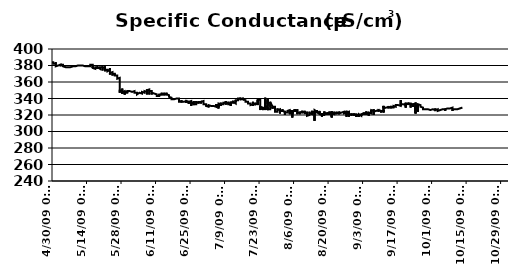
| Category | uS/cm |
|---|---|
| 10/13/09 | 329 |
| 10/13/09 | 328 |
| 10/13/09 | 328 |
| 10/13/09 | 328 |
| 10/13/09 | 328 |
| 10/13/09 | 328 |
| 10/13/09 | 328 |
| 10/13/09 | 328 |
| 10/13/09 | 328 |
| 10/13/09 | 328 |
| 10/13/09 | 328 |
| 10/13/09 | 328 |
| 10/13/09 | 328 |
| 10/13/09 | 328 |
| 10/13/09 | 328 |
| 10/13/09 | 328 |
| 10/13/09 | 328 |
| 10/13/09 | 329 |
| 10/13/09 | 329 |
| 10/13/09 | 329 |
| 10/13/09 | 329 |
| 10/13/09 | 329 |
| 10/13/09 | 329 |
| 10/13/09 | 329 |
| 10/13/09 | 329 |
| 10/13/09 | 329 |
| 10/13/09 | 329 |
| 10/13/09 | 329 |
| 10/13/09 | 329 |
| 10/13/09 | 328 |
| 10/13/09 | 328 |
| 10/13/09 | 328 |
| 10/12/09 | 328 |
| 10/12/09 | 328 |
| 10/12/09 | 328 |
| 10/12/09 | 328 |
| 10/12/09 | 328 |
| 10/12/09 | 328 |
| 10/12/09 | 328 |
| 10/12/09 | 328 |
| 10/12/09 | 328 |
| 10/12/09 | 328 |
| 10/12/09 | 328 |
| 10/12/09 | 328 |
| 10/12/09 | 328 |
| 10/12/09 | 328 |
| 10/12/09 | 328 |
| 10/12/09 | 328 |
| 10/12/09 | 328 |
| 10/12/09 | 328 |
| 10/12/09 | 328 |
| 10/12/09 | 328 |
| 10/12/09 | 328 |
| 10/12/09 | 328 |
| 10/12/09 | 328 |
| 10/12/09 | 328 |
| 10/12/09 | 328 |
| 10/12/09 | 328 |
| 10/12/09 | 328 |
| 10/12/09 | 328 |
| 10/12/09 | 328 |
| 10/12/09 | 328 |
| 10/12/09 | 328 |
| 10/12/09 | 328 |
| 10/12/09 | 328 |
| 10/12/09 | 328 |
| 10/12/09 | 328 |
| 10/12/09 | 328 |
| 10/12/09 | 328 |
| 10/12/09 | 328 |
| 10/12/09 | 328 |
| 10/12/09 | 328 |
| 10/12/09 | 328 |
| 10/12/09 | 328 |
| 10/12/09 | 328 |
| 10/12/09 | 328 |
| 10/12/09 | 328 |
| 10/12/09 | 328 |
| 10/12/09 | 328 |
| 10/12/09 | 328 |
| 10/11/09 | 327 |
| 10/11/09 | 327 |
| 10/11/09 | 328 |
| 10/11/09 | 328 |
| 10/11/09 | 328 |
| 10/11/09 | 328 |
| 10/11/09 | 328 |
| 10/11/09 | 328 |
| 10/11/09 | 328 |
| 10/11/09 | 328 |
| 10/11/09 | 328 |
| 10/11/09 | 327 |
| 10/11/09 | 327 |
| 10/11/09 | 327 |
| 10/11/09 | 328 |
| 10/11/09 | 328 |
| 10/11/09 | 328 |
| 10/11/09 | 327 |
| 10/11/09 | 328 |
| 10/11/09 | 327 |
| 10/11/09 | 327 |
| 10/11/09 | 327 |
| 10/11/09 | 327 |
| 10/11/09 | 327 |
| 10/11/09 | 327 |
| 10/11/09 | 327 |
| 10/11/09 | 327 |
| 10/11/09 | 328 |
| 10/11/09 | 328 |
| 10/11/09 | 328 |
| 10/11/09 | 328 |
| 10/11/09 | 328 |
| 10/11/09 | 328 |
| 10/11/09 | 328 |
| 10/11/09 | 328 |
| 10/11/09 | 328 |
| 10/11/09 | 328 |
| 10/11/09 | 328 |
| 10/11/09 | 328 |
| 10/11/09 | 328 |
| 10/11/09 | 328 |
| 10/11/09 | 328 |
| 10/11/09 | 328 |
| 10/11/09 | 328 |
| 10/11/09 | 328 |
| 10/11/09 | 327 |
| 10/11/09 | 327 |
| 10/11/09 | 327 |
| 10/10/09 | 327 |
| 10/10/09 | 327 |
| 10/10/09 | 327 |
| 10/10/09 | 327 |
| 10/10/09 | 327 |
| 10/10/09 | 327 |
| 10/10/09 | 327 |
| 10/10/09 | 327 |
| 10/10/09 | 327 |
| 10/10/09 | 326 |
| 10/10/09 | 326 |
| 10/10/09 | 326 |
| 10/10/09 | 326 |
| 10/10/09 | 326 |
| 10/10/09 | 326 |
| 10/10/09 | 326 |
| 10/10/09 | 327 |
| 10/10/09 | 327 |
| 10/10/09 | 326 |
| 10/10/09 | 327 |
| 10/10/09 | 327 |
| 10/10/09 | 327 |
| 10/10/09 | 327 |
| 10/10/09 | 327 |
| 10/10/09 | 327 |
| 10/10/09 | 326 |
| 10/10/09 | 326 |
| 10/10/09 | 327 |
| 10/10/09 | 327 |
| 10/10/09 | 327 |
| 10/10/09 | 327 |
| 10/10/09 | 327 |
| 10/10/09 | 326 |
| 10/10/09 | 326 |
| 10/10/09 | 326 |
| 10/10/09 | 327 |
| 10/10/09 | 327 |
| 10/10/09 | 328 |
| 10/10/09 | 328 |
| 10/10/09 | 328 |
| 10/10/09 | 328 |
| 10/10/09 | 327 |
| 10/10/09 | 327 |
| 10/10/09 | 327 |
| 10/10/09 | 327 |
| 10/10/09 | 327 |
| 10/10/09 | 327 |
| 10/10/09 | 327 |
| 10/9/09 | 327 |
| 10/9/09 | 327 |
| 10/9/09 | 327 |
| 10/9/09 | 328 |
| 10/9/09 | 327 |
| 10/9/09 | 327 |
| 10/9/09 | 327 |
| 10/9/09 | 327 |
| 10/9/09 | 327 |
| 10/9/09 | 327 |
| 10/9/09 | 327 |
| 10/9/09 | 328 |
| 10/9/09 | 328 |
| 10/9/09 | 327 |
| 10/9/09 | 328 |
| 10/9/09 | 328 |
| 10/9/09 | 327 |
| 10/9/09 | 327 |
| 10/9/09 | 327 |
| 10/9/09 | 327 |
| 10/9/09 | 327 |
| 10/9/09 | 326 |
| 10/9/09 | 327 |
| 10/9/09 | 327 |
| 10/9/09 | 327 |
| 10/9/09 | 326 |
| 10/9/09 | 326 |
| 10/9/09 | 326 |
| 10/9/09 | 326 |
| 10/9/09 | 325 |
| 10/9/09 | 324 |
| 10/9/09 | 326 |
| 10/9/09 | 326 |
| 10/9/09 | 327 |
| 10/9/09 | 328 |
| 10/9/09 | 328 |
| 10/9/09 | 328 |
| 10/9/09 | 328 |
| 10/9/09 | 328 |
| 10/9/09 | 329 |
| 10/9/09 | 328 |
| 10/9/09 | 328 |
| 10/9/09 | 328 |
| 10/9/09 | 329 |
| 10/9/09 | 328 |
| 10/9/09 | 328 |
| 10/9/09 | 328 |
| 10/9/09 | 328 |
| 10/8/09 | 328 |
| 10/8/09 | 327 |
| 10/8/09 | 328 |
| 10/8/09 | 328 |
| 10/8/09 | 328 |
| 10/8/09 | 328 |
| 10/8/09 | 328 |
| 10/8/09 | 328 |
| 10/8/09 | 328 |
| 10/8/09 | 328 |
| 10/8/09 | 327 |
| 10/8/09 | 328 |
| 10/8/09 | 328 |
| 10/8/09 | 328 |
| 10/8/09 | 328 |
| 10/8/09 | 329 |
| 10/8/09 | 328 |
| 10/8/09 | 328 |
| 10/8/09 | 328 |
| 10/8/09 | 328 |
| 10/8/09 | 328 |
| 10/8/09 | 328 |
| 10/8/09 | 328 |
| 10/8/09 | 328 |
| 10/8/09 | 328 |
| 10/8/09 | 329 |
| 10/8/09 | 329 |
| 10/8/09 | 329 |
| 10/8/09 | 328 |
| 10/8/09 | 329 |
| 10/8/09 | 328 |
| 10/8/09 | 328 |
| 10/8/09 | 328 |
| 10/8/09 | 328 |
| 10/8/09 | 328 |
| 10/8/09 | 328 |
| 10/8/09 | 328 |
| 10/8/09 | 328 |
| 10/8/09 | 328 |
| 10/8/09 | 328 |
| 10/8/09 | 328 |
| 10/8/09 | 328 |
| 10/8/09 | 328 |
| 10/8/09 | 328 |
| 10/8/09 | 328 |
| 10/8/09 | 328 |
| 10/8/09 | 328 |
| 10/8/09 | 328 |
| 10/7/09 | 328 |
| 10/7/09 | 328 |
| 10/7/09 | 328 |
| 10/7/09 | 328 |
| 10/7/09 | 328 |
| 10/7/09 | 328 |
| 10/7/09 | 327 |
| 10/7/09 | 327 |
| 10/7/09 | 328 |
| 10/7/09 | 328 |
| 10/7/09 | 328 |
| 10/7/09 | 327 |
| 10/7/09 | 327 |
| 10/7/09 | 327 |
| 10/7/09 | 327 |
| 10/7/09 | 328 |
| 10/7/09 | 328 |
| 10/7/09 | 328 |
| 10/7/09 | 327 |
| 10/7/09 | 328 |
| 10/7/09 | 328 |
| 10/7/09 | 327 |
| 10/7/09 | 327 |
| 10/7/09 | 327 |
| 10/7/09 | 328 |
| 10/7/09 | 327 |
| 10/7/09 | 328 |
| 10/7/09 | 327 |
| 10/7/09 | 327 |
| 10/7/09 | 327 |
| 10/7/09 | 327 |
| 10/7/09 | 327 |
| 10/7/09 | 328 |
| 10/7/09 | 327 |
| 10/7/09 | 327 |
| 10/7/09 | 327 |
| 10/7/09 | 328 |
| 10/7/09 | 327 |
| 10/7/09 | 328 |
| 10/7/09 | 327 |
| 10/7/09 | 328 |
| 10/7/09 | 327 |
| 10/7/09 | 327 |
| 10/7/09 | 327 |
| 10/7/09 | 327 |
| 10/7/09 | 327 |
| 10/7/09 | 327 |
| 10/7/09 | 327 |
| 10/6/09 | 327 |
| 10/6/09 | 327 |
| 10/6/09 | 327 |
| 10/6/09 | 326 |
| 10/6/09 | 326 |
| 10/6/09 | 326 |
| 10/6/09 | 327 |
| 10/6/09 | 327 |
| 10/6/09 | 327 |
| 10/6/09 | 327 |
| 10/6/09 | 327 |
| 10/6/09 | 326 |
| 10/6/09 | 326 |
| 10/6/09 | 327 |
| 10/6/09 | 327 |
| 10/6/09 | 327 |
| 10/6/09 | 327 |
| 10/6/09 | 326 |
| 10/6/09 | 326 |
| 10/6/09 | 327 |
| 10/6/09 | 326 |
| 10/6/09 | 327 |
| 10/6/09 | 327 |
| 10/6/09 | 326 |
| 10/6/09 | 326 |
| 10/6/09 | 327 |
| 10/6/09 | 327 |
| 10/6/09 | 327 |
| 10/6/09 | 327 |
| 10/6/09 | 326 |
| 10/6/09 | 326 |
| 10/6/09 | 326 |
| 10/6/09 | 327 |
| 10/6/09 | 326 |
| 10/6/09 | 327 |
| 10/6/09 | 327 |
| 10/6/09 | 327 |
| 10/6/09 | 325 |
| 10/6/09 | 327 |
| 10/6/09 | 327 |
| 10/6/09 | 327 |
| 10/6/09 | 327 |
| 10/6/09 | 327 |
| 10/6/09 | 327 |
| 10/6/09 | 327 |
| 10/6/09 | 327 |
| 10/6/09 | 327 |
| 10/6/09 | 327 |
| 10/5/09 | 327 |
| 10/5/09 | 327 |
| 10/5/09 | 326 |
| 10/5/09 | 327 |
| 10/5/09 | 326 |
| 10/5/09 | 326 |
| 10/5/09 | 327 |
| 10/5/09 | 327 |
| 10/5/09 | 327 |
| 10/5/09 | 327 |
| 10/5/09 | 326 |
| 10/5/09 | 327 |
| 10/5/09 | 327 |
| 10/5/09 | 327 |
| 10/5/09 | 327 |
| 10/5/09 | 326 |
| 10/5/09 | 327 |
| 10/5/09 | 326 |
| 10/5/09 | 326 |
| 10/5/09 | 327 |
| 10/5/09 | 326 |
| 10/5/09 | 326 |
| 10/5/09 | 326 |
| 10/5/09 | 326 |
| 10/5/09 | 326 |
| 10/5/09 | 326 |
| 10/5/09 | 326 |
| 10/5/09 | 326 |
| 10/5/09 | 326 |
| 10/5/09 | 326 |
| 10/5/09 | 326 |
| 10/5/09 | 326 |
| 10/5/09 | 326 |
| 10/5/09 | 326 |
| 10/5/09 | 326 |
| 10/5/09 | 326 |
| 10/5/09 | 326 |
| 10/5/09 | 326 |
| 10/5/09 | 326 |
| 10/5/09 | 326 |
| 10/5/09 | 326 |
| 10/5/09 | 326 |
| 10/5/09 | 326 |
| 10/5/09 | 326 |
| 10/5/09 | 326 |
| 10/5/09 | 326 |
| 10/5/09 | 326 |
| 10/5/09 | 326 |
| 10/4/09 | 326 |
| 10/4/09 | 326 |
| 10/4/09 | 326 |
| 10/4/09 | 326 |
| 10/4/09 | 326 |
| 10/4/09 | 326 |
| 10/4/09 | 326 |
| 10/4/09 | 326 |
| 10/4/09 | 326 |
| 10/4/09 | 326 |
| 10/4/09 | 326 |
| 10/4/09 | 326 |
| 10/4/09 | 326 |
| 10/4/09 | 326 |
| 10/4/09 | 326 |
| 10/4/09 | 326 |
| 10/4/09 | 326 |
| 10/4/09 | 326 |
| 10/4/09 | 326 |
| 10/4/09 | 326 |
| 10/4/09 | 326 |
| 10/4/09 | 326 |
| 10/4/09 | 326 |
| 10/4/09 | 326 |
| 10/4/09 | 326 |
| 10/4/09 | 326 |
| 10/4/09 | 326 |
| 10/4/09 | 326 |
| 10/4/09 | 326 |
| 10/4/09 | 326 |
| 10/4/09 | 326 |
| 10/4/09 | 326 |
| 10/4/09 | 326 |
| 10/4/09 | 326 |
| 10/4/09 | 326 |
| 10/4/09 | 326 |
| 10/4/09 | 326 |
| 10/4/09 | 326 |
| 10/4/09 | 325 |
| 10/4/09 | 326 |
| 10/4/09 | 325 |
| 10/4/09 | 325 |
| 10/4/09 | 325 |
| 10/4/09 | 325 |
| 10/4/09 | 325 |
| 10/4/09 | 325 |
| 10/4/09 | 325 |
| 10/4/09 | 325 |
| 10/3/09 | 325 |
| 10/3/09 | 325 |
| 10/3/09 | 326 |
| 10/3/09 | 326 |
| 10/3/09 | 326 |
| 10/3/09 | 326 |
| 10/3/09 | 326 |
| 10/3/09 | 326 |
| 10/3/09 | 325 |
| 10/3/09 | 326 |
| 10/3/09 | 326 |
| 10/3/09 | 326 |
| 10/3/09 | 326 |
| 10/3/09 | 326 |
| 10/3/09 | 325 |
| 10/3/09 | 325 |
| 10/3/09 | 325 |
| 10/3/09 | 324 |
| 10/3/09 | 325 |
| 10/3/09 | 325 |
| 10/3/09 | 325 |
| 10/3/09 | 325 |
| 10/3/09 | 325 |
| 10/3/09 | 325 |
| 10/3/09 | 326 |
| 10/3/09 | 326 |
| 10/3/09 | 327 |
| 10/3/09 | 326 |
| 10/3/09 | 327 |
| 10/3/09 | 326 |
| 10/3/09 | 326 |
| 10/3/09 | 326 |
| 10/3/09 | 326 |
| 10/3/09 | 326 |
| 10/3/09 | 326 |
| 10/3/09 | 326 |
| 10/3/09 | 326 |
| 10/3/09 | 326 |
| 10/3/09 | 327 |
| 10/3/09 | 326 |
| 10/3/09 | 326 |
| 10/3/09 | 326 |
| 10/3/09 | 326 |
| 10/3/09 | 326 |
| 10/3/09 | 326 |
| 10/3/09 | 326 |
| 10/3/09 | 326 |
| 10/3/09 | 326 |
| 10/2/09 | 326 |
| 10/2/09 | 326 |
| 10/2/09 | 326 |
| 10/2/09 | 326 |
| 10/2/09 | 326 |
| 10/2/09 | 326 |
| 10/2/09 | 326 |
| 10/2/09 | 326 |
| 10/2/09 | 327 |
| 10/2/09 | 326 |
| 10/2/09 | 326 |
| 10/2/09 | 326 |
| 10/2/09 | 326 |
| 10/2/09 | 326 |
| 10/2/09 | 326 |
| 10/2/09 | 326 |
| 10/2/09 | 326 |
| 10/2/09 | 327 |
| 10/2/09 | 328 |
| 10/2/09 | 328 |
| 10/2/09 | 328 |
| 10/2/09 | 328 |
| 10/2/09 | 328 |
| 10/2/09 | 328 |
| 10/2/09 | 328 |
| 10/2/09 | 328 |
| 10/2/09 | 327 |
| 10/2/09 | 327 |
| 10/2/09 | 327 |
| 10/2/09 | 327 |
| 10/2/09 | 327 |
| 10/2/09 | 327 |
| 10/2/09 | 326 |
| 10/2/09 | 327 |
| 10/2/09 | 327 |
| 10/2/09 | 327 |
| 10/2/09 | 327 |
| 10/2/09 | 327 |
| 10/2/09 | 327 |
| 10/2/09 | 327 |
| 10/2/09 | 327 |
| 10/2/09 | 327 |
| 10/2/09 | 327 |
| 10/2/09 | 327 |
| 10/2/09 | 326 |
| 10/2/09 | 327 |
| 10/2/09 | 326 |
| 10/2/09 | 327 |
| 10/1/09 | 327 |
| 10/1/09 | 326 |
| 10/1/09 | 327 |
| 10/1/09 | 327 |
| 10/1/09 | 327 |
| 10/1/09 | 326 |
| 10/1/09 | 326 |
| 10/1/09 | 326 |
| 10/1/09 | 326 |
| 10/1/09 | 326 |
| 10/1/09 | 327 |
| 10/1/09 | 326 |
| 10/1/09 | 327 |
| 10/1/09 | 326 |
| 10/1/09 | 326 |
| 10/1/09 | 326 |
| 10/1/09 | 327 |
| 10/1/09 | 327 |
| 10/1/09 | 326 |
| 10/1/09 | 327 |
| 10/1/09 | 326 |
| 10/1/09 | 327 |
| 10/1/09 | 327 |
| 10/1/09 | 326 |
| 10/1/09 | 326 |
| 10/1/09 | 327 |
| 10/1/09 | 327 |
| 10/1/09 | 327 |
| 10/1/09 | 326 |
| 10/1/09 | 326 |
| 10/1/09 | 326 |
| 10/1/09 | 326 |
| 10/1/09 | 326 |
| 10/1/09 | 326 |
| 10/1/09 | 326 |
| 10/1/09 | 326 |
| 10/1/09 | 327 |
| 10/1/09 | 326 |
| 10/1/09 | 326 |
| 10/1/09 | 326 |
| 10/1/09 | 326 |
| 10/1/09 | 326 |
| 10/1/09 | 326 |
| 10/1/09 | 326 |
| 10/1/09 | 327 |
| 10/1/09 | 326 |
| 10/1/09 | 326 |
| 10/1/09 | 327 |
| 9/30/09 | 326 |
| 9/30/09 | 326 |
| 9/30/09 | 326 |
| 9/30/09 | 326 |
| 9/30/09 | 326 |
| 9/30/09 | 326 |
| 9/30/09 | 327 |
| 9/30/09 | 326 |
| 9/30/09 | 327 |
| 9/30/09 | 327 |
| 9/30/09 | 327 |
| 9/30/09 | 327 |
| 9/30/09 | 327 |
| 9/30/09 | 326 |
| 9/30/09 | 327 |
| 9/30/09 | 327 |
| 9/30/09 | 327 |
| 9/30/09 | 327 |
| 9/30/09 | 327 |
| 9/30/09 | 327 |
| 9/30/09 | 327 |
| 9/30/09 | 327 |
| 9/30/09 | 326 |
| 9/30/09 | 327 |
| 9/30/09 | 327 |
| 9/30/09 | 327 |
| 9/30/09 | 327 |
| 9/30/09 | 327 |
| 9/30/09 | 327 |
| 9/30/09 | 327 |
| 9/30/09 | 327 |
| 9/30/09 | 327 |
| 9/30/09 | 327 |
| 9/30/09 | 327 |
| 9/30/09 | 326 |
| 9/30/09 | 327 |
| 9/30/09 | 327 |
| 9/30/09 | 326 |
| 9/30/09 | 326 |
| 9/30/09 | 327 |
| 9/30/09 | 327 |
| 9/30/09 | 327 |
| 9/30/09 | 327 |
| 9/30/09 | 327 |
| 9/30/09 | 327 |
| 9/30/09 | 326 |
| 9/30/09 | 327 |
| 9/30/09 | 327 |
| 9/29/09 | 327 |
| 9/29/09 | 327 |
| 9/29/09 | 327 |
| 9/29/09 | 327 |
| 9/29/09 | 327 |
| 9/29/09 | 327 |
| 9/29/09 | 327 |
| 9/29/09 | 327 |
| 9/29/09 | 327 |
| 9/29/09 | 327 |
| 9/29/09 | 327 |
| 9/29/09 | 327 |
| 9/29/09 | 327 |
| 9/29/09 | 327 |
| 9/29/09 | 327 |
| 9/29/09 | 327 |
| 9/29/09 | 327 |
| 9/29/09 | 327 |
| 9/29/09 | 327 |
| 9/29/09 | 327 |
| 9/29/09 | 327 |
| 9/29/09 | 326 |
| 9/29/09 | 326 |
| 9/29/09 | 327 |
| 9/29/09 | 327 |
| 9/29/09 | 326 |
| 9/29/09 | 327 |
| 9/29/09 | 327 |
| 9/29/09 | 327 |
| 9/29/09 | 327 |
| 9/29/09 | 327 |
| 9/29/09 | 326 |
| 9/29/09 | 327 |
| 9/29/09 | 327 |
| 9/29/09 | 327 |
| 9/29/09 | 327 |
| 9/29/09 | 327 |
| 9/29/09 | 327 |
| 9/29/09 | 326 |
| 9/29/09 | 326 |
| 9/29/09 | 326 |
| 9/29/09 | 327 |
| 9/29/09 | 326 |
| 9/29/09 | 326 |
| 9/29/09 | 326 |
| 9/29/09 | 326 |
| 9/29/09 | 326 |
| 9/29/09 | 326 |
| 9/28/09 | 327 |
| 9/28/09 | 327 |
| 9/28/09 | 326 |
| 9/28/09 | 327 |
| 9/28/09 | 327 |
| 9/28/09 | 327 |
| 9/28/09 | 327 |
| 9/28/09 | 327 |
| 9/28/09 | 327 |
| 9/28/09 | 326 |
| 9/28/09 | 327 |
| 9/28/09 | 327 |
| 9/28/09 | 327 |
| 9/28/09 | 327 |
| 9/28/09 | 327 |
| 9/28/09 | 327 |
| 9/28/09 | 327 |
| 9/28/09 | 327 |
| 9/28/09 | 327 |
| 9/28/09 | 327 |
| 9/28/09 | 326 |
| 9/28/09 | 327 |
| 9/28/09 | 326 |
| 9/28/09 | 326 |
| 9/28/09 | 327 |
| 9/28/09 | 326 |
| 9/28/09 | 327 |
| 9/28/09 | 326 |
| 9/28/09 | 327 |
| 9/28/09 | 327 |
| 9/28/09 | 327 |
| 9/28/09 | 327 |
| 9/28/09 | 327 |
| 9/28/09 | 327 |
| 9/28/09 | 327 |
| 9/28/09 | 327 |
| 9/28/09 | 326 |
| 9/28/09 | 327 |
| 9/28/09 | 327 |
| 9/28/09 | 327 |
| 9/28/09 | 328 |
| 9/28/09 | 328 |
| 9/28/09 | 327 |
| 9/28/09 | 327 |
| 9/28/09 | 327 |
| 9/28/09 | 328 |
| 9/28/09 | 327 |
| 9/28/09 | 327 |
| 9/27/09 | 327 |
| 9/27/09 | 328 |
| 9/27/09 | 328 |
| 9/27/09 | 328 |
| 9/27/09 | 328 |
| 9/27/09 | 328 |
| 9/27/09 | 327 |
| 9/27/09 | 328 |
| 9/27/09 | 328 |
| 9/27/09 | 328 |
| 9/27/09 | 327 |
| 9/27/09 | 328 |
| 9/27/09 | 327 |
| 9/27/09 | 328 |
| 9/27/09 | 328 |
| 9/27/09 | 328 |
| 9/27/09 | 328 |
| 9/27/09 | 327 |
| 9/27/09 | 327 |
| 9/27/09 | 328 |
| 9/27/09 | 328 |
| 9/27/09 | 328 |
| 9/27/09 | 328 |
| 9/27/09 | 328 |
| 9/27/09 | 328 |
| 9/27/09 | 328 |
| 9/27/09 | 328 |
| 9/27/09 | 328 |
| 9/27/09 | 328 |
| 9/27/09 | 328 |
| 9/27/09 | 328 |
| 9/27/09 | 328 |
| 9/27/09 | 328 |
| 9/27/09 | 329 |
| 9/27/09 | 329 |
| 9/27/09 | 330 |
| 9/27/09 | 329 |
| 9/27/09 | 330 |
| 9/27/09 | 330 |
| 9/27/09 | 330 |
| 9/27/09 | 330 |
| 9/27/09 | 330 |
| 9/27/09 | 330 |
| 9/27/09 | 330 |
| 9/27/09 | 330 |
| 9/27/09 | 330 |
| 9/27/09 | 330 |
| 9/27/09 | 330 |
| 9/26/09 | 330 |
| 9/26/09 | 330 |
| 9/26/09 | 330 |
| 9/26/09 | 330 |
| 9/26/09 | 330 |
| 9/26/09 | 329 |
| 9/26/09 | 330 |
| 9/26/09 | 329 |
| 9/26/09 | 329 |
| 9/26/09 | 329 |
| 9/26/09 | 330 |
| 9/26/09 | 330 |
| 9/26/09 | 330 |
| 9/26/09 | 330 |
| 9/26/09 | 330 |
| 9/26/09 | 331 |
| 9/26/09 | 331 |
| 9/26/09 | 331 |
| 9/26/09 | 331 |
| 9/26/09 | 332 |
| 9/26/09 | 332 |
| 9/26/09 | 332 |
| 9/26/09 | 332 |
| 9/26/09 | 333 |
| 9/26/09 | 332 |
| 9/26/09 | 332 |
| 9/26/09 | 332 |
| 9/26/09 | 332 |
| 9/26/09 | 332 |
| 9/26/09 | 332 |
| 9/26/09 | 332 |
| 9/26/09 | 333 |
| 9/26/09 | 333 |
| 9/26/09 | 333 |
| 9/26/09 | 333 |
| 9/26/09 | 333 |
| 9/26/09 | 333 |
| 9/26/09 | 332 |
| 9/26/09 | 332 |
| 9/26/09 | 332 |
| 9/26/09 | 332 |
| 9/26/09 | 332 |
| 9/26/09 | 332 |
| 9/26/09 | 333 |
| 9/26/09 | 333 |
| 9/26/09 | 333 |
| 9/26/09 | 333 |
| 9/26/09 | 333 |
| 9/25/09 | 333 |
| 9/25/09 | 332 |
| 9/25/09 | 332 |
| 9/25/09 | 333 |
| 9/25/09 | 333 |
| 9/25/09 | 333 |
| 9/25/09 | 333 |
| 9/25/09 | 333 |
| 9/25/09 | 332 |
| 9/25/09 | 333 |
| 9/25/09 | 333 |
| 9/25/09 | 333 |
| 9/25/09 | 333 |
| 9/25/09 | 333 |
| 9/25/09 | 332 |
| 9/25/09 | 332 |
| 9/25/09 | 332 |
| 9/25/09 | 332 |
| 9/25/09 | 332 |
| 9/25/09 | 332 |
| 9/25/09 | 332 |
| 9/25/09 | 333 |
| 9/25/09 | 333 |
| 9/25/09 | 333 |
| 9/25/09 | 332 |
| 9/25/09 | 332 |
| 9/25/09 | 324 |
| 9/25/09 | 332 |
| 9/25/09 | 331 |
| 9/25/09 | 332 |
| 9/25/09 | 332 |
| 9/25/09 | 332 |
| 9/25/09 | 332 |
| 9/25/09 | 332 |
| 9/25/09 | 333 |
| 9/25/09 | 333 |
| 9/25/09 | 333 |
| 9/25/09 | 332 |
| 9/25/09 | 333 |
| 9/25/09 | 332 |
| 9/25/09 | 332 |
| 9/25/09 | 332 |
| 9/25/09 | 331 |
| 9/25/09 | 331 |
| 9/25/09 | 331 |
| 9/25/09 | 331 |
| 9/25/09 | 331 |
| 9/25/09 | 331 |
| 9/24/09 | 331 |
| 9/24/09 | 330 |
| 9/24/09 | 331 |
| 9/24/09 | 331 |
| 9/24/09 | 332 |
| 9/24/09 | 332 |
| 9/24/09 | 333 |
| 9/24/09 | 333 |
| 9/24/09 | 332 |
| 9/24/09 | 333 |
| 9/24/09 | 333 |
| 9/24/09 | 332 |
| 9/24/09 | 332 |
| 9/24/09 | 335 |
| 9/24/09 | 332 |
| 9/24/09 | 331 |
| 9/24/09 | 322 |
| 9/24/09 | 332 |
| 9/24/09 | 331 |
| 9/24/09 | 331 |
| 9/24/09 | 332 |
| 9/24/09 | 322 |
| 9/24/09 | 328 |
| 9/24/09 | 328 |
| 9/24/09 | 330 |
| 9/24/09 | 331 |
| 9/24/09 | 330 |
| 9/24/09 | 330 |
| 9/24/09 | 330 |
| 9/24/09 | 330 |
| 9/24/09 | 330 |
| 9/24/09 | 330 |
| 9/24/09 | 331 |
| 9/24/09 | 330 |
| 9/24/09 | 330 |
| 9/24/09 | 329 |
| 9/24/09 | 329 |
| 9/24/09 | 329 |
| 9/24/09 | 328 |
| 9/24/09 | 329 |
| 9/24/09 | 330 |
| 9/24/09 | 332 |
| 9/24/09 | 332 |
| 9/24/09 | 333 |
| 9/24/09 | 333 |
| 9/24/09 | 333 |
| 9/24/09 | 334 |
| 9/24/09 | 333 |
| 9/23/09 | 333 |
| 9/23/09 | 333 |
| 9/23/09 | 333 |
| 9/23/09 | 332 |
| 9/23/09 | 332 |
| 9/23/09 | 332 |
| 9/23/09 | 332 |
| 9/23/09 | 333 |
| 9/23/09 | 333 |
| 9/23/09 | 333 |
| 9/23/09 | 333 |
| 9/23/09 | 333 |
| 9/23/09 | 334 |
| 9/23/09 | 333 |
| 9/23/09 | 333 |
| 9/23/09 | 330 |
| 9/23/09 | 333 |
| 9/23/09 | 330 |
| 9/23/09 | 333 |
| 9/23/09 | 333 |
| 9/23/09 | 332 |
| 9/23/09 | 333 |
| 9/23/09 | 333 |
| 9/23/09 | 333 |
| 9/23/09 | 333 |
| 9/23/09 | 332 |
| 9/23/09 | 332 |
| 9/23/09 | 333 |
| 9/23/09 | 333 |
| 9/23/09 | 333 |
| 9/23/09 | 333 |
| 9/23/09 | 333 |
| 9/23/09 | 333 |
| 9/23/09 | 333 |
| 9/23/09 | 333 |
| 9/23/09 | 333 |
| 9/23/09 | 333 |
| 9/23/09 | 333 |
| 9/23/09 | 333 |
| 9/23/09 | 333 |
| 9/23/09 | 333 |
| 9/23/09 | 332 |
| 9/23/09 | 332 |
| 9/23/09 | 332 |
| 9/23/09 | 332 |
| 9/23/09 | 332 |
| 9/23/09 | 332 |
| 9/23/09 | 333 |
| 9/22/09 | 333 |
| 9/22/09 | 333 |
| 9/22/09 | 333 |
| 9/22/09 | 333 |
| 9/22/09 | 333 |
| 9/22/09 | 333 |
| 9/22/09 | 333 |
| 9/22/09 | 333 |
| 9/22/09 | 333 |
| 9/22/09 | 333 |
| 9/22/09 | 333 |
| 9/22/09 | 333 |
| 9/22/09 | 332 |
| 9/22/09 | 332 |
| 9/22/09 | 329 |
| 9/22/09 | 332 |
| 9/22/09 | 332 |
| 9/22/09 | 332 |
| 9/22/09 | 332 |
| 9/22/09 | 332 |
| 9/22/09 | 332 |
| 9/22/09 | 333 |
| 9/22/09 | 332 |
| 9/22/09 | 331 |
| 9/22/09 | 331 |
| 9/22/09 | 331 |
| 9/22/09 | 331 |
| 9/22/09 | 332 |
| 9/22/09 | 333 |
| 9/22/09 | 333 |
| 9/22/09 | 333 |
| 9/22/09 | 332 |
| 9/22/09 | 333 |
| 9/22/09 | 334 |
| 9/22/09 | 334 |
| 9/22/09 | 333 |
| 9/22/09 | 332 |
| 9/22/09 | 332 |
| 9/22/09 | 332 |
| 9/22/09 | 333 |
| 9/22/09 | 333 |
| 9/22/09 | 334 |
| 9/22/09 | 334 |
| 9/22/09 | 334 |
| 9/22/09 | 334 |
| 9/22/09 | 334 |
| 9/22/09 | 334 |
| 9/22/09 | 334 |
| 9/21/09 | 334 |
| 9/21/09 | 333 |
| 9/21/09 | 333 |
| 9/21/09 | 333 |
| 9/21/09 | 334 |
| 9/21/09 | 334 |
| 9/21/09 | 334 |
| 9/21/09 | 335 |
| 9/21/09 | 334 |
| 9/21/09 | 334 |
| 9/21/09 | 333 |
| 9/21/09 | 334 |
| 9/21/09 | 334 |
| 9/21/09 | 334 |
| 9/21/09 | 334 |
| 9/21/09 | 334 |
| 9/21/09 | 333 |
| 9/21/09 | 332 |
| 9/21/09 | 333 |
| 9/21/09 | 332 |
| 9/21/09 | 332 |
| 9/21/09 | 332 |
| 9/21/09 | 333 |
| 9/21/09 | 332 |
| 9/21/09 | 333 |
| 9/21/09 | 333 |
| 9/21/09 | 333 |
| 9/21/09 | 334 |
| 9/21/09 | 333 |
| 9/21/09 | 333 |
| 9/21/09 | 333 |
| 9/21/09 | 333 |
| 9/21/09 | 333 |
| 9/21/09 | 333 |
| 9/21/09 | 333 |
| 9/21/09 | 333 |
| 9/21/09 | 333 |
| 9/21/09 | 333 |
| 9/21/09 | 333 |
| 9/21/09 | 333 |
| 9/21/09 | 333 |
| 9/21/09 | 333 |
| 9/21/09 | 333 |
| 9/21/09 | 333 |
| 9/21/09 | 333 |
| 9/21/09 | 333 |
| 9/21/09 | 333 |
| 9/21/09 | 334 |
| 9/20/09 | 333 |
| 9/20/09 | 333 |
| 9/20/09 | 333 |
| 9/20/09 | 333 |
| 9/20/09 | 333 |
| 9/20/09 | 332 |
| 9/20/09 | 333 |
| 9/20/09 | 335 |
| 9/20/09 | 335 |
| 9/20/09 | 335 |
| 9/20/09 | 329 |
| 9/20/09 | 334 |
| 9/20/09 | 333 |
| 9/20/09 | 333 |
| 9/20/09 | 333 |
| 9/20/09 | 332 |
| 9/20/09 | 332 |
| 9/20/09 | 332 |
| 9/20/09 | 333 |
| 9/20/09 | 333 |
| 9/20/09 | 333 |
| 9/20/09 | 334 |
| 9/20/09 | 334 |
| 9/20/09 | 333 |
| 9/20/09 | 332 |
| 9/20/09 | 332 |
| 9/20/09 | 332 |
| 9/20/09 | 333 |
| 9/20/09 | 333 |
| 9/20/09 | 333 |
| 9/20/09 | 333 |
| 9/20/09 | 333 |
| 9/20/09 | 333 |
| 9/20/09 | 333 |
| 9/20/09 | 333 |
| 9/20/09 | 333 |
| 9/20/09 | 333 |
| 9/20/09 | 333 |
| 9/20/09 | 333 |
| 9/20/09 | 333 |
| 9/20/09 | 333 |
| 9/20/09 | 333 |
| 9/20/09 | 333 |
| 9/20/09 | 333 |
| 9/20/09 | 333 |
| 9/20/09 | 333 |
| 9/20/09 | 333 |
| 9/20/09 | 333 |
| 9/19/09 | 333 |
| 9/19/09 | 333 |
| 9/19/09 | 333 |
| 9/19/09 | 333 |
| 9/19/09 | 334 |
| 9/19/09 | 334 |
| 9/19/09 | 334 |
| 9/19/09 | 333 |
| 9/19/09 | 333 |
| 9/19/09 | 333 |
| 9/19/09 | 334 |
| 9/19/09 | 334 |
| 9/19/09 | 334 |
| 9/19/09 | 332 |
| 9/19/09 | 332 |
| 9/19/09 | 332 |
| 9/19/09 | 332 |
| 9/19/09 | 333 |
| 9/19/09 | 334 |
| 9/19/09 | 334 |
| 9/19/09 | 334 |
| 9/19/09 | 333 |
| 9/19/09 | 333 |
| 9/19/09 | 333 |
| 9/19/09 | 333 |
| 9/19/09 | 332 |
| 9/19/09 | 332 |
| 9/19/09 | 332 |
| 9/19/09 | 332 |
| 9/19/09 | 332 |
| 9/19/09 | 333 |
| 9/19/09 | 333 |
| 9/19/09 | 333 |
| 9/19/09 | 332 |
| 9/19/09 | 333 |
| 9/19/09 | 333 |
| 9/19/09 | 333 |
| 9/19/09 | 333 |
| 9/19/09 | 333 |
| 9/19/09 | 333 |
| 9/19/09 | 333 |
| 9/19/09 | 333 |
| 9/19/09 | 333 |
| 9/19/09 | 333 |
| 9/19/09 | 333 |
| 9/19/09 | 333 |
| 9/19/09 | 333 |
| 9/19/09 | 333 |
| 9/18/09 | 333 |
| 9/18/09 | 333 |
| 9/18/09 | 332 |
| 9/18/09 | 332 |
| 9/18/09 | 332 |
| 9/18/09 | 332 |
| 9/18/09 | 332 |
| 9/18/09 | 331 |
| 9/18/09 | 332 |
| 9/18/09 | 338 |
| 9/18/09 | 333 |
| 9/18/09 | 333 |
| 9/18/09 | 333 |
| 9/18/09 | 333 |
| 9/18/09 | 332 |
| 9/18/09 | 332 |
| 9/18/09 | 332 |
| 9/18/09 | 332 |
| 9/18/09 | 332 |
| 9/18/09 | 333 |
| 9/18/09 | 334 |
| 9/18/09 | 333 |
| 9/18/09 | 333 |
| 9/18/09 | 333 |
| 9/18/09 | 333 |
| 9/18/09 | 333 |
| 9/18/09 | 333 |
| 9/18/09 | 332 |
| 9/18/09 | 333 |
| 9/18/09 | 332 |
| 9/18/09 | 333 |
| 9/18/09 | 333 |
| 9/18/09 | 333 |
| 9/18/09 | 333 |
| 9/18/09 | 333 |
| 9/18/09 | 333 |
| 9/18/09 | 332 |
| 9/18/09 | 332 |
| 9/18/09 | 332 |
| 9/18/09 | 331 |
| 9/18/09 | 331 |
| 9/18/09 | 331 |
| 9/18/09 | 332 |
| 9/18/09 | 332 |
| 9/18/09 | 331 |
| 9/18/09 | 331 |
| 9/18/09 | 331 |
| 9/18/09 | 332 |
| 9/17/09 | 332 |
| 9/17/09 | 332 |
| 9/17/09 | 332 |
| 9/17/09 | 332 |
| 9/17/09 | 332 |
| 9/17/09 | 332 |
| 9/17/09 | 332 |
| 9/17/09 | 332 |
| 9/17/09 | 332 |
| 9/17/09 | 332 |
| 9/17/09 | 332 |
| 9/17/09 | 332 |
| 9/17/09 | 332 |
| 9/17/09 | 332 |
| 9/17/09 | 332 |
| 9/17/09 | 332 |
| 9/17/09 | 332 |
| 9/17/09 | 333 |
| 9/17/09 | 333 |
| 9/17/09 | 332 |
| 9/17/09 | 332 |
| 9/17/09 | 332 |
| 9/17/09 | 332 |
| 9/17/09 | 332 |
| 9/17/09 | 332 |
| 9/17/09 | 332 |
| 9/17/09 | 332 |
| 9/17/09 | 332 |
| 9/17/09 | 332 |
| 9/17/09 | 332 |
| 9/17/09 | 332 |
| 9/17/09 | 332 |
| 9/17/09 | 332 |
| 9/17/09 | 333 |
| 9/17/09 | 332 |
| 9/17/09 | 333 |
| 9/17/09 | 333 |
| 9/17/09 | 333 |
| 9/17/09 | 332 |
| 9/17/09 | 332 |
| 9/17/09 | 332 |
| 9/17/09 | 332 |
| 9/17/09 | 332 |
| 9/17/09 | 332 |
| 9/17/09 | 332 |
| 9/17/09 | 332 |
| 9/17/09 | 332 |
| 9/17/09 | 332 |
| 9/16/09 | 332 |
| 9/16/09 | 332 |
| 9/16/09 | 332 |
| 9/16/09 | 332 |
| 9/16/09 | 332 |
| 9/16/09 | 332 |
| 9/16/09 | 332 |
| 9/16/09 | 332 |
| 9/16/09 | 332 |
| 9/16/09 | 332 |
| 9/16/09 | 332 |
| 9/16/09 | 331 |
| 9/16/09 | 332 |
| 9/16/09 | 331 |
| 9/16/09 | 332 |
| 9/16/09 | 331 |
| 9/16/09 | 331 |
| 9/16/09 | 331 |
| 9/16/09 | 331 |
| 9/16/09 | 331 |
| 9/16/09 | 331 |
| 9/16/09 | 331 |
| 9/16/09 | 331 |
| 9/16/09 | 331 |
| 9/16/09 | 331 |
| 9/16/09 | 331 |
| 9/16/09 | 331 |
| 9/16/09 | 331 |
| 9/16/09 | 331 |
| 9/16/09 | 331 |
| 9/16/09 | 331 |
| 9/16/09 | 331 |
| 9/16/09 | 331 |
| 9/16/09 | 331 |
| 9/16/09 | 331 |
| 9/16/09 | 331 |
| 9/16/09 | 331 |
| 9/16/09 | 331 |
| 9/16/09 | 331 |
| 9/16/09 | 331 |
| 9/16/09 | 331 |
| 9/16/09 | 331 |
| 9/16/09 | 331 |
| 9/16/09 | 330 |
| 9/16/09 | 330 |
| 9/16/09 | 330 |
| 9/16/09 | 330 |
| 9/16/09 | 331 |
| 9/15/09 | 331 |
| 9/15/09 | 331 |
| 9/15/09 | 331 |
| 9/15/09 | 331 |
| 9/15/09 | 329 |
| 9/15/09 | 329 |
| 9/15/09 | 329 |
| 9/15/09 | 329 |
| 9/15/09 | 329 |
| 9/15/09 | 331 |
| 9/15/09 | 330 |
| 9/15/09 | 330 |
| 9/15/09 | 332 |
| 9/15/09 | 331 |
| 9/15/09 | 332 |
| 9/15/09 | 331 |
| 9/15/09 | 331 |
| 9/15/09 | 331 |
| 9/15/09 | 331 |
| 9/15/09 | 331 |
| 9/15/09 | 331 |
| 9/15/09 | 331 |
| 9/15/09 | 331 |
| 9/15/09 | 332 |
| 9/15/09 | 332 |
| 9/15/09 | 332 |
| 9/15/09 | 332 |
| 9/15/09 | 331 |
| 9/15/09 | 331 |
| 9/15/09 | 331 |
| 9/15/09 | 331 |
| 9/15/09 | 331 |
| 9/15/09 | 330 |
| 9/15/09 | 330 |
| 9/15/09 | 331 |
| 9/15/09 | 330 |
| 9/15/09 | 331 |
| 9/15/09 | 330 |
| 9/15/09 | 330 |
| 9/15/09 | 331 |
| 9/15/09 | 331 |
| 9/15/09 | 330 |
| 9/15/09 | 330 |
| 9/15/09 | 330 |
| 9/15/09 | 330 |
| 9/15/09 | 330 |
| 9/15/09 | 330 |
| 9/15/09 | 329 |
| 9/14/09 | 329 |
| 9/14/09 | 329 |
| 9/14/09 | 329 |
| 9/14/09 | 329 |
| 9/14/09 | 329 |
| 9/14/09 | 329 |
| 9/14/09 | 329 |
| 9/14/09 | 329 |
| 9/14/09 | 328 |
| 9/14/09 | 330 |
| 9/14/09 | 330 |
| 9/14/09 | 330 |
| 9/14/09 | 331 |
| 9/14/09 | 330 |
| 9/14/09 | 329 |
| 9/14/09 | 329 |
| 9/14/09 | 329 |
| 9/14/09 | 329 |
| 9/14/09 | 330 |
| 9/14/09 | 329 |
| 9/14/09 | 329 |
| 9/14/09 | 331 |
| 9/14/09 | 331 |
| 9/14/09 | 331 |
| 9/14/09 | 331 |
| 9/14/09 | 331 |
| 9/14/09 | 331 |
| 9/14/09 | 330 |
| 9/14/09 | 330 |
| 9/14/09 | 330 |
| 9/14/09 | 330 |
| 9/14/09 | 329 |
| 9/14/09 | 330 |
| 9/14/09 | 330 |
| 9/14/09 | 330 |
| 9/14/09 | 330 |
| 9/14/09 | 330 |
| 9/14/09 | 330 |
| 9/14/09 | 329 |
| 9/14/09 | 329 |
| 9/14/09 | 329 |
| 9/14/09 | 329 |
| 9/14/09 | 329 |
| 9/14/09 | 329 |
| 9/14/09 | 329 |
| 9/14/09 | 330 |
| 9/14/09 | 330 |
| 9/14/09 | 329 |
| 9/13/09 | 329 |
| 9/13/09 | 329 |
| 9/13/09 | 329 |
| 9/13/09 | 329 |
| 9/13/09 | 329 |
| 9/13/09 | 329 |
| 9/13/09 | 329 |
| 9/13/09 | 329 |
| 9/13/09 | 329 |
| 9/13/09 | 328 |
| 9/13/09 | 328 |
| 9/13/09 | 328 |
| 9/13/09 | 329 |
| 9/13/09 | 329 |
| 9/13/09 | 329 |
| 9/13/09 | 329 |
| 9/13/09 | 331 |
| 9/13/09 | 330 |
| 9/13/09 | 330 |
| 9/13/09 | 330 |
| 9/13/09 | 329 |
| 9/13/09 | 329 |
| 9/13/09 | 329 |
| 9/13/09 | 329 |
| 9/13/09 | 330 |
| 9/13/09 | 330 |
| 9/13/09 | 330 |
| 9/13/09 | 329 |
| 9/13/09 | 329 |
| 9/13/09 | 329 |
| 9/13/09 | 329 |
| 9/13/09 | 329 |
| 9/13/09 | 329 |
| 9/13/09 | 329 |
| 9/13/09 | 329 |
| 9/13/09 | 329 |
| 9/13/09 | 329 |
| 9/13/09 | 329 |
| 9/13/09 | 329 |
| 9/13/09 | 329 |
| 9/13/09 | 329 |
| 9/13/09 | 329 |
| 9/13/09 | 329 |
| 9/13/09 | 329 |
| 9/13/09 | 329 |
| 9/13/09 | 329 |
| 9/13/09 | 329 |
| 9/13/09 | 329 |
| 9/12/09 | 329 |
| 9/12/09 | 329 |
| 9/12/09 | 329 |
| 9/12/09 | 329 |
| 9/12/09 | 328 |
| 9/12/09 | 328 |
| 9/12/09 | 329 |
| 9/12/09 | 328 |
| 9/12/09 | 329 |
| 9/12/09 | 329 |
| 9/12/09 | 330 |
| 9/12/09 | 329 |
| 9/12/09 | 329 |
| 9/12/09 | 329 |
| 9/12/09 | 329 |
| 9/12/09 | 329 |
| 9/12/09 | 329 |
| 9/12/09 | 328 |
| 9/12/09 | 328 |
| 9/12/09 | 329 |
| 9/12/09 | 329 |
| 9/12/09 | 329 |
| 9/12/09 | 329 |
| 9/12/09 | 329 |
| 9/12/09 | 329 |
| 9/12/09 | 329 |
| 9/12/09 | 329 |
| 9/12/09 | 329 |
| 9/12/09 | 329 |
| 9/12/09 | 329 |
| 9/12/09 | 329 |
| 9/12/09 | 328 |
| 9/12/09 | 329 |
| 9/12/09 | 328 |
| 9/12/09 | 329 |
| 9/12/09 | 329 |
| 9/12/09 | 329 |
| 9/12/09 | 329 |
| 9/12/09 | 329 |
| 9/12/09 | 328 |
| 9/12/09 | 329 |
| 9/12/09 | 329 |
| 9/12/09 | 328 |
| 9/12/09 | 328 |
| 9/12/09 | 328 |
| 9/12/09 | 328 |
| 9/12/09 | 328 |
| 9/12/09 | 328 |
| 9/11/09 | 328 |
| 9/11/09 | 328 |
| 9/11/09 | 328 |
| 9/11/09 | 328 |
| 9/11/09 | 328 |
| 9/11/09 | 328 |
| 9/11/09 | 328 |
| 9/11/09 | 328 |
| 9/11/09 | 328 |
| 9/11/09 | 328 |
| 9/11/09 | 328 |
| 9/11/09 | 328 |
| 9/11/09 | 328 |
| 9/11/09 | 328 |
| 9/11/09 | 328 |
| 9/11/09 | 328 |
| 9/11/09 | 328 |
| 9/11/09 | 328 |
| 9/11/09 | 331 |
| 9/11/09 | 330 |
| 9/11/09 | 329 |
| 9/11/09 | 329 |
| 9/11/09 | 329 |
| 9/11/09 | 329 |
| 9/11/09 | 329 |
| 9/11/09 | 329 |
| 9/11/09 | 331 |
| 9/11/09 | 324 |
| 9/11/09 | 324 |
| 9/11/09 | 325 |
| 9/11/09 | 325 |
| 9/11/09 | 325 |
| 9/11/09 | 325 |
| 9/11/09 | 325 |
| 9/11/09 | 325 |
| 9/11/09 | 325 |
| 9/11/09 | 326 |
| 9/11/09 | 326 |
| 9/11/09 | 326 |
| 9/11/09 | 326 |
| 9/11/09 | 325 |
| 9/11/09 | 325 |
| 9/11/09 | 325 |
| 9/11/09 | 325 |
| 9/11/09 | 325 |
| 9/11/09 | 323 |
| 9/11/09 | 325 |
| 9/10/09 | 325 |
| 9/10/09 | 325 |
| 9/10/09 | 325 |
| 9/10/09 | 325 |
| 9/10/09 | 325 |
| 9/10/09 | 325 |
| 9/10/09 | 325 |
| 9/10/09 | 325 |
| 9/10/09 | 325 |
| 9/10/09 | 325 |
| 9/10/09 | 325 |
| 9/10/09 | 325 |
| 9/10/09 | 325 |
| 9/10/09 | 325 |
| 9/10/09 | 325 |
| 9/10/09 | 325 |
| 9/10/09 | 325 |
| 9/10/09 | 324 |
| 9/10/09 | 324 |
| 9/10/09 | 324 |
| 9/10/09 | 325 |
| 9/10/09 | 325 |
| 9/10/09 | 325 |
| 9/10/09 | 325 |
| 9/10/09 | 325 |
| 9/10/09 | 325 |
| 9/10/09 | 324 |
| 9/10/09 | 325 |
| 9/10/09 | 325 |
| 9/10/09 | 326 |
| 9/10/09 | 325 |
| 9/10/09 | 325 |
| 9/10/09 | 326 |
| 9/10/09 | 326 |
| 9/10/09 | 326 |
| 9/10/09 | 326 |
| 9/10/09 | 326 |
| 9/10/09 | 326 |
| 9/10/09 | 326 |
| 9/10/09 | 326 |
| 9/10/09 | 323 |
| 9/10/09 | 325 |
| 9/10/09 | 326 |
| 9/10/09 | 326 |
| 9/10/09 | 326 |
| 9/10/09 | 325 |
| 9/10/09 | 325 |
| 9/10/09 | 326 |
| 9/9/09 | 326 |
| 9/9/09 | 326 |
| 9/9/09 | 326 |
| 9/9/09 | 326 |
| 9/9/09 | 326 |
| 9/9/09 | 326 |
| 9/9/09 | 326 |
| 9/9/09 | 325 |
| 9/9/09 | 325 |
| 9/9/09 | 325 |
| 9/9/09 | 325 |
| 9/9/09 | 326 |
| 9/9/09 | 325 |
| 9/9/09 | 324 |
| 9/9/09 | 325 |
| 9/9/09 | 325 |
| 9/9/09 | 325 |
| 9/9/09 | 325 |
| 9/9/09 | 325 |
| 9/9/09 | 324 |
| 9/9/09 | 324 |
| 9/9/09 | 324 |
| 9/9/09 | 324 |
| 9/9/09 | 325 |
| 9/9/09 | 326 |
| 9/9/09 | 326 |
| 9/9/09 | 326 |
| 9/9/09 | 326 |
| 9/9/09 | 325 |
| 9/9/09 | 326 |
| 9/9/09 | 326 |
| 9/9/09 | 326 |
| 9/9/09 | 325 |
| 9/9/09 | 325 |
| 9/9/09 | 326 |
| 9/9/09 | 326 |
| 9/9/09 | 326 |
| 9/9/09 | 326 |
| 9/9/09 | 326 |
| 9/9/09 | 326 |
| 9/9/09 | 326 |
| 9/9/09 | 326 |
| 9/9/09 | 325 |
| 9/9/09 | 325 |
| 9/9/09 | 325 |
| 9/9/09 | 326 |
| 9/9/09 | 326 |
| 9/9/09 | 325 |
| 9/8/09 | 325 |
| 9/8/09 | 325 |
| 9/8/09 | 325 |
| 9/8/09 | 325 |
| 9/8/09 | 325 |
| 9/8/09 | 325 |
| 9/8/09 | 324 |
| 9/8/09 | 324 |
| 9/8/09 | 324 |
| 9/8/09 | 324 |
| 9/8/09 | 324 |
| 9/8/09 | 324 |
| 9/8/09 | 324 |
| 9/8/09 | 325 |
| 9/8/09 | 325 |
| 9/8/09 | 324 |
| 9/8/09 | 324 |
| 9/8/09 | 324 |
| 9/8/09 | 324 |
| 9/8/09 | 324 |
| 9/8/09 | 325 |
| 9/8/09 | 325 |
| 9/8/09 | 325 |
| 9/8/09 | 325 |
| 9/8/09 | 325 |
| 9/8/09 | 325 |
| 9/8/09 | 325 |
| 9/8/09 | 325 |
| 9/8/09 | 325 |
| 9/8/09 | 325 |
| 9/8/09 | 325 |
| 9/8/09 | 325 |
| 9/8/09 | 325 |
| 9/8/09 | 325 |
| 9/8/09 | 325 |
| 9/8/09 | 325 |
| 9/8/09 | 325 |
| 9/8/09 | 325 |
| 9/8/09 | 325 |
| 9/8/09 | 325 |
| 9/8/09 | 325 |
| 9/8/09 | 325 |
| 9/8/09 | 325 |
| 9/8/09 | 325 |
| 9/8/09 | 325 |
| 9/8/09 | 325 |
| 9/8/09 | 325 |
| 9/8/09 | 324 |
| 9/7/09 | 324 |
| 9/7/09 | 324 |
| 9/7/09 | 324 |
| 9/7/09 | 320 |
| 9/7/09 | 323 |
| 9/7/09 | 324 |
| 9/7/09 | 324 |
| 9/7/09 | 324 |
| 9/7/09 | 323 |
| 9/7/09 | 323 |
| 9/7/09 | 324 |
| 9/7/09 | 324 |
| 9/7/09 | 325 |
| 9/7/09 | 325 |
| 9/7/09 | 325 |
| 9/7/09 | 324 |
| 9/7/09 | 324 |
| 9/7/09 | 324 |
| 9/7/09 | 324 |
| 9/7/09 | 325 |
| 9/7/09 | 325 |
| 9/7/09 | 325 |
| 9/7/09 | 325 |
| 9/7/09 | 325 |
| 9/7/09 | 325 |
| 9/7/09 | 325 |
| 9/7/09 | 325 |
| 9/7/09 | 325 |
| 9/7/09 | 325 |
| 9/7/09 | 325 |
| 9/7/09 | 324 |
| 9/7/09 | 325 |
| 9/7/09 | 325 |
| 9/7/09 | 325 |
| 9/7/09 | 324 |
| 9/7/09 | 324 |
| 9/7/09 | 325 |
| 9/7/09 | 326 |
| 9/7/09 | 327 |
| 9/7/09 | 326 |
| 9/7/09 | 325 |
| 9/7/09 | 326 |
| 9/7/09 | 326 |
| 9/7/09 | 325 |
| 9/7/09 | 325 |
| 9/7/09 | 326 |
| 9/7/09 | 325 |
| 9/7/09 | 325 |
| 9/6/09 | 326 |
| 9/6/09 | 326 |
| 9/6/09 | 326 |
| 9/6/09 | 324 |
| 9/6/09 | 326 |
| 9/6/09 | 324 |
| 9/6/09 | 326 |
| 9/6/09 | 325 |
| 9/6/09 | 325 |
| 9/6/09 | 324 |
| 9/6/09 | 324 |
| 9/6/09 | 324 |
| 9/6/09 | 323 |
| 9/6/09 | 323 |
| 9/6/09 | 322 |
| 9/6/09 | 322 |
| 9/6/09 | 322 |
| 9/6/09 | 323 |
| 9/6/09 | 323 |
| 9/6/09 | 322 |
| 9/6/09 | 322 |
| 9/6/09 | 322 |
| 9/6/09 | 322 |
| 9/6/09 | 322 |
| 9/6/09 | 322 |
| 9/6/09 | 323 |
| 9/6/09 | 323 |
| 9/6/09 | 323 |
| 9/6/09 | 323 |
| 9/6/09 | 324 |
| 9/6/09 | 324 |
| 9/6/09 | 324 |
| 9/6/09 | 323 |
| 9/6/09 | 323 |
| 9/6/09 | 323 |
| 9/6/09 | 323 |
| 9/6/09 | 323 |
| 9/6/09 | 323 |
| 9/6/09 | 323 |
| 9/6/09 | 323 |
| 9/6/09 | 323 |
| 9/6/09 | 323 |
| 9/6/09 | 323 |
| 9/6/09 | 323 |
| 9/6/09 | 323 |
| 9/6/09 | 323 |
| 9/6/09 | 322 |
| 9/6/09 | 322 |
| 9/5/09 | 323 |
| 9/5/09 | 323 |
| 9/5/09 | 323 |
| 9/5/09 | 322 |
| 9/5/09 | 322 |
| 9/5/09 | 322 |
| 9/5/09 | 322 |
| 9/5/09 | 322 |
| 9/5/09 | 322 |
| 9/5/09 | 322 |
| 9/5/09 | 323 |
| 9/5/09 | 321 |
| 9/5/09 | 321 |
| 9/5/09 | 319 |
| 9/5/09 | 323 |
| 9/5/09 | 322 |
| 9/5/09 | 323 |
| 9/5/09 | 321 |
| 9/5/09 | 322 |
| 9/5/09 | 322 |
| 9/5/09 | 323 |
| 9/5/09 | 322 |
| 9/5/09 | 323 |
| 9/5/09 | 324 |
| 9/5/09 | 323 |
| 9/5/09 | 322 |
| 9/5/09 | 322 |
| 9/5/09 | 323 |
| 9/5/09 | 323 |
| 9/5/09 | 323 |
| 9/5/09 | 322 |
| 9/5/09 | 323 |
| 9/5/09 | 323 |
| 9/5/09 | 323 |
| 9/5/09 | 323 |
| 9/5/09 | 323 |
| 9/5/09 | 323 |
| 9/5/09 | 323 |
| 9/5/09 | 323 |
| 9/5/09 | 323 |
| 9/5/09 | 322 |
| 9/5/09 | 323 |
| 9/5/09 | 322 |
| 9/5/09 | 322 |
| 9/5/09 | 321 |
| 9/5/09 | 321 |
| 9/5/09 | 321 |
| 9/5/09 | 321 |
| 9/4/09 | 322 |
| 9/4/09 | 322 |
| 9/4/09 | 322 |
| 9/4/09 | 322 |
| 9/4/09 | 322 |
| 9/4/09 | 322 |
| 9/4/09 | 322 |
| 9/4/09 | 322 |
| 9/4/09 | 324 |
| 9/4/09 | 323 |
| 9/4/09 | 323 |
| 9/4/09 | 324 |
| 9/4/09 | 324 |
| 9/4/09 | 323 |
| 9/4/09 | 322 |
| 9/4/09 | 322 |
| 9/4/09 | 322 |
| 9/4/09 | 322 |
| 9/4/09 | 323 |
| 9/4/09 | 323 |
| 9/4/09 | 323 |
| 9/4/09 | 324 |
| 9/4/09 | 323 |
| 9/4/09 | 323 |
| 9/4/09 | 323 |
| 9/4/09 | 322 |
| 9/4/09 | 322 |
| 9/4/09 | 322 |
| 9/4/09 | 322 |
| 9/4/09 | 322 |
| 9/4/09 | 322 |
| 9/4/09 | 321 |
| 9/4/09 | 321 |
| 9/4/09 | 320 |
| 9/4/09 | 319 |
| 9/4/09 | 320 |
| 9/4/09 | 320 |
| 9/4/09 | 319 |
| 9/4/09 | 321 |
| 9/4/09 | 321 |
| 9/4/09 | 322 |
| 9/4/09 | 322 |
| 9/4/09 | 322 |
| 9/4/09 | 321 |
| 9/4/09 | 322 |
| 9/4/09 | 322 |
| 9/4/09 | 322 |
| 9/4/09 | 322 |
| 9/3/09 | 322 |
| 9/3/09 | 322 |
| 9/3/09 | 321 |
| 9/3/09 | 321 |
| 9/3/09 | 321 |
| 9/3/09 | 321 |
| 9/3/09 | 321 |
| 9/3/09 | 321 |
| 9/3/09 | 322 |
| 9/3/09 | 321 |
| 9/3/09 | 322 |
| 9/3/09 | 321 |
| 9/3/09 | 322 |
| 9/3/09 | 321 |
| 9/3/09 | 322 |
| 9/3/09 | 322 |
| 9/3/09 | 321 |
| 9/3/09 | 323 |
| 9/3/09 | 323 |
| 9/3/09 | 321 |
| 9/3/09 | 321 |
| 9/3/09 | 320 |
| 9/3/09 | 321 |
| 9/3/09 | 321 |
| 9/3/09 | 322 |
| 9/3/09 | 322 |
| 9/3/09 | 322 |
| 9/3/09 | 322 |
| 9/3/09 | 321 |
| 9/3/09 | 321 |
| 9/3/09 | 321 |
| 9/3/09 | 321 |
| 9/3/09 | 321 |
| 9/3/09 | 321 |
| 9/3/09 | 321 |
| 9/3/09 | 321 |
| 9/3/09 | 321 |
| 9/3/09 | 321 |
| 9/3/09 | 321 |
| 9/3/09 | 320 |
| 9/3/09 | 321 |
| 9/3/09 | 321 |
| 9/3/09 | 321 |
| 9/3/09 | 321 |
| 9/3/09 | 322 |
| 9/3/09 | 322 |
| 9/3/09 | 321 |
| 9/3/09 | 321 |
| 9/2/09 | 321 |
| 9/2/09 | 321 |
| 9/2/09 | 321 |
| 9/2/09 | 320 |
| 9/2/09 | 320 |
| 9/2/09 | 320 |
| 9/2/09 | 320 |
| 9/2/09 | 319 |
| 9/2/09 | 320 |
| 9/2/09 | 321 |
| 9/2/09 | 321 |
| 9/2/09 | 321 |
| 9/2/09 | 322 |
| 9/2/09 | 321 |
| 9/2/09 | 320 |
| 9/2/09 | 320 |
| 9/2/09 | 321 |
| 9/2/09 | 321 |
| 9/2/09 | 320 |
| 9/2/09 | 320 |
| 9/2/09 | 320 |
| 9/2/09 | 320 |
| 9/2/09 | 320 |
| 9/2/09 | 321 |
| 9/2/09 | 321 |
| 9/2/09 | 322 |
| 9/2/09 | 322 |
| 9/2/09 | 322 |
| 9/2/09 | 321 |
| 9/2/09 | 321 |
| 9/2/09 | 321 |
| 9/2/09 | 320 |
| 9/2/09 | 321 |
| 9/2/09 | 321 |
| 9/2/09 | 321 |
| 9/2/09 | 321 |
| 9/2/09 | 321 |
| 9/2/09 | 321 |
| 9/2/09 | 321 |
| 9/2/09 | 320 |
| 9/2/09 | 320 |
| 9/2/09 | 320 |
| 9/2/09 | 320 |
| 9/2/09 | 319 |
| 9/2/09 | 320 |
| 9/2/09 | 320 |
| 9/2/09 | 320 |
| 9/2/09 | 320 |
| 9/1/09 | 321 |
| 9/1/09 | 320 |
| 9/1/09 | 321 |
| 9/1/09 | 321 |
| 9/1/09 | 320 |
| 9/1/09 | 320 |
| 9/1/09 | 320 |
| 9/1/09 | 321 |
| 9/1/09 | 321 |
| 9/1/09 | 320 |
| 9/1/09 | 321 |
| 9/1/09 | 320 |
| 9/1/09 | 319 |
| 9/1/09 | 319 |
| 9/1/09 | 321 |
| 9/1/09 | 320 |
| 9/1/09 | 318 |
| 9/1/09 | 320 |
| 9/1/09 | 320 |
| 9/1/09 | 319 |
| 9/1/09 | 319 |
| 9/1/09 | 320 |
| 9/1/09 | 320 |
| 9/1/09 | 320 |
| 9/1/09 | 320 |
| 9/1/09 | 320 |
| 9/1/09 | 321 |
| 9/1/09 | 321 |
| 9/1/09 | 321 |
| 9/1/09 | 320 |
| 9/1/09 | 320 |
| 9/1/09 | 321 |
| 9/1/09 | 321 |
| 9/1/09 | 321 |
| 9/1/09 | 320 |
| 9/1/09 | 320 |
| 9/1/09 | 321 |
| 9/1/09 | 321 |
| 9/1/09 | 321 |
| 9/1/09 | 321 |
| 9/1/09 | 321 |
| 9/1/09 | 320 |
| 9/1/09 | 320 |
| 9/1/09 | 320 |
| 9/1/09 | 320 |
| 9/1/09 | 320 |
| 9/1/09 | 321 |
| 9/1/09 | 321 |
| 8/31/09 | 320 |
| 8/31/09 | 320 |
| 8/31/09 | 320 |
| 8/31/09 | 320 |
| 8/31/09 | 320 |
| 8/31/09 | 320 |
| 8/31/09 | 320 |
| 8/31/09 | 320 |
| 8/31/09 | 320 |
| 8/31/09 | 318 |
| 8/31/09 | 318 |
| 8/31/09 | 319 |
| 8/31/09 | 318 |
| 8/31/09 | 319 |
| 8/31/09 | 319 |
| 8/31/09 | 320 |
| 8/31/09 | 319 |
| 8/31/09 | 320 |
| 8/31/09 | 320 |
| 8/31/09 | 320 |
| 8/31/09 | 320 |
| 8/31/09 | 319 |
| 8/31/09 | 319 |
| 8/31/09 | 319 |
| 8/31/09 | 318 |
| 8/31/09 | 321 |
| 8/31/09 | 319 |
| 8/31/09 | 319 |
| 8/31/09 | 320 |
| 8/31/09 | 320 |
| 8/31/09 | 320 |
| 8/31/09 | 320 |
| 8/31/09 | 320 |
| 8/31/09 | 320 |
| 8/31/09 | 320 |
| 8/31/09 | 320 |
| 8/31/09 | 320 |
| 8/31/09 | 320 |
| 8/31/09 | 320 |
| 8/31/09 | 321 |
| 8/31/09 | 321 |
| 8/31/09 | 321 |
| 8/31/09 | 321 |
| 8/31/09 | 321 |
| 8/31/09 | 321 |
| 8/31/09 | 321 |
| 8/31/09 | 321 |
| 8/31/09 | 321 |
| 8/30/09 | 321 |
| 8/30/09 | 321 |
| 8/30/09 | 321 |
| 8/30/09 | 321 |
| 8/30/09 | 321 |
| 8/30/09 | 321 |
| 8/30/09 | 321 |
| 8/30/09 | 320 |
| 8/30/09 | 321 |
| 8/30/09 | 320 |
| 8/30/09 | 320 |
| 8/30/09 | 320 |
| 8/30/09 | 320 |
| 8/30/09 | 320 |
| 8/30/09 | 320 |
| 8/30/09 | 320 |
| 8/30/09 | 320 |
| 8/30/09 | 320 |
| 8/30/09 | 320 |
| 8/30/09 | 320 |
| 8/30/09 | 320 |
| 8/30/09 | 320 |
| 8/30/09 | 320 |
| 8/30/09 | 320 |
| 8/30/09 | 319 |
| 8/30/09 | 320 |
| 8/30/09 | 320 |
| 8/30/09 | 320 |
| 8/30/09 | 320 |
| 8/30/09 | 320 |
| 8/30/09 | 321 |
| 8/30/09 | 320 |
| 8/30/09 | 320 |
| 8/30/09 | 321 |
| 8/30/09 | 321 |
| 8/30/09 | 322 |
| 8/30/09 | 322 |
| 8/30/09 | 321 |
| 8/30/09 | 322 |
| 8/30/09 | 322 |
| 8/30/09 | 321 |
| 8/30/09 | 321 |
| 8/30/09 | 321 |
| 8/30/09 | 321 |
| 8/30/09 | 321 |
| 8/30/09 | 321 |
| 8/30/09 | 321 |
| 8/30/09 | 321 |
| 8/29/09 | 321 |
| 8/29/09 | 321 |
| 8/29/09 | 321 |
| 8/29/09 | 321 |
| 8/29/09 | 321 |
| 8/29/09 | 321 |
| 8/29/09 | 321 |
| 8/29/09 | 321 |
| 8/29/09 | 321 |
| 8/29/09 | 320 |
| 8/29/09 | 320 |
| 8/29/09 | 320 |
| 8/29/09 | 320 |
| 8/29/09 | 320 |
| 8/29/09 | 320 |
| 8/29/09 | 319 |
| 8/29/09 | 319 |
| 8/29/09 | 319 |
| 8/29/09 | 319 |
| 8/29/09 | 319 |
| 8/29/09 | 320 |
| 8/29/09 | 319 |
| 8/29/09 | 320 |
| 8/29/09 | 320 |
| 8/29/09 | 320 |
| 8/29/09 | 321 |
| 8/29/09 | 321 |
| 8/29/09 | 321 |
| 8/29/09 | 321 |
| 8/29/09 | 321 |
| 8/29/09 | 321 |
| 8/29/09 | 321 |
| 8/29/09 | 321 |
| 8/29/09 | 321 |
| 8/29/09 | 322 |
| 8/29/09 | 322 |
| 8/29/09 | 322 |
| 8/29/09 | 322 |
| 8/29/09 | 322 |
| 8/29/09 | 321 |
| 8/29/09 | 321 |
| 8/29/09 | 321 |
| 8/29/09 | 321 |
| 8/29/09 | 321 |
| 8/29/09 | 321 |
| 8/29/09 | 321 |
| 8/29/09 | 321 |
| 8/29/09 | 321 |
| 8/28/09 | 321 |
| 8/28/09 | 321 |
| 8/28/09 | 320 |
| 8/28/09 | 321 |
| 8/28/09 | 321 |
| 8/28/09 | 321 |
| 8/28/09 | 321 |
| 8/28/09 | 320 |
| 8/28/09 | 320 |
| 8/28/09 | 320 |
| 8/28/09 | 320 |
| 8/28/09 | 321 |
| 8/28/09 | 320 |
| 8/28/09 | 321 |
| 8/28/09 | 321 |
| 8/28/09 | 321 |
| 8/28/09 | 320 |
| 8/28/09 | 320 |
| 8/28/09 | 318 |
| 8/28/09 | 320 |
| 8/28/09 | 320 |
| 8/28/09 | 320 |
| 8/28/09 | 324 |
| 8/28/09 | 323 |
| 8/28/09 | 323 |
| 8/28/09 | 323 |
| 8/28/09 | 322 |
| 8/28/09 | 323 |
| 8/28/09 | 323 |
| 8/28/09 | 324 |
| 8/28/09 | 324 |
| 8/28/09 | 324 |
| 8/28/09 | 324 |
| 8/28/09 | 324 |
| 8/28/09 | 323 |
| 8/28/09 | 323 |
| 8/28/09 | 324 |
| 8/28/09 | 324 |
| 8/28/09 | 323 |
| 8/28/09 | 323 |
| 8/28/09 | 324 |
| 8/28/09 | 324 |
| 8/28/09 | 322 |
| 8/28/09 | 324 |
| 8/28/09 | 324 |
| 8/28/09 | 324 |
| 8/28/09 | 324 |
| 8/28/09 | 323 |
| 8/27/09 | 323 |
| 8/27/09 | 323 |
| 8/27/09 | 322 |
| 8/27/09 | 322 |
| 8/27/09 | 322 |
| 8/27/09 | 322 |
| 8/27/09 | 321 |
| 8/27/09 | 321 |
| 8/27/09 | 321 |
| 8/27/09 | 321 |
| 8/27/09 | 322 |
| 8/27/09 | 323 |
| 8/27/09 | 324 |
| 8/27/09 | 323 |
| 8/27/09 | 323 |
| 8/27/09 | 323 |
| 8/27/09 | 324 |
| 8/27/09 | 324 |
| 8/27/09 | 324 |
| 8/27/09 | 324 |
| 8/27/09 | 324 |
| 8/27/09 | 325 |
| 8/27/09 | 325 |
| 8/27/09 | 325 |
| 8/27/09 | 325 |
| 8/27/09 | 324 |
| 8/27/09 | 324 |
| 8/27/09 | 318 |
| 8/27/09 | 325 |
| 8/27/09 | 325 |
| 8/27/09 | 324 |
| 8/27/09 | 324 |
| 8/27/09 | 324 |
| 8/27/09 | 323 |
| 8/27/09 | 322 |
| 8/27/09 | 323 |
| 8/27/09 | 324 |
| 8/27/09 | 324 |
| 8/27/09 | 323 |
| 8/27/09 | 323 |
| 8/27/09 | 323 |
| 8/27/09 | 323 |
| 8/27/09 | 323 |
| 8/27/09 | 323 |
| 8/27/09 | 323 |
| 8/27/09 | 323 |
| 8/27/09 | 323 |
| 8/27/09 | 323 |
| 8/26/09 | 322 |
| 8/26/09 | 323 |
| 8/26/09 | 322 |
| 8/26/09 | 322 |
| 8/26/09 | 322 |
| 8/26/09 | 322 |
| 8/26/09 | 322 |
| 8/26/09 | 321 |
| 8/26/09 | 321 |
| 8/26/09 | 321 |
| 8/26/09 | 322 |
| 8/26/09 | 322 |
| 8/26/09 | 322 |
| 8/26/09 | 324 |
| 8/26/09 | 323 |
| 8/26/09 | 324 |
| 8/26/09 | 324 |
| 8/26/09 | 324 |
| 8/26/09 | 323 |
| 8/26/09 | 323 |
| 8/26/09 | 322 |
| 8/26/09 | 323 |
| 8/26/09 | 322 |
| 8/26/09 | 323 |
| 8/26/09 | 323 |
| 8/26/09 | 324 |
| 8/26/09 | 323 |
| 8/26/09 | 323 |
| 8/26/09 | 323 |
| 8/26/09 | 322 |
| 8/26/09 | 323 |
| 8/26/09 | 322 |
| 8/26/09 | 323 |
| 8/26/09 | 323 |
| 8/26/09 | 323 |
| 8/26/09 | 323 |
| 8/26/09 | 323 |
| 8/26/09 | 323 |
| 8/26/09 | 323 |
| 8/26/09 | 322 |
| 8/26/09 | 322 |
| 8/26/09 | 322 |
| 8/26/09 | 322 |
| 8/26/09 | 323 |
| 8/26/09 | 323 |
| 8/26/09 | 324 |
| 8/26/09 | 323 |
| 8/26/09 | 323 |
| 8/25/09 | 323 |
| 8/25/09 | 323 |
| 8/25/09 | 323 |
| 8/25/09 | 323 |
| 8/25/09 | 323 |
| 8/25/09 | 323 |
| 8/25/09 | 322 |
| 8/25/09 | 322 |
| 8/25/09 | 322 |
| 8/25/09 | 324 |
| 8/25/09 | 324 |
| 8/25/09 | 322 |
| 8/25/09 | 323 |
| 8/25/09 | 323 |
| 8/25/09 | 322 |
| 8/25/09 | 322 |
| 8/25/09 | 322 |
| 8/25/09 | 324 |
| 8/25/09 | 324 |
| 8/25/09 | 324 |
| 8/25/09 | 324 |
| 8/25/09 | 324 |
| 8/25/09 | 324 |
| 8/25/09 | 324 |
| 8/25/09 | 324 |
| 8/25/09 | 324 |
| 8/25/09 | 324 |
| 8/25/09 | 323 |
| 8/25/09 | 323 |
| 8/25/09 | 322 |
| 8/25/09 | 323 |
| 8/25/09 | 323 |
| 8/25/09 | 323 |
| 8/25/09 | 323 |
| 8/25/09 | 323 |
| 8/25/09 | 323 |
| 8/25/09 | 322 |
| 8/25/09 | 322 |
| 8/25/09 | 322 |
| 8/25/09 | 322 |
| 8/25/09 | 322 |
| 8/25/09 | 322 |
| 8/25/09 | 322 |
| 8/25/09 | 322 |
| 8/25/09 | 322 |
| 8/25/09 | 322 |
| 8/25/09 | 322 |
| 8/25/09 | 322 |
| 8/24/09 | 322 |
| 8/24/09 | 321 |
| 8/24/09 | 322 |
| 8/24/09 | 322 |
| 8/24/09 | 322 |
| 8/24/09 | 321 |
| 8/24/09 | 321 |
| 8/24/09 | 322 |
| 8/24/09 | 322 |
| 8/24/09 | 322 |
| 8/24/09 | 323 |
| 8/24/09 | 323 |
| 8/24/09 | 323 |
| 8/24/09 | 323 |
| 8/24/09 | 323 |
| 8/24/09 | 323 |
| 8/24/09 | 322 |
| 8/24/09 | 323 |
| 8/24/09 | 322 |
| 8/24/09 | 323 |
| 8/24/09 | 322 |
| 8/24/09 | 322 |
| 8/24/09 | 323 |
| 8/24/09 | 323 |
| 8/24/09 | 324 |
| 8/24/09 | 323 |
| 8/24/09 | 323 |
| 8/24/09 | 321 |
| 8/24/09 | 323 |
| 8/24/09 | 323 |
| 8/24/09 | 323 |
| 8/24/09 | 323 |
| 8/24/09 | 323 |
| 8/24/09 | 323 |
| 8/24/09 | 323 |
| 8/24/09 | 323 |
| 8/24/09 | 323 |
| 8/24/09 | 323 |
| 8/24/09 | 323 |
| 8/24/09 | 323 |
| 8/24/09 | 323 |
| 8/24/09 | 323 |
| 8/24/09 | 322 |
| 8/24/09 | 323 |
| 8/24/09 | 323 |
| 8/24/09 | 322 |
| 8/24/09 | 322 |
| 8/24/09 | 322 |
| 8/23/09 | 322 |
| 8/23/09 | 322 |
| 8/23/09 | 322 |
| 8/23/09 | 322 |
| 8/23/09 | 322 |
| 8/23/09 | 322 |
| 8/23/09 | 321 |
| 8/23/09 | 322 |
| 8/23/09 | 322 |
| 8/23/09 | 322 |
| 8/23/09 | 323 |
| 8/23/09 | 323 |
| 8/23/09 | 323 |
| 8/23/09 | 322 |
| 8/23/09 | 323 |
| 8/23/09 | 323 |
| 8/23/09 | 322 |
| 8/23/09 | 322 |
| 8/23/09 | 323 |
| 8/23/09 | 323 |
| 8/23/09 | 323 |
| 8/23/09 | 323 |
| 8/23/09 | 323 |
| 8/23/09 | 323 |
| 8/23/09 | 324 |
| 8/23/09 | 323 |
| 8/23/09 | 323 |
| 8/23/09 | 323 |
| 8/23/09 | 323 |
| 8/23/09 | 323 |
| 8/23/09 | 323 |
| 8/23/09 | 323 |
| 8/23/09 | 323 |
| 8/23/09 | 323 |
| 8/23/09 | 323 |
| 8/23/09 | 323 |
| 8/23/09 | 323 |
| 8/23/09 | 324 |
| 8/23/09 | 323 |
| 8/23/09 | 323 |
| 8/23/09 | 323 |
| 8/23/09 | 322 |
| 8/23/09 | 323 |
| 8/23/09 | 322 |
| 8/23/09 | 323 |
| 8/23/09 | 323 |
| 8/23/09 | 323 |
| 8/23/09 | 321 |
| 8/22/09 | 322 |
| 8/22/09 | 321 |
| 8/22/09 | 321 |
| 8/22/09 | 321 |
| 8/22/09 | 322 |
| 8/22/09 | 322 |
| 8/22/09 | 321 |
| 8/22/09 | 321 |
| 8/22/09 | 322 |
| 8/22/09 | 322 |
| 8/22/09 | 324 |
| 8/22/09 | 324 |
| 8/22/09 | 324 |
| 8/22/09 | 323 |
| 8/22/09 | 323 |
| 8/22/09 | 323 |
| 8/22/09 | 321 |
| 8/22/09 | 323 |
| 8/22/09 | 323 |
| 8/22/09 | 323 |
| 8/22/09 | 323 |
| 8/22/09 | 323 |
| 8/22/09 | 323 |
| 8/22/09 | 323 |
| 8/22/09 | 323 |
| 8/22/09 | 323 |
| 8/22/09 | 323 |
| 8/22/09 | 323 |
| 8/22/09 | 323 |
| 8/22/09 | 323 |
| 8/22/09 | 322 |
| 8/22/09 | 321 |
| 8/22/09 | 322 |
| 8/22/09 | 323 |
| 8/22/09 | 323 |
| 8/22/09 | 323 |
| 8/22/09 | 323 |
| 8/22/09 | 323 |
| 8/22/09 | 322 |
| 8/22/09 | 322 |
| 8/22/09 | 322 |
| 8/22/09 | 322 |
| 8/22/09 | 322 |
| 8/22/09 | 322 |
| 8/22/09 | 322 |
| 8/22/09 | 322 |
| 8/22/09 | 322 |
| 8/22/09 | 321 |
| 8/21/09 | 322 |
| 8/21/09 | 321 |
| 8/21/09 | 321 |
| 8/21/09 | 322 |
| 8/21/09 | 324 |
| 8/21/09 | 324 |
| 8/21/09 | 325 |
| 8/21/09 | 324 |
| 8/21/09 | 323 |
| 8/21/09 | 323 |
| 8/21/09 | 322 |
| 8/21/09 | 323 |
| 8/21/09 | 321 |
| 8/21/09 | 321 |
| 8/21/09 | 321 |
| 8/21/09 | 322 |
| 8/21/09 | 322 |
| 8/21/09 | 322 |
| 8/21/09 | 322 |
| 8/21/09 | 322 |
| 8/21/09 | 322 |
| 8/21/09 | 322 |
| 8/21/09 | 322 |
| 8/21/09 | 322 |
| 8/21/09 | 324 |
| 8/21/09 | 325 |
| 8/21/09 | 324 |
| 8/21/09 | 317 |
| 8/21/09 | 324 |
| 8/21/09 | 324 |
| 8/21/09 | 318 |
| 8/21/09 | 323 |
| 8/21/09 | 323 |
| 8/21/09 | 324 |
| 8/21/09 | 323 |
| 8/21/09 | 323 |
| 8/21/09 | 323 |
| 8/21/09 | 323 |
| 8/21/09 | 322 |
| 8/21/09 | 322 |
| 8/21/09 | 322 |
| 8/21/09 | 322 |
| 8/21/09 | 322 |
| 8/21/09 | 322 |
| 8/21/09 | 322 |
| 8/21/09 | 322 |
| 8/21/09 | 324 |
| 8/21/09 | 323 |
| 8/20/09 | 323 |
| 8/20/09 | 323 |
| 8/20/09 | 322 |
| 8/20/09 | 321 |
| 8/20/09 | 323 |
| 8/20/09 | 323 |
| 8/20/09 | 323 |
| 8/20/09 | 323 |
| 8/20/09 | 323 |
| 8/20/09 | 324 |
| 8/20/09 | 324 |
| 8/20/09 | 324 |
| 8/20/09 | 322 |
| 8/20/09 | 322 |
| 8/20/09 | 322 |
| 8/20/09 | 320 |
| 8/20/09 | 323 |
| 8/20/09 | 323 |
| 8/20/09 | 324 |
| 8/20/09 | 324 |
| 8/20/09 | 324 |
| 8/20/09 | 323 |
| 8/20/09 | 324 |
| 8/20/09 | 323 |
| 8/20/09 | 323 |
| 8/20/09 | 323 |
| 8/20/09 | 324 |
| 8/20/09 | 324 |
| 8/20/09 | 324 |
| 8/20/09 | 324 |
| 8/20/09 | 324 |
| 8/20/09 | 324 |
| 8/20/09 | 322 |
| 8/20/09 | 324 |
| 8/20/09 | 324 |
| 8/20/09 | 324 |
| 8/20/09 | 324 |
| 8/20/09 | 324 |
| 8/20/09 | 323 |
| 8/20/09 | 323 |
| 8/20/09 | 323 |
| 8/20/09 | 323 |
| 8/20/09 | 322 |
| 8/20/09 | 322 |
| 8/20/09 | 323 |
| 8/20/09 | 322 |
| 8/20/09 | 322 |
| 8/20/09 | 322 |
| 8/19/09 | 322 |
| 8/19/09 | 322 |
| 8/19/09 | 321 |
| 8/19/09 | 321 |
| 8/19/09 | 321 |
| 8/19/09 | 320 |
| 8/19/09 | 320 |
| 8/19/09 | 321 |
| 8/19/09 | 322 |
| 8/19/09 | 322 |
| 8/19/09 | 322 |
| 8/19/09 | 322 |
| 8/19/09 | 323 |
| 8/19/09 | 322 |
| 8/19/09 | 323 |
| 8/19/09 | 323 |
| 8/19/09 | 322 |
| 8/19/09 | 321 |
| 8/19/09 | 323 |
| 8/19/09 | 323 |
| 8/19/09 | 323 |
| 8/19/09 | 323 |
| 8/19/09 | 323 |
| 8/19/09 | 323 |
| 8/19/09 | 323 |
| 8/19/09 | 323 |
| 8/19/09 | 323 |
| 8/19/09 | 323 |
| 8/19/09 | 322 |
| 8/19/09 | 322 |
| 8/19/09 | 323 |
| 8/19/09 | 323 |
| 8/19/09 | 323 |
| 8/19/09 | 322 |
| 8/19/09 | 323 |
| 8/19/09 | 322 |
| 8/19/09 | 322 |
| 8/19/09 | 322 |
| 8/19/09 | 321 |
| 8/19/09 | 322 |
| 8/19/09 | 322 |
| 8/19/09 | 321 |
| 8/19/09 | 321 |
| 8/19/09 | 322 |
| 8/19/09 | 321 |
| 8/19/09 | 322 |
| 8/19/09 | 322 |
| 8/19/09 | 321 |
| 8/18/09 | 321 |
| 8/18/09 | 322 |
| 8/18/09 | 321 |
| 8/18/09 | 321 |
| 8/18/09 | 320 |
| 8/18/09 | 320 |
| 8/18/09 | 322 |
| 8/18/09 | 324 |
| 8/18/09 | 323 |
| 8/18/09 | 323 |
| 8/18/09 | 323 |
| 8/18/09 | 322 |
| 8/18/09 | 323 |
| 8/18/09 | 324 |
| 8/18/09 | 323 |
| 8/18/09 | 322 |
| 8/18/09 | 322 |
| 8/18/09 | 322 |
| 8/18/09 | 320 |
| 8/18/09 | 320 |
| 8/18/09 | 320 |
| 8/18/09 | 320 |
| 8/18/09 | 320 |
| 8/18/09 | 320 |
| 8/18/09 | 320 |
| 8/18/09 | 320 |
| 8/18/09 | 320 |
| 8/18/09 | 320 |
| 8/18/09 | 320 |
| 8/18/09 | 320 |
| 8/18/09 | 319 |
| 8/18/09 | 319 |
| 8/18/09 | 320 |
| 8/18/09 | 320 |
| 8/18/09 | 321 |
| 8/18/09 | 321 |
| 8/18/09 | 321 |
| 8/18/09 | 320 |
| 8/18/09 | 320 |
| 8/18/09 | 320 |
| 8/18/09 | 319 |
| 8/18/09 | 320 |
| 8/18/09 | 320 |
| 8/18/09 | 321 |
| 8/18/09 | 321 |
| 8/18/09 | 320 |
| 8/18/09 | 321 |
| 8/18/09 | 319 |
| 8/17/09 | 320 |
| 8/17/09 | 319 |
| 8/17/09 | 319 |
| 8/17/09 | 318 |
| 8/17/09 | 320 |
| 8/17/09 | 321 |
| 8/17/09 | 321 |
| 8/17/09 | 320 |
| 8/17/09 | 320 |
| 8/17/09 | 320 |
| 8/17/09 | 320 |
| 8/17/09 | 320 |
| 8/17/09 | 320 |
| 8/17/09 | 321 |
| 8/17/09 | 321 |
| 8/17/09 | 322 |
| 8/17/09 | 323 |
| 8/17/09 | 322 |
| 8/17/09 | 322 |
| 8/17/09 | 322 |
| 8/17/09 | 321 |
| 8/17/09 | 322 |
| 8/17/09 | 321 |
| 8/17/09 | 322 |
| 8/17/09 | 322 |
| 8/17/09 | 321 |
| 8/17/09 | 322 |
| 8/17/09 | 321 |
| 8/17/09 | 320 |
| 8/17/09 | 321 |
| 8/17/09 | 321 |
| 8/17/09 | 321 |
| 8/17/09 | 321 |
| 8/17/09 | 321 |
| 8/17/09 | 321 |
| 8/17/09 | 322 |
| 8/17/09 | 321 |
| 8/17/09 | 321 |
| 8/17/09 | 320 |
| 8/17/09 | 320 |
| 8/17/09 | 320 |
| 8/17/09 | 320 |
| 8/17/09 | 320 |
| 8/17/09 | 320 |
| 8/17/09 | 320 |
| 8/17/09 | 321 |
| 8/17/09 | 321 |
| 8/17/09 | 320 |
| 8/16/09 | 321 |
| 8/16/09 | 320 |
| 8/16/09 | 321 |
| 8/16/09 | 322 |
| 8/16/09 | 322 |
| 8/16/09 | 322 |
| 8/16/09 | 322 |
| 8/16/09 | 320 |
| 8/16/09 | 321 |
| 8/16/09 | 321 |
| 8/16/09 | 321 |
| 8/16/09 | 321 |
| 8/16/09 | 321 |
| 8/16/09 | 320 |
| 8/16/09 | 320 |
| 8/16/09 | 323 |
| 8/16/09 | 322 |
| 8/16/09 | 323 |
| 8/16/09 | 322 |
| 8/16/09 | 322 |
| 8/16/09 | 323 |
| 8/16/09 | 323 |
| 8/16/09 | 323 |
| 8/16/09 | 323 |
| 8/16/09 | 323 |
| 8/16/09 | 324 |
| 8/16/09 | 323 |
| 8/16/09 | 323 |
| 8/16/09 | 323 |
| 8/16/09 | 322 |
| 8/16/09 | 322 |
| 8/16/09 | 325 |
| 8/16/09 | 322 |
| 8/16/09 | 323 |
| 8/16/09 | 323 |
| 8/16/09 | 322 |
| 8/16/09 | 322 |
| 8/16/09 | 322 |
| 8/16/09 | 324 |
| 8/16/09 | 323 |
| 8/16/09 | 323 |
| 8/16/09 | 323 |
| 8/16/09 | 322 |
| 8/16/09 | 323 |
| 8/16/09 | 323 |
| 8/16/09 | 323 |
| 8/16/09 | 322 |
| 8/16/09 | 322 |
| 8/15/09 | 323 |
| 8/15/09 | 323 |
| 8/15/09 | 323 |
| 8/15/09 | 322 |
| 8/15/09 | 322 |
| 8/15/09 | 324 |
| 8/15/09 | 323 |
| 8/15/09 | 324 |
| 8/15/09 | 324 |
| 8/15/09 | 323 |
| 8/15/09 | 324 |
| 8/15/09 | 324 |
| 8/15/09 | 325 |
| 8/15/09 | 325 |
| 8/15/09 | 324 |
| 8/15/09 | 324 |
| 8/15/09 | 325 |
| 8/15/09 | 324 |
| 8/15/09 | 324 |
| 8/15/09 | 324 |
| 8/15/09 | 326 |
| 8/15/09 | 324 |
| 8/15/09 | 324 |
| 8/15/09 | 324 |
| 8/15/09 | 324 |
| 8/15/09 | 324 |
| 8/15/09 | 324 |
| 8/15/09 | 324 |
| 8/15/09 | 323 |
| 8/15/09 | 324 |
| 8/15/09 | 323 |
| 8/15/09 | 323 |
| 8/15/09 | 322 |
| 8/15/09 | 322 |
| 8/15/09 | 322 |
| 8/15/09 | 322 |
| 8/15/09 | 323 |
| 8/15/09 | 322 |
| 8/15/09 | 324 |
| 8/15/09 | 326 |
| 8/15/09 | 325 |
| 8/15/09 | 324 |
| 8/15/09 | 325 |
| 8/15/09 | 325 |
| 8/15/09 | 324 |
| 8/15/09 | 325 |
| 8/15/09 | 325 |
| 8/15/09 | 325 |
| 8/14/09 | 326 |
| 8/14/09 | 325 |
| 8/14/09 | 325 |
| 8/14/09 | 325 |
| 8/14/09 | 326 |
| 8/14/09 | 325 |
| 8/14/09 | 325 |
| 8/14/09 | 325 |
| 8/14/09 | 324 |
| 8/14/09 | 322 |
| 8/14/09 | 324 |
| 8/14/09 | 324 |
| 8/14/09 | 313 |
| 8/14/09 | 324 |
| 8/14/09 | 325 |
| 8/14/09 | 322 |
| 8/14/09 | 323 |
| 8/14/09 | 324 |
| 8/14/09 | 324 |
| 8/14/09 | 324 |
| 8/14/09 | 323 |
| 8/14/09 | 324 |
| 8/14/09 | 325 |
| 8/14/09 | 324 |
| 8/14/09 | 324 |
| 8/14/09 | 325 |
| 8/14/09 | 325 |
| 8/14/09 | 325 |
| 8/14/09 | 324 |
| 8/14/09 | 324 |
| 8/14/09 | 323 |
| 8/14/09 | 324 |
| 8/14/09 | 324 |
| 8/14/09 | 323 |
| 8/14/09 | 323 |
| 8/14/09 | 323 |
| 8/14/09 | 324 |
| 8/14/09 | 324 |
| 8/14/09 | 323 |
| 8/14/09 | 324 |
| 8/14/09 | 324 |
| 8/14/09 | 323 |
| 8/14/09 | 324 |
| 8/14/09 | 323 |
| 8/14/09 | 324 |
| 8/14/09 | 323 |
| 8/14/09 | 323 |
| 8/14/09 | 323 |
| 8/13/09 | 323 |
| 8/13/09 | 323 |
| 8/13/09 | 322 |
| 8/13/09 | 322 |
| 8/13/09 | 322 |
| 8/13/09 | 323 |
| 8/13/09 | 323 |
| 8/13/09 | 324 |
| 8/13/09 | 324 |
| 8/13/09 | 325 |
| 8/13/09 | 325 |
| 8/13/09 | 324 |
| 8/13/09 | 324 |
| 8/13/09 | 324 |
| 8/13/09 | 323 |
| 8/13/09 | 324 |
| 8/13/09 | 324 |
| 8/13/09 | 324 |
| 8/13/09 | 324 |
| 8/13/09 | 324 |
| 8/13/09 | 324 |
| 8/13/09 | 324 |
| 8/13/09 | 323 |
| 8/13/09 | 323 |
| 8/13/09 | 323 |
| 8/13/09 | 324 |
| 8/13/09 | 324 |
| 8/13/09 | 325 |
| 8/13/09 | 325 |
| 8/13/09 | 325 |
| 8/13/09 | 324 |
| 8/13/09 | 324 |
| 8/13/09 | 324 |
| 8/13/09 | 324 |
| 8/13/09 | 324 |
| 8/13/09 | 323 |
| 8/13/09 | 323 |
| 8/13/09 | 323 |
| 8/13/09 | 322 |
| 8/13/09 | 322 |
| 8/13/09 | 322 |
| 8/13/09 | 322 |
| 8/13/09 | 322 |
| 8/13/09 | 322 |
| 8/13/09 | 322 |
| 8/13/09 | 322 |
| 8/13/09 | 321 |
| 8/13/09 | 322 |
| 8/12/09 | 322 |
| 8/12/09 | 322 |
| 8/12/09 | 322 |
| 8/12/09 | 323 |
| 8/12/09 | 323 |
| 8/12/09 | 322 |
| 8/12/09 | 322 |
| 8/12/09 | 323 |
| 8/12/09 | 323 |
| 8/12/09 | 323 |
| 8/12/09 | 322 |
| 8/12/09 | 322 |
| 8/12/09 | 322 |
| 8/12/09 | 322 |
| 8/12/09 | 322 |
| 8/12/09 | 321 |
| 8/12/09 | 322 |
| 8/12/09 | 322 |
| 8/12/09 | 324 |
| 8/12/09 | 324 |
| 8/12/09 | 324 |
| 8/12/09 | 324 |
| 8/12/09 | 324 |
| 8/12/09 | 324 |
| 8/12/09 | 323 |
| 8/12/09 | 323 |
| 8/12/09 | 323 |
| 8/12/09 | 322 |
| 8/12/09 | 322 |
| 8/12/09 | 322 |
| 8/12/09 | 322 |
| 8/12/09 | 321 |
| 8/12/09 | 321 |
| 8/12/09 | 321 |
| 8/12/09 | 321 |
| 8/12/09 | 321 |
| 8/12/09 | 321 |
| 8/12/09 | 321 |
| 8/12/09 | 320 |
| 8/12/09 | 320 |
| 8/12/09 | 320 |
| 8/12/09 | 321 |
| 8/12/09 | 321 |
| 8/12/09 | 320 |
| 8/12/09 | 320 |
| 8/12/09 | 320 |
| 8/12/09 | 320 |
| 8/12/09 | 320 |
| 8/11/09 | 319 |
| 8/11/09 | 320 |
| 8/11/09 | 320 |
| 8/11/09 | 320 |
| 8/11/09 | 320 |
| 8/11/09 | 322 |
| 8/11/09 | 321 |
| 8/11/09 | 320 |
| 8/11/09 | 319 |
| 8/11/09 | 319 |
| 8/11/09 | 322 |
| 8/11/09 | 322 |
| 8/11/09 | 322 |
| 8/11/09 | 322 |
| 8/11/09 | 323 |
| 8/11/09 | 323 |
| 8/11/09 | 323 |
| 8/11/09 | 322 |
| 8/11/09 | 323 |
| 8/11/09 | 323 |
| 8/11/09 | 323 |
| 8/11/09 | 323 |
| 8/11/09 | 322 |
| 8/11/09 | 322 |
| 8/11/09 | 322 |
| 8/11/09 | 322 |
| 8/11/09 | 322 |
| 8/11/09 | 324 |
| 8/11/09 | 323 |
| 8/11/09 | 322 |
| 8/11/09 | 322 |
| 8/11/09 | 322 |
| 8/11/09 | 322 |
| 8/11/09 | 322 |
| 8/11/09 | 321 |
| 8/11/09 | 321 |
| 8/11/09 | 321 |
| 8/11/09 | 321 |
| 8/11/09 | 321 |
| 8/11/09 | 321 |
| 8/11/09 | 321 |
| 8/11/09 | 321 |
| 8/11/09 | 321 |
| 8/11/09 | 322 |
| 8/11/09 | 322 |
| 8/11/09 | 322 |
| 8/11/09 | 322 |
| 8/11/09 | 321 |
| 8/10/09 | 322 |
| 8/10/09 | 322 |
| 8/10/09 | 323 |
| 8/10/09 | 323 |
| 8/10/09 | 322 |
| 8/10/09 | 323 |
| 8/10/09 | 323 |
| 8/10/09 | 323 |
| 8/10/09 | 323 |
| 8/10/09 | 323 |
| 8/10/09 | 323 |
| 8/10/09 | 325 |
| 8/10/09 | 323 |
| 8/10/09 | 324 |
| 8/10/09 | 324 |
| 8/10/09 | 324 |
| 8/10/09 | 324 |
| 8/10/09 | 324 |
| 8/10/09 | 325 |
| 8/10/09 | 325 |
| 8/10/09 | 325 |
| 8/10/09 | 325 |
| 8/10/09 | 324 |
| 8/10/09 | 324 |
| 8/10/09 | 324 |
| 8/10/09 | 324 |
| 8/10/09 | 324 |
| 8/10/09 | 324 |
| 8/10/09 | 324 |
| 8/10/09 | 325 |
| 8/10/09 | 324 |
| 8/10/09 | 324 |
| 8/10/09 | 324 |
| 8/10/09 | 324 |
| 8/10/09 | 324 |
| 8/10/09 | 324 |
| 8/10/09 | 323 |
| 8/10/09 | 323 |
| 8/10/09 | 323 |
| 8/10/09 | 323 |
| 8/10/09 | 323 |
| 8/10/09 | 323 |
| 8/10/09 | 323 |
| 8/10/09 | 323 |
| 8/10/09 | 324 |
| 8/10/09 | 324 |
| 8/10/09 | 324 |
| 8/10/09 | 323 |
| 8/9/09 | 324 |
| 8/9/09 | 323 |
| 8/9/09 | 323 |
| 8/9/09 | 323 |
| 8/9/09 | 323 |
| 8/9/09 | 322 |
| 8/9/09 | 323 |
| 8/9/09 | 323 |
| 8/9/09 | 323 |
| 8/9/09 | 323 |
| 8/9/09 | 324 |
| 8/9/09 | 324 |
| 8/9/09 | 324 |
| 8/9/09 | 324 |
| 8/9/09 | 325 |
| 8/9/09 | 324 |
| 8/9/09 | 324 |
| 8/9/09 | 324 |
| 8/9/09 | 324 |
| 8/9/09 | 324 |
| 8/9/09 | 323 |
| 8/9/09 | 323 |
| 8/9/09 | 323 |
| 8/9/09 | 324 |
| 8/9/09 | 324 |
| 8/9/09 | 324 |
| 8/9/09 | 323 |
| 8/9/09 | 324 |
| 8/9/09 | 324 |
| 8/9/09 | 324 |
| 8/9/09 | 324 |
| 8/9/09 | 323 |
| 8/9/09 | 323 |
| 8/9/09 | 323 |
| 8/9/09 | 323 |
| 8/9/09 | 323 |
| 8/9/09 | 323 |
| 8/9/09 | 323 |
| 8/9/09 | 323 |
| 8/9/09 | 323 |
| 8/9/09 | 323 |
| 8/9/09 | 323 |
| 8/9/09 | 323 |
| 8/9/09 | 323 |
| 8/9/09 | 323 |
| 8/9/09 | 323 |
| 8/9/09 | 323 |
| 8/9/09 | 323 |
| 8/8/09 | 323 |
| 8/8/09 | 323 |
| 8/8/09 | 323 |
| 8/8/09 | 323 |
| 8/8/09 | 322 |
| 8/8/09 | 322 |
| 8/8/09 | 322 |
| 8/8/09 | 322 |
| 8/8/09 | 322 |
| 8/8/09 | 322 |
| 8/8/09 | 322 |
| 8/8/09 | 322 |
| 8/8/09 | 322 |
| 8/8/09 | 322 |
| 8/8/09 | 321 |
| 8/8/09 | 321 |
| 8/8/09 | 322 |
| 8/8/09 | 322 |
| 8/8/09 | 322 |
| 8/8/09 | 322 |
| 8/8/09 | 322 |
| 8/8/09 | 323 |
| 8/8/09 | 323 |
| 8/8/09 | 324 |
| 8/8/09 | 324 |
| 8/8/09 | 324 |
| 8/8/09 | 324 |
| 8/8/09 | 324 |
| 8/8/09 | 323 |
| 8/8/09 | 323 |
| 8/8/09 | 323 |
| 8/8/09 | 323 |
| 8/8/09 | 323 |
| 8/8/09 | 323 |
| 8/8/09 | 323 |
| 8/8/09 | 323 |
| 8/8/09 | 323 |
| 8/8/09 | 323 |
| 8/8/09 | 323 |
| 8/8/09 | 323 |
| 8/8/09 | 323 |
| 8/8/09 | 323 |
| 8/8/09 | 323 |
| 8/8/09 | 323 |
| 8/8/09 | 323 |
| 8/8/09 | 323 |
| 8/8/09 | 323 |
| 8/8/09 | 323 |
| 8/7/09 | 323 |
| 8/7/09 | 323 |
| 8/7/09 | 322 |
| 8/7/09 | 323 |
| 8/7/09 | 323 |
| 8/7/09 | 322 |
| 8/7/09 | 322 |
| 8/7/09 | 322 |
| 8/7/09 | 322 |
| 8/7/09 | 321 |
| 8/7/09 | 321 |
| 8/7/09 | 321 |
| 8/7/09 | 321 |
| 8/7/09 | 322 |
| 8/7/09 | 322 |
| 8/7/09 | 322 |
| 8/7/09 | 323 |
| 8/7/09 | 323 |
| 8/7/09 | 323 |
| 8/7/09 | 323 |
| 8/7/09 | 323 |
| 8/7/09 | 324 |
| 8/7/09 | 323 |
| 8/7/09 | 323 |
| 8/7/09 | 327 |
| 8/7/09 | 327 |
| 8/7/09 | 327 |
| 8/7/09 | 327 |
| 8/7/09 | 327 |
| 8/7/09 | 326 |
| 8/7/09 | 327 |
| 8/7/09 | 326 |
| 8/7/09 | 326 |
| 8/7/09 | 326 |
| 8/7/09 | 326 |
| 8/7/09 | 326 |
| 8/7/09 | 326 |
| 8/7/09 | 325 |
| 8/7/09 | 325 |
| 8/7/09 | 325 |
| 8/7/09 | 325 |
| 8/7/09 | 325 |
| 8/7/09 | 325 |
| 8/7/09 | 325 |
| 8/7/09 | 325 |
| 8/7/09 | 325 |
| 8/6/09 | 325 |
| 8/6/09 | 325 |
| 8/6/09 | 325 |
| 8/6/09 | 325 |
| 8/6/09 | 325 |
| 8/6/09 | 325 |
| 8/6/09 | 325 |
| 8/6/09 | 325 |
| 8/6/09 | 325 |
| 8/6/09 | 325 |
| 8/6/09 | 326 |
| 8/6/09 | 325 |
| 8/6/09 | 326 |
| 8/6/09 | 326 |
| 8/6/09 | 326 |
| 8/6/09 | 326 |
| 8/6/09 | 326 |
| 8/6/09 | 326 |
| 8/6/09 | 326 |
| 8/6/09 | 327 |
| 8/6/09 | 327 |
| 8/6/09 | 326 |
| 8/6/09 | 326 |
| 8/6/09 | 325 |
| 8/6/09 | 326 |
| 8/6/09 | 324 |
| 8/6/09 | 327 |
| 8/6/09 | 326 |
| 8/6/09 | 326 |
| 8/6/09 | 326 |
| 8/6/09 | 326 |
| 8/6/09 | 326 |
| 8/6/09 | 326 |
| 8/6/09 | 326 |
| 8/6/09 | 326 |
| 8/6/09 | 326 |
| 8/6/09 | 326 |
| 8/6/09 | 326 |
| 8/6/09 | 326 |
| 8/6/09 | 325 |
| 8/6/09 | 326 |
| 8/6/09 | 326 |
| 8/6/09 | 325 |
| 8/6/09 | 325 |
| 8/6/09 | 325 |
| 8/6/09 | 325 |
| 8/6/09 | 325 |
| 8/6/09 | 325 |
| 8/5/09 | 325 |
| 8/5/09 | 325 |
| 8/5/09 | 325 |
| 8/5/09 | 325 |
| 8/5/09 | 324 |
| 8/5/09 | 325 |
| 8/5/09 | 324 |
| 8/5/09 | 324 |
| 8/5/09 | 322 |
| 8/5/09 | 325 |
| 8/5/09 | 325 |
| 8/5/09 | 324 |
| 8/5/09 | 323 |
| 8/5/09 | 325 |
| 8/5/09 | 324 |
| 8/5/09 | 324 |
| 8/5/09 | 326 |
| 8/5/09 | 326 |
| 8/5/09 | 326 |
| 8/5/09 | 326 |
| 8/5/09 | 326 |
| 8/5/09 | 326 |
| 8/5/09 | 326 |
| 8/5/09 | 326 |
| 8/5/09 | 325 |
| 8/5/09 | 325 |
| 8/5/09 | 325 |
| 8/5/09 | 321 |
| 8/5/09 | 325 |
| 8/5/09 | 325 |
| 8/5/09 | 325 |
| 8/5/09 | 325 |
| 8/5/09 | 317 |
| 8/5/09 | 325 |
| 8/5/09 | 325 |
| 8/5/09 | 325 |
| 8/5/09 | 325 |
| 8/5/09 | 325 |
| 8/5/09 | 325 |
| 8/5/09 | 325 |
| 8/5/09 | 325 |
| 8/5/09 | 325 |
| 8/5/09 | 325 |
| 8/5/09 | 325 |
| 8/5/09 | 325 |
| 8/5/09 | 325 |
| 8/5/09 | 325 |
| 8/5/09 | 325 |
| 8/4/09 | 325 |
| 8/4/09 | 325 |
| 8/4/09 | 324 |
| 8/4/09 | 325 |
| 8/4/09 | 324 |
| 8/4/09 | 325 |
| 8/4/09 | 325 |
| 8/4/09 | 325 |
| 8/4/09 | 324 |
| 8/4/09 | 325 |
| 8/4/09 | 324 |
| 8/4/09 | 324 |
| 8/4/09 | 324 |
| 8/4/09 | 324 |
| 8/4/09 | 324 |
| 8/4/09 | 325 |
| 8/4/09 | 324 |
| 8/4/09 | 323 |
| 8/4/09 | 323 |
| 8/4/09 | 322 |
| 8/4/09 | 322 |
| 8/4/09 | 324 |
| 8/4/09 | 324 |
| 8/4/09 | 324 |
| 8/4/09 | 325 |
| 8/4/09 | 325 |
| 8/4/09 | 324 |
| 8/4/09 | 324 |
| 8/4/09 | 323 |
| 8/4/09 | 325 |
| 8/4/09 | 325 |
| 8/4/09 | 325 |
| 8/4/09 | 324 |
| 8/4/09 | 324 |
| 8/4/09 | 324 |
| 8/4/09 | 325 |
| 8/4/09 | 324 |
| 8/4/09 | 324 |
| 8/4/09 | 324 |
| 8/4/09 | 324 |
| 8/4/09 | 321 |
| 8/4/09 | 324 |
| 8/4/09 | 325 |
| 8/4/09 | 325 |
| 8/4/09 | 325 |
| 8/4/09 | 326 |
| 8/4/09 | 325 |
| 8/4/09 | 325 |
| 8/3/09 | 325 |
| 8/3/09 | 325 |
| 8/3/09 | 324 |
| 8/3/09 | 324 |
| 8/3/09 | 325 |
| 8/3/09 | 325 |
| 8/3/09 | 324 |
| 8/3/09 | 326 |
| 8/3/09 | 326 |
| 8/3/09 | 326 |
| 8/3/09 | 325 |
| 8/3/09 | 325 |
| 8/3/09 | 325 |
| 8/3/09 | 325 |
| 8/3/09 | 325 |
| 8/3/09 | 324 |
| 8/3/09 | 326 |
| 8/3/09 | 325 |
| 8/3/09 | 324 |
| 8/3/09 | 324 |
| 8/3/09 | 325 |
| 8/3/09 | 325 |
| 8/3/09 | 325 |
| 8/3/09 | 325 |
| 8/3/09 | 325 |
| 8/3/09 | 325 |
| 8/3/09 | 326 |
| 8/3/09 | 325 |
| 8/3/09 | 325 |
| 8/3/09 | 325 |
| 8/3/09 | 325 |
| 8/3/09 | 325 |
| 8/3/09 | 325 |
| 8/3/09 | 325 |
| 8/3/09 | 324 |
| 8/3/09 | 325 |
| 8/3/09 | 325 |
| 8/3/09 | 325 |
| 8/3/09 | 324 |
| 8/3/09 | 324 |
| 8/3/09 | 325 |
| 8/3/09 | 324 |
| 8/3/09 | 324 |
| 8/3/09 | 324 |
| 8/3/09 | 324 |
| 8/3/09 | 324 |
| 8/3/09 | 324 |
| 8/3/09 | 323 |
| 8/2/09 | 323 |
| 8/2/09 | 323 |
| 8/2/09 | 322 |
| 8/2/09 | 322 |
| 8/2/09 | 322 |
| 8/2/09 | 322 |
| 8/2/09 | 323 |
| 8/2/09 | 323 |
| 8/2/09 | 323 |
| 8/2/09 | 323 |
| 8/2/09 | 323 |
| 8/2/09 | 323 |
| 8/2/09 | 324 |
| 8/2/09 | 324 |
| 8/2/09 | 324 |
| 8/2/09 | 324 |
| 8/2/09 | 323 |
| 8/2/09 | 323 |
| 8/2/09 | 324 |
| 8/2/09 | 324 |
| 8/2/09 | 324 |
| 8/2/09 | 324 |
| 8/2/09 | 325 |
| 8/2/09 | 325 |
| 8/2/09 | 325 |
| 8/2/09 | 325 |
| 8/2/09 | 324 |
| 8/2/09 | 324 |
| 8/2/09 | 325 |
| 8/2/09 | 325 |
| 8/2/09 | 320 |
| 8/2/09 | 324 |
| 8/2/09 | 322 |
| 8/2/09 | 324 |
| 8/2/09 | 325 |
| 8/2/09 | 324 |
| 8/2/09 | 325 |
| 8/2/09 | 325 |
| 8/2/09 | 325 |
| 8/2/09 | 325 |
| 8/2/09 | 325 |
| 8/2/09 | 325 |
| 8/2/09 | 325 |
| 8/2/09 | 325 |
| 8/2/09 | 325 |
| 8/2/09 | 325 |
| 8/2/09 | 325 |
| 8/2/09 | 325 |
| 8/1/09 | 325 |
| 8/1/09 | 325 |
| 8/1/09 | 324 |
| 8/1/09 | 325 |
| 8/1/09 | 324 |
| 8/1/09 | 325 |
| 8/1/09 | 324 |
| 8/1/09 | 325 |
| 8/1/09 | 324 |
| 8/1/09 | 325 |
| 8/1/09 | 324 |
| 8/1/09 | 324 |
| 8/1/09 | 325 |
| 8/1/09 | 325 |
| 8/1/09 | 325 |
| 8/1/09 | 326 |
| 8/1/09 | 327 |
| 8/1/09 | 326 |
| 8/1/09 | 326 |
| 8/1/09 | 326 |
| 8/1/09 | 326 |
| 8/1/09 | 326 |
| 8/1/09 | 326 |
| 8/1/09 | 326 |
| 8/1/09 | 327 |
| 8/1/09 | 326 |
| 8/1/09 | 326 |
| 8/1/09 | 326 |
| 8/1/09 | 325 |
| 8/1/09 | 325 |
| 8/1/09 | 325 |
| 8/1/09 | 325 |
| 8/1/09 | 325 |
| 8/1/09 | 325 |
| 8/1/09 | 325 |
| 8/1/09 | 325 |
| 8/1/09 | 325 |
| 8/1/09 | 324 |
| 8/1/09 | 324 |
| 8/1/09 | 324 |
| 8/1/09 | 324 |
| 8/1/09 | 324 |
| 8/1/09 | 324 |
| 8/1/09 | 324 |
| 8/1/09 | 324 |
| 8/1/09 | 324 |
| 8/1/09 | 324 |
| 8/1/09 | 324 |
| 7/31/09 | 325 |
| 7/31/09 | 323 |
| 7/31/09 | 325 |
| 7/31/09 | 325 |
| 7/31/09 | 325 |
| 7/31/09 | 323 |
| 7/31/09 | 325 |
| 7/31/09 | 325 |
| 7/31/09 | 325 |
| 7/31/09 | 325 |
| 7/31/09 | 325 |
| 7/31/09 | 325 |
| 7/31/09 | 325 |
| 7/31/09 | 325 |
| 7/31/09 | 324 |
| 7/31/09 | 324 |
| 7/31/09 | 325 |
| 7/31/09 | 326 |
| 7/31/09 | 327 |
| 7/31/09 | 326 |
| 7/31/09 | 326 |
| 7/31/09 | 327 |
| 7/31/09 | 327 |
| 7/31/09 | 327 |
| 7/31/09 | 327 |
| 7/31/09 | 326 |
| 7/31/09 | 326 |
| 7/31/09 | 324 |
| 7/31/09 | 324 |
| 7/31/09 | 322 |
| 7/31/09 | 322 |
| 7/31/09 | 324 |
| 7/31/09 | 322 |
| 7/31/09 | 322 |
| 7/31/09 | 325 |
| 7/31/09 | 325 |
| 7/31/09 | 326 |
| 7/31/09 | 326 |
| 7/31/09 | 326 |
| 7/31/09 | 327 |
| 7/31/09 | 327 |
| 7/31/09 | 327 |
| 7/31/09 | 326 |
| 7/31/09 | 326 |
| 7/31/09 | 327 |
| 7/31/09 | 327 |
| 7/31/09 | 327 |
| 7/31/09 | 327 |
| 7/30/09 | 326 |
| 7/30/09 | 326 |
| 7/30/09 | 326 |
| 7/30/09 | 326 |
| 7/30/09 | 326 |
| 7/30/09 | 325 |
| 7/30/09 | 325 |
| 7/30/09 | 325 |
| 7/30/09 | 325 |
| 7/30/09 | 326 |
| 7/30/09 | 327 |
| 7/30/09 | 327 |
| 7/30/09 | 326 |
| 7/30/09 | 326 |
| 7/30/09 | 327 |
| 7/30/09 | 327 |
| 7/30/09 | 327 |
| 7/30/09 | 326 |
| 7/30/09 | 328 |
| 7/30/09 | 328 |
| 7/30/09 | 327 |
| 7/30/09 | 327 |
| 7/30/09 | 328 |
| 7/30/09 | 327 |
| 7/30/09 | 327 |
| 7/30/09 | 326 |
| 7/30/09 | 326 |
| 7/30/09 | 327 |
| 7/30/09 | 327 |
| 7/30/09 | 327 |
| 7/30/09 | 327 |
| 7/30/09 | 326 |
| 7/30/09 | 326 |
| 7/30/09 | 325 |
| 7/30/09 | 325 |
| 7/30/09 | 325 |
| 7/30/09 | 325 |
| 7/30/09 | 325 |
| 7/30/09 | 325 |
| 7/30/09 | 325 |
| 7/30/09 | 325 |
| 7/30/09 | 325 |
| 7/30/09 | 325 |
| 7/30/09 | 325 |
| 7/30/09 | 325 |
| 7/30/09 | 324 |
| 7/30/09 | 324 |
| 7/30/09 | 324 |
| 7/29/09 | 324 |
| 7/29/09 | 323 |
| 7/29/09 | 323 |
| 7/29/09 | 323 |
| 7/29/09 | 323 |
| 7/29/09 | 323 |
| 7/29/09 | 323 |
| 7/29/09 | 324 |
| 7/29/09 | 323 |
| 7/29/09 | 323 |
| 7/29/09 | 323 |
| 7/29/09 | 323 |
| 7/29/09 | 323 |
| 7/29/09 | 325 |
| 7/29/09 | 326 |
| 7/29/09 | 326 |
| 7/29/09 | 326 |
| 7/29/09 | 326 |
| 7/29/09 | 326 |
| 7/29/09 | 326 |
| 7/29/09 | 326 |
| 7/29/09 | 327 |
| 7/29/09 | 327 |
| 7/29/09 | 327 |
| 7/29/09 | 327 |
| 7/29/09 | 327 |
| 7/29/09 | 325 |
| 7/29/09 | 327 |
| 7/29/09 | 328 |
| 7/29/09 | 328 |
| 7/29/09 | 328 |
| 7/29/09 | 329 |
| 7/29/09 | 328 |
| 7/29/09 | 328 |
| 7/29/09 | 329 |
| 7/29/09 | 329 |
| 7/29/09 | 329 |
| 7/29/09 | 329 |
| 7/29/09 | 330 |
| 7/29/09 | 331 |
| 7/29/09 | 331 |
| 7/29/09 | 331 |
| 7/29/09 | 331 |
| 7/29/09 | 331 |
| 7/29/09 | 331 |
| 7/29/09 | 331 |
| 7/29/09 | 330 |
| 7/29/09 | 330 |
| 7/28/09 | 330 |
| 7/28/09 | 330 |
| 7/28/09 | 330 |
| 7/28/09 | 329 |
| 7/28/09 | 329 |
| 7/28/09 | 330 |
| 7/28/09 | 329 |
| 7/28/09 | 329 |
| 7/28/09 | 329 |
| 7/28/09 | 329 |
| 7/28/09 | 329 |
| 7/28/09 | 329 |
| 7/28/09 | 328 |
| 7/28/09 | 329 |
| 7/28/09 | 329 |
| 7/28/09 | 330 |
| 7/28/09 | 330 |
| 7/28/09 | 330 |
| 7/28/09 | 329 |
| 7/28/09 | 329 |
| 7/28/09 | 329 |
| 7/28/09 | 329 |
| 7/28/09 | 329 |
| 7/28/09 | 329 |
| 7/28/09 | 329 |
| 7/28/09 | 329 |
| 7/28/09 | 328 |
| 7/28/09 | 328 |
| 7/28/09 | 329 |
| 7/28/09 | 329 |
| 7/28/09 | 328 |
| 7/28/09 | 329 |
| 7/28/09 | 329 |
| 7/28/09 | 329 |
| 7/28/09 | 329 |
| 7/28/09 | 329 |
| 7/28/09 | 329 |
| 7/28/09 | 329 |
| 7/28/09 | 329 |
| 7/28/09 | 329 |
| 7/28/09 | 329 |
| 7/28/09 | 329 |
| 7/28/09 | 330 |
| 7/28/09 | 330 |
| 7/28/09 | 330 |
| 7/28/09 | 329 |
| 7/28/09 | 330 |
| 7/28/09 | 330 |
| 7/27/09 | 336 |
| 7/27/09 | 329 |
| 7/27/09 | 328 |
| 7/27/09 | 328 |
| 7/27/09 | 329 |
| 7/27/09 | 329 |
| 7/27/09 | 328 |
| 7/27/09 | 328 |
| 7/27/09 | 328 |
| 7/27/09 | 329 |
| 7/27/09 | 329 |
| 7/27/09 | 330 |
| 7/27/09 | 330 |
| 7/27/09 | 330 |
| 7/27/09 | 330 |
| 7/27/09 | 330 |
| 7/27/09 | 330 |
| 7/27/09 | 330 |
| 7/27/09 | 329 |
| 7/27/09 | 329 |
| 7/27/09 | 329 |
| 7/27/09 | 329 |
| 7/27/09 | 328 |
| 7/27/09 | 328 |
| 7/27/09 | 328 |
| 7/27/09 | 329 |
| 7/27/09 | 328 |
| 7/27/09 | 328 |
| 7/27/09 | 329 |
| 7/27/09 | 329 |
| 7/27/09 | 329 |
| 7/27/09 | 328 |
| 7/27/09 | 328 |
| 7/27/09 | 328 |
| 7/27/09 | 328 |
| 7/27/09 | 328 |
| 7/27/09 | 328 |
| 7/27/09 | 327 |
| 7/27/09 | 327 |
| 7/27/09 | 327 |
| 7/27/09 | 327 |
| 7/27/09 | 327 |
| 7/27/09 | 327 |
| 7/27/09 | 327 |
| 7/27/09 | 327 |
| 7/27/09 | 327 |
| 7/27/09 | 327 |
| 7/27/09 | 327 |
| 7/26/09 | 327 |
| 7/26/09 | 326 |
| 7/26/09 | 326 |
| 7/26/09 | 327 |
| 7/26/09 | 328 |
| 7/26/09 | 328 |
| 7/26/09 | 328 |
| 7/26/09 | 328 |
| 7/26/09 | 329 |
| 7/26/09 | 329 |
| 7/26/09 | 329 |
| 7/26/09 | 329 |
| 7/26/09 | 329 |
| 7/26/09 | 326 |
| 7/26/09 | 328 |
| 7/26/09 | 327 |
| 7/26/09 | 326 |
| 7/26/09 | 325 |
| 7/26/09 | 325 |
| 7/26/09 | 328 |
| 7/26/09 | 328 |
| 7/26/09 | 328 |
| 7/26/09 | 328 |
| 7/26/09 | 327 |
| 7/26/09 | 328 |
| 7/26/09 | 328 |
| 7/26/09 | 328 |
| 7/26/09 | 328 |
| 7/26/09 | 328 |
| 7/26/09 | 328 |
| 7/26/09 | 328 |
| 7/26/09 | 328 |
| 7/26/09 | 328 |
| 7/26/09 | 328 |
| 7/26/09 | 328 |
| 7/26/09 | 328 |
| 7/26/09 | 340 |
| 7/26/09 | 341 |
| 7/26/09 | 341 |
| 7/26/09 | 333 |
| 7/26/09 | 333 |
| 7/26/09 | 332 |
| 7/26/09 | 338 |
| 7/26/09 | 331 |
| 7/26/09 | 330 |
| 7/26/09 | 330 |
| 7/26/09 | 329 |
| 7/26/09 | 329 |
| 7/25/09 | 331 |
| 7/25/09 | 330 |
| 7/25/09 | 330 |
| 7/25/09 | 329 |
| 7/25/09 | 329 |
| 7/25/09 | 338 |
| 7/25/09 | 338 |
| 7/25/09 | 338 |
| 7/25/09 | 341 |
| 7/25/09 | 341 |
| 7/25/09 | 327 |
| 7/25/09 | 328 |
| 7/25/09 | 327 |
| 7/25/09 | 327 |
| 7/25/09 | 326 |
| 7/25/09 | 326 |
| 7/25/09 | 327 |
| 7/25/09 | 327 |
| 7/25/09 | 326 |
| 7/25/09 | 326 |
| 7/25/09 | 326 |
| 7/25/09 | 327 |
| 7/25/09 | 326 |
| 7/25/09 | 327 |
| 7/25/09 | 327 |
| 7/25/09 | 327 |
| 7/25/09 | 327 |
| 7/25/09 | 327 |
| 7/25/09 | 327 |
| 7/25/09 | 327 |
| 7/25/09 | 327 |
| 7/25/09 | 327 |
| 7/25/09 | 327 |
| 7/25/09 | 327 |
| 7/25/09 | 327 |
| 7/25/09 | 326 |
| 7/25/09 | 326 |
| 7/25/09 | 332 |
| 7/25/09 | 326 |
| 7/25/09 | 326 |
| 7/25/09 | 326 |
| 7/25/09 | 326 |
| 7/25/09 | 326 |
| 7/25/09 | 326 |
| 7/25/09 | 326 |
| 7/25/09 | 327 |
| 7/25/09 | 328 |
| 7/25/09 | 328 |
| 7/24/09 | 328 |
| 7/24/09 | 327 |
| 7/24/09 | 327 |
| 7/24/09 | 327 |
| 7/24/09 | 327 |
| 7/24/09 | 328 |
| 7/24/09 | 327 |
| 7/24/09 | 328 |
| 7/24/09 | 328 |
| 7/24/09 | 328 |
| 7/24/09 | 327 |
| 7/24/09 | 327 |
| 7/24/09 | 327 |
| 7/24/09 | 327 |
| 7/24/09 | 327 |
| 7/24/09 | 328 |
| 7/24/09 | 328 |
| 7/24/09 | 328 |
| 7/24/09 | 328 |
| 7/24/09 | 328 |
| 7/24/09 | 329 |
| 7/24/09 | 327 |
| 7/24/09 | 327 |
| 7/24/09 | 327 |
| 7/24/09 | 328 |
| 7/24/09 | 328 |
| 7/24/09 | 328 |
| 7/24/09 | 327 |
| 7/24/09 | 327 |
| 7/24/09 | 329 |
| 7/24/09 | 329 |
| 7/24/09 | 327 |
| 7/24/09 | 327 |
| 7/24/09 | 327 |
| 7/24/09 | 327 |
| 7/24/09 | 326 |
| 7/24/09 | 327 |
| 7/24/09 | 327 |
| 7/24/09 | 328 |
| 7/24/09 | 326 |
| 7/24/09 | 327 |
| 7/24/09 | 327 |
| 7/24/09 | 329 |
| 7/24/09 | 327 |
| 7/24/09 | 329 |
| 7/24/09 | 329 |
| 7/24/09 | 328 |
| 7/24/09 | 329 |
| 7/23/09 | 330 |
| 7/23/09 | 330 |
| 7/23/09 | 329 |
| 7/23/09 | 330 |
| 7/23/09 | 330 |
| 7/23/09 | 329 |
| 7/23/09 | 329 |
| 7/23/09 | 329 |
| 7/23/09 | 329 |
| 7/23/09 | 328 |
| 7/23/09 | 327 |
| 7/23/09 | 328 |
| 7/23/09 | 326 |
| 7/23/09 | 326 |
| 7/23/09 | 327 |
| 7/23/09 | 325 |
| 7/23/09 | 326 |
| 7/23/09 | 326 |
| 7/23/09 | 328 |
| 7/23/09 | 328 |
| 7/23/09 | 327 |
| 7/23/09 | 328 |
| 7/23/09 | 328 |
| 7/23/09 | 329 |
| 7/23/09 | 328 |
| 7/23/09 | 328 |
| 7/23/09 | 329 |
| 7/23/09 | 328 |
| 7/23/09 | 330 |
| 7/23/09 | 330 |
| 7/23/09 | 328 |
| 7/23/09 | 327 |
| 7/23/09 | 330 |
| 7/23/09 | 327 |
| 7/23/09 | 327 |
| 7/23/09 | 329 |
| 7/23/09 | 331 |
| 7/23/09 | 333 |
| 7/23/09 | 335 |
| 7/23/09 | 336 |
| 7/23/09 | 337 |
| 7/23/09 | 338 |
| 7/23/09 | 339 |
| 7/23/09 | 338 |
| 7/23/09 | 338 |
| 7/23/09 | 338 |
| 7/23/09 | 339 |
| 7/23/09 | 338 |
| 7/22/09 | 338 |
| 7/22/09 | 338 |
| 7/22/09 | 338 |
| 7/22/09 | 338 |
| 7/22/09 | 337 |
| 7/22/09 | 337 |
| 7/22/09 | 332 |
| 7/22/09 | 334 |
| 7/22/09 | 334 |
| 7/22/09 | 337 |
| 7/22/09 | 337 |
| 7/22/09 | 337 |
| 7/22/09 | 336 |
| 7/22/09 | 337 |
| 7/22/09 | 337 |
| 7/22/09 | 338 |
| 7/22/09 | 338 |
| 7/22/09 | 338 |
| 7/22/09 | 338 |
| 7/22/09 | 339 |
| 7/22/09 | 340 |
| 7/22/09 | 338 |
| 7/22/09 | 339 |
| 7/22/09 | 338 |
| 7/22/09 | 336 |
| 7/22/09 | 338 |
| 7/22/09 | 337 |
| 7/22/09 | 337 |
| 7/22/09 | 336 |
| 7/22/09 | 334 |
| 7/22/09 | 335 |
| 7/22/09 | 336 |
| 7/22/09 | 334 |
| 7/22/09 | 334 |
| 7/22/09 | 333 |
| 7/22/09 | 333 |
| 7/22/09 | 334 |
| 7/22/09 | 334 |
| 7/22/09 | 334 |
| 7/22/09 | 334 |
| 7/22/09 | 334 |
| 7/22/09 | 334 |
| 7/22/09 | 334 |
| 7/22/09 | 333 |
| 7/22/09 | 333 |
| 7/22/09 | 333 |
| 7/22/09 | 333 |
| 7/22/09 | 333 |
| 7/21/09 | 333 |
| 7/21/09 | 332 |
| 7/21/09 | 332 |
| 7/21/09 | 332 |
| 7/21/09 | 333 |
| 7/21/09 | 334 |
| 7/21/09 | 334 |
| 7/21/09 | 334 |
| 7/21/09 | 335 |
| 7/21/09 | 335 |
| 7/21/09 | 336 |
| 7/21/09 | 334 |
| 7/21/09 | 334 |
| 7/21/09 | 334 |
| 7/21/09 | 336 |
| 7/21/09 | 336 |
| 7/21/09 | 335 |
| 7/21/09 | 334 |
| 7/21/09 | 334 |
| 7/21/09 | 334 |
| 7/21/09 | 334 |
| 7/21/09 | 335 |
| 7/21/09 | 335 |
| 7/21/09 | 335 |
| 7/21/09 | 335 |
| 7/21/09 | 334 |
| 7/21/09 | 334 |
| 7/21/09 | 334 |
| 7/21/09 | 334 |
| 7/21/09 | 334 |
| 7/21/09 | 334 |
| 7/21/09 | 334 |
| 7/21/09 | 335 |
| 7/21/09 | 335 |
| 7/21/09 | 335 |
| 7/21/09 | 334 |
| 7/21/09 | 335 |
| 7/21/09 | 335 |
| 7/21/09 | 335 |
| 7/21/09 | 334 |
| 7/21/09 | 334 |
| 7/21/09 | 334 |
| 7/21/09 | 334 |
| 7/21/09 | 334 |
| 7/21/09 | 334 |
| 7/21/09 | 334 |
| 7/21/09 | 333 |
| 7/21/09 | 333 |
| 7/20/09 | 334 |
| 7/20/09 | 334 |
| 7/20/09 | 334 |
| 7/20/09 | 334 |
| 7/20/09 | 334 |
| 7/20/09 | 334 |
| 7/20/09 | 334 |
| 7/20/09 | 334 |
| 7/20/09 | 334 |
| 7/20/09 | 335 |
| 7/20/09 | 335 |
| 7/20/09 | 335 |
| 7/20/09 | 335 |
| 7/20/09 | 336 |
| 7/20/09 | 336 |
| 7/20/09 | 336 |
| 7/20/09 | 335 |
| 7/20/09 | 334 |
| 7/20/09 | 335 |
| 7/20/09 | 335 |
| 7/20/09 | 335 |
| 7/20/09 | 335 |
| 7/20/09 | 335 |
| 7/20/09 | 335 |
| 7/20/09 | 335 |
| 7/20/09 | 334 |
| 7/20/09 | 334 |
| 7/20/09 | 334 |
| 7/20/09 | 335 |
| 7/20/09 | 334 |
| 7/20/09 | 334 |
| 7/20/09 | 334 |
| 7/20/09 | 334 |
| 7/20/09 | 334 |
| 7/20/09 | 334 |
| 7/20/09 | 334 |
| 7/20/09 | 334 |
| 7/20/09 | 335 |
| 7/20/09 | 334 |
| 7/20/09 | 334 |
| 7/20/09 | 334 |
| 7/20/09 | 331 |
| 7/20/09 | 332 |
| 7/20/09 | 333 |
| 7/20/09 | 333 |
| 7/20/09 | 332 |
| 7/20/09 | 333 |
| 7/20/09 | 333 |
| 7/19/09 | 332 |
| 7/19/09 | 333 |
| 7/19/09 | 334 |
| 7/19/09 | 333 |
| 7/19/09 | 334 |
| 7/19/09 | 334 |
| 7/19/09 | 334 |
| 7/19/09 | 335 |
| 7/19/09 | 335 |
| 7/19/09 | 334 |
| 7/19/09 | 334 |
| 7/19/09 | 335 |
| 7/19/09 | 335 |
| 7/19/09 | 335 |
| 7/19/09 | 335 |
| 7/19/09 | 334 |
| 7/19/09 | 335 |
| 7/19/09 | 334 |
| 7/19/09 | 334 |
| 7/19/09 | 333 |
| 7/19/09 | 334 |
| 7/19/09 | 335 |
| 7/19/09 | 334 |
| 7/19/09 | 334 |
| 7/19/09 | 334 |
| 7/19/09 | 334 |
| 7/19/09 | 334 |
| 7/19/09 | 334 |
| 7/19/09 | 334 |
| 7/19/09 | 334 |
| 7/19/09 | 334 |
| 7/19/09 | 334 |
| 7/19/09 | 334 |
| 7/19/09 | 334 |
| 7/19/09 | 334 |
| 7/19/09 | 334 |
| 7/19/09 | 334 |
| 7/19/09 | 334 |
| 7/19/09 | 334 |
| 7/19/09 | 334 |
| 7/19/09 | 334 |
| 7/19/09 | 334 |
| 7/19/09 | 334 |
| 7/19/09 | 334 |
| 7/19/09 | 334 |
| 7/19/09 | 334 |
| 7/19/09 | 334 |
| 7/19/09 | 334 |
| 7/18/09 | 334 |
| 7/18/09 | 334 |
| 7/18/09 | 335 |
| 7/18/09 | 335 |
| 7/18/09 | 335 |
| 7/18/09 | 335 |
| 7/18/09 | 335 |
| 7/18/09 | 335 |
| 7/18/09 | 335 |
| 7/18/09 | 335 |
| 7/18/09 | 335 |
| 7/18/09 | 334 |
| 7/18/09 | 334 |
| 7/18/09 | 335 |
| 7/18/09 | 335 |
| 7/18/09 | 335 |
| 7/18/09 | 335 |
| 7/18/09 | 335 |
| 7/18/09 | 335 |
| 7/18/09 | 335 |
| 7/18/09 | 335 |
| 7/18/09 | 335 |
| 7/18/09 | 335 |
| 7/18/09 | 335 |
| 7/18/09 | 335 |
| 7/18/09 | 334 |
| 7/18/09 | 334 |
| 7/18/09 | 335 |
| 7/18/09 | 335 |
| 7/18/09 | 334 |
| 7/18/09 | 335 |
| 7/18/09 | 335 |
| 7/18/09 | 335 |
| 7/18/09 | 335 |
| 7/18/09 | 335 |
| 7/18/09 | 335 |
| 7/18/09 | 335 |
| 7/18/09 | 336 |
| 7/18/09 | 336 |
| 7/18/09 | 336 |
| 7/18/09 | 336 |
| 7/18/09 | 336 |
| 7/18/09 | 336 |
| 7/18/09 | 336 |
| 7/18/09 | 336 |
| 7/18/09 | 336 |
| 7/18/09 | 336 |
| 7/18/09 | 336 |
| 7/17/09 | 336 |
| 7/17/09 | 336 |
| 7/17/09 | 336 |
| 7/17/09 | 336 |
| 7/17/09 | 337 |
| 7/17/09 | 337 |
| 7/17/09 | 337 |
| 7/17/09 | 336 |
| 7/17/09 | 336 |
| 7/17/09 | 336 |
| 7/17/09 | 338 |
| 7/17/09 | 338 |
| 7/17/09 | 338 |
| 7/17/09 | 338 |
| 7/17/09 | 338 |
| 7/17/09 | 337 |
| 7/17/09 | 338 |
| 7/17/09 | 337 |
| 7/17/09 | 338 |
| 7/17/09 | 338 |
| 7/17/09 | 338 |
| 7/17/09 | 338 |
| 7/17/09 | 338 |
| 7/17/09 | 339 |
| 7/17/09 | 339 |
| 7/17/09 | 339 |
| 7/17/09 | 338 |
| 7/17/09 | 338 |
| 7/17/09 | 339 |
| 7/17/09 | 339 |
| 7/17/09 | 339 |
| 7/17/09 | 339 |
| 7/17/09 | 339 |
| 7/17/09 | 339 |
| 7/17/09 | 338 |
| 7/17/09 | 339 |
| 7/17/09 | 339 |
| 7/17/09 | 339 |
| 7/17/09 | 339 |
| 7/17/09 | 339 |
| 7/17/09 | 339 |
| 7/17/09 | 339 |
| 7/17/09 | 339 |
| 7/17/09 | 339 |
| 7/17/09 | 339 |
| 7/17/09 | 339 |
| 7/17/09 | 339 |
| 7/17/09 | 339 |
| 7/16/09 | 339 |
| 7/16/09 | 339 |
| 7/16/09 | 339 |
| 7/16/09 | 339 |
| 7/16/09 | 339 |
| 7/16/09 | 339 |
| 7/16/09 | 339 |
| 7/16/09 | 340 |
| 7/16/09 | 340 |
| 7/16/09 | 340 |
| 7/16/09 | 340 |
| 7/16/09 | 340 |
| 7/16/09 | 341 |
| 7/16/09 | 341 |
| 7/16/09 | 342 |
| 7/16/09 | 341 |
| 7/16/09 | 340 |
| 7/16/09 | 340 |
| 7/16/09 | 341 |
| 7/16/09 | 341 |
| 7/16/09 | 340 |
| 7/16/09 | 341 |
| 7/16/09 | 340 |
| 7/16/09 | 341 |
| 7/16/09 | 341 |
| 7/16/09 | 340 |
| 7/16/09 | 340 |
| 7/16/09 | 339 |
| 7/16/09 | 339 |
| 7/16/09 | 339 |
| 7/16/09 | 339 |
| 7/16/09 | 339 |
| 7/16/09 | 339 |
| 7/16/09 | 339 |
| 7/16/09 | 339 |
| 7/16/09 | 340 |
| 7/16/09 | 339 |
| 7/16/09 | 339 |
| 7/16/09 | 339 |
| 7/16/09 | 340 |
| 7/16/09 | 339 |
| 7/16/09 | 340 |
| 7/16/09 | 340 |
| 7/16/09 | 340 |
| 7/16/09 | 340 |
| 7/16/09 | 340 |
| 7/16/09 | 340 |
| 7/16/09 | 340 |
| 7/15/09 | 340 |
| 7/15/09 | 340 |
| 7/15/09 | 339 |
| 7/15/09 | 340 |
| 7/15/09 | 340 |
| 7/15/09 | 340 |
| 7/15/09 | 340 |
| 7/15/09 | 339 |
| 7/15/09 | 339 |
| 7/15/09 | 340 |
| 7/15/09 | 340 |
| 7/15/09 | 339 |
| 7/15/09 | 339 |
| 7/15/09 | 339 |
| 7/15/09 | 340 |
| 7/15/09 | 339 |
| 7/15/09 | 339 |
| 7/15/09 | 339 |
| 7/15/09 | 339 |
| 7/15/09 | 339 |
| 7/15/09 | 340 |
| 7/15/09 | 339 |
| 7/15/09 | 340 |
| 7/15/09 | 340 |
| 7/15/09 | 340 |
| 7/15/09 | 340 |
| 7/15/09 | 340 |
| 7/15/09 | 339 |
| 7/15/09 | 339 |
| 7/15/09 | 340 |
| 7/15/09 | 339 |
| 7/15/09 | 339 |
| 7/15/09 | 339 |
| 7/15/09 | 339 |
| 7/15/09 | 339 |
| 7/15/09 | 338 |
| 7/15/09 | 339 |
| 7/15/09 | 338 |
| 7/15/09 | 338 |
| 7/15/09 | 339 |
| 7/15/09 | 339 |
| 7/15/09 | 339 |
| 7/15/09 | 339 |
| 7/15/09 | 339 |
| 7/15/09 | 338 |
| 7/15/09 | 339 |
| 7/15/09 | 339 |
| 7/15/09 | 340 |
| 7/14/09 | 340 |
| 7/14/09 | 339 |
| 7/14/09 | 339 |
| 7/14/09 | 339 |
| 7/14/09 | 339 |
| 7/14/09 | 340 |
| 7/14/09 | 339 |
| 7/14/09 | 340 |
| 7/14/09 | 338 |
| 7/14/09 | 339 |
| 7/14/09 | 339 |
| 7/14/09 | 339 |
| 7/14/09 | 338 |
| 7/14/09 | 338 |
| 7/14/09 | 338 |
| 7/14/09 | 339 |
| 7/14/09 | 339 |
| 7/14/09 | 339 |
| 7/14/09 | 339 |
| 7/14/09 | 339 |
| 7/14/09 | 339 |
| 7/14/09 | 338 |
| 7/14/09 | 338 |
| 7/14/09 | 338 |
| 7/14/09 | 337 |
| 7/14/09 | 337 |
| 7/14/09 | 337 |
| 7/14/09 | 338 |
| 7/14/09 | 338 |
| 7/14/09 | 338 |
| 7/14/09 | 338 |
| 7/14/09 | 338 |
| 7/14/09 | 338 |
| 7/14/09 | 338 |
| 7/14/09 | 338 |
| 7/14/09 | 338 |
| 7/14/09 | 338 |
| 7/14/09 | 338 |
| 7/14/09 | 338 |
| 7/14/09 | 338 |
| 7/14/09 | 338 |
| 7/14/09 | 338 |
| 7/14/09 | 338 |
| 7/14/09 | 338 |
| 7/14/09 | 338 |
| 7/14/09 | 339 |
| 7/14/09 | 338 |
| 7/14/09 | 339 |
| 7/13/09 | 338 |
| 7/13/09 | 338 |
| 7/13/09 | 338 |
| 7/13/09 | 338 |
| 7/13/09 | 338 |
| 7/13/09 | 338 |
| 7/13/09 | 339 |
| 7/13/09 | 338 |
| 7/13/09 | 337 |
| 7/13/09 | 337 |
| 7/13/09 | 336 |
| 7/13/09 | 337 |
| 7/13/09 | 337 |
| 7/13/09 | 337 |
| 7/13/09 | 337 |
| 7/13/09 | 338 |
| 7/13/09 | 338 |
| 7/13/09 | 338 |
| 7/13/09 | 338 |
| 7/13/09 | 338 |
| 7/13/09 | 336 |
| 7/13/09 | 337 |
| 7/13/09 | 337 |
| 7/13/09 | 337 |
| 7/13/09 | 337 |
| 7/13/09 | 336 |
| 7/13/09 | 336 |
| 7/13/09 | 336 |
| 7/13/09 | 335 |
| 7/13/09 | 335 |
| 7/13/09 | 336 |
| 7/13/09 | 336 |
| 7/13/09 | 336 |
| 7/13/09 | 336 |
| 7/13/09 | 336 |
| 7/13/09 | 336 |
| 7/13/09 | 336 |
| 7/13/09 | 336 |
| 7/13/09 | 336 |
| 7/13/09 | 336 |
| 7/13/09 | 334 |
| 7/13/09 | 334 |
| 7/13/09 | 334 |
| 7/13/09 | 335 |
| 7/13/09 | 335 |
| 7/13/09 | 335 |
| 7/13/09 | 335 |
| 7/13/09 | 335 |
| 7/12/09 | 336 |
| 7/12/09 | 336 |
| 7/12/09 | 336 |
| 7/12/09 | 337 |
| 7/12/09 | 337 |
| 7/12/09 | 336 |
| 7/12/09 | 336 |
| 7/12/09 | 336 |
| 7/12/09 | 336 |
| 7/12/09 | 336 |
| 7/12/09 | 335 |
| 7/12/09 | 335 |
| 7/12/09 | 335 |
| 7/12/09 | 334 |
| 7/12/09 | 335 |
| 7/12/09 | 335 |
| 7/12/09 | 335 |
| 7/12/09 | 335 |
| 7/12/09 | 335 |
| 7/12/09 | 335 |
| 7/12/09 | 334 |
| 7/12/09 | 336 |
| 7/12/09 | 336 |
| 7/12/09 | 335 |
| 7/12/09 | 336 |
| 7/12/09 | 336 |
| 7/12/09 | 335 |
| 7/12/09 | 335 |
| 7/12/09 | 335 |
| 7/12/09 | 336 |
| 7/12/09 | 335 |
| 7/12/09 | 336 |
| 7/12/09 | 336 |
| 7/12/09 | 336 |
| 7/12/09 | 336 |
| 7/12/09 | 336 |
| 7/12/09 | 336 |
| 7/12/09 | 337 |
| 7/12/09 | 337 |
| 7/12/09 | 337 |
| 7/12/09 | 337 |
| 7/12/09 | 337 |
| 7/12/09 | 337 |
| 7/12/09 | 337 |
| 7/12/09 | 335 |
| 7/12/09 | 335 |
| 7/12/09 | 335 |
| 7/12/09 | 335 |
| 7/11/09 | 335 |
| 7/11/09 | 335 |
| 7/11/09 | 334 |
| 7/11/09 | 334 |
| 7/11/09 | 333 |
| 7/11/09 | 334 |
| 7/11/09 | 334 |
| 7/11/09 | 334 |
| 7/11/09 | 336 |
| 7/11/09 | 335 |
| 7/11/09 | 335 |
| 7/11/09 | 336 |
| 7/11/09 | 337 |
| 7/11/09 | 335 |
| 7/11/09 | 333 |
| 7/11/09 | 334 |
| 7/11/09 | 334 |
| 7/11/09 | 334 |
| 7/11/09 | 334 |
| 7/11/09 | 334 |
| 7/11/09 | 334 |
| 7/11/09 | 335 |
| 7/11/09 | 335 |
| 7/11/09 | 334 |
| 7/11/09 | 334 |
| 7/11/09 | 334 |
| 7/11/09 | 333 |
| 7/11/09 | 333 |
| 7/11/09 | 333 |
| 7/11/09 | 333 |
| 7/11/09 | 332 |
| 7/11/09 | 332 |
| 7/11/09 | 332 |
| 7/11/09 | 332 |
| 7/11/09 | 332 |
| 7/11/09 | 332 |
| 7/11/09 | 331 |
| 7/11/09 | 333 |
| 7/11/09 | 333 |
| 7/11/09 | 333 |
| 7/11/09 | 334 |
| 7/11/09 | 334 |
| 7/11/09 | 333 |
| 7/11/09 | 334 |
| 7/11/09 | 333 |
| 7/11/09 | 334 |
| 7/11/09 | 333 |
| 7/11/09 | 334 |
| 7/10/09 | 333 |
| 7/10/09 | 333 |
| 7/10/09 | 334 |
| 7/10/09 | 334 |
| 7/10/09 | 334 |
| 7/10/09 | 336 |
| 7/10/09 | 336 |
| 7/10/09 | 337 |
| 7/10/09 | 336 |
| 7/10/09 | 335 |
| 7/10/09 | 337 |
| 7/10/09 | 336 |
| 7/10/09 | 335 |
| 7/10/09 | 335 |
| 7/10/09 | 335 |
| 7/10/09 | 336 |
| 7/10/09 | 336 |
| 7/10/09 | 336 |
| 7/10/09 | 336 |
| 7/10/09 | 336 |
| 7/10/09 | 335 |
| 7/10/09 | 336 |
| 7/10/09 | 335 |
| 7/10/09 | 335 |
| 7/10/09 | 334 |
| 7/10/09 | 334 |
| 7/10/09 | 335 |
| 7/10/09 | 334 |
| 7/10/09 | 335 |
| 7/10/09 | 335 |
| 7/10/09 | 335 |
| 7/10/09 | 335 |
| 7/10/09 | 335 |
| 7/10/09 | 334 |
| 7/10/09 | 334 |
| 7/10/09 | 333 |
| 7/10/09 | 333 |
| 7/10/09 | 333 |
| 7/10/09 | 334 |
| 7/10/09 | 334 |
| 7/10/09 | 334 |
| 7/10/09 | 334 |
| 7/10/09 | 334 |
| 7/10/09 | 334 |
| 7/10/09 | 334 |
| 7/10/09 | 334 |
| 7/10/09 | 334 |
| 7/10/09 | 335 |
| 7/9/09 | 334 |
| 7/9/09 | 334 |
| 7/9/09 | 337 |
| 7/9/09 | 336 |
| 7/9/09 | 336 |
| 7/9/09 | 335 |
| 7/9/09 | 336 |
| 7/9/09 | 335 |
| 7/9/09 | 334 |
| 7/9/09 | 334 |
| 7/9/09 | 334 |
| 7/9/09 | 335 |
| 7/9/09 | 334 |
| 7/9/09 | 334 |
| 7/9/09 | 335 |
| 7/9/09 | 335 |
| 7/9/09 | 335 |
| 7/9/09 | 335 |
| 7/9/09 | 335 |
| 7/9/09 | 334 |
| 7/9/09 | 335 |
| 7/9/09 | 335 |
| 7/9/09 | 335 |
| 7/9/09 | 335 |
| 7/9/09 | 335 |
| 7/9/09 | 335 |
| 7/9/09 | 335 |
| 7/9/09 | 335 |
| 7/9/09 | 333 |
| 7/9/09 | 335 |
| 7/9/09 | 335 |
| 7/9/09 | 335 |
| 7/9/09 | 334 |
| 7/9/09 | 334 |
| 7/9/09 | 334 |
| 7/9/09 | 334 |
| 7/9/09 | 333 |
| 7/9/09 | 333 |
| 7/9/09 | 334 |
| 7/9/09 | 334 |
| 7/9/09 | 334 |
| 7/9/09 | 334 |
| 7/9/09 | 334 |
| 7/9/09 | 334 |
| 7/9/09 | 335 |
| 7/9/09 | 334 |
| 7/9/09 | 334 |
| 7/9/09 | 334 |
| 7/8/09 | 335 |
| 7/8/09 | 336 |
| 7/8/09 | 335 |
| 7/8/09 | 335 |
| 7/8/09 | 335 |
| 7/8/09 | 336 |
| 7/8/09 | 335 |
| 7/8/09 | 335 |
| 7/8/09 | 335 |
| 7/8/09 | 335 |
| 7/8/09 | 334 |
| 7/8/09 | 334 |
| 7/8/09 | 334 |
| 7/8/09 | 334 |
| 7/8/09 | 334 |
| 7/8/09 | 333 |
| 7/8/09 | 333 |
| 7/8/09 | 334 |
| 7/8/09 | 334 |
| 7/8/09 | 333 |
| 7/8/09 | 333 |
| 7/8/09 | 333 |
| 7/8/09 | 334 |
| 7/8/09 | 334 |
| 7/8/09 | 334 |
| 7/8/09 | 334 |
| 7/8/09 | 334 |
| 7/8/09 | 334 |
| 7/8/09 | 334 |
| 7/8/09 | 334 |
| 7/8/09 | 334 |
| 7/8/09 | 334 |
| 7/8/09 | 334 |
| 7/8/09 | 334 |
| 7/8/09 | 334 |
| 7/8/09 | 333 |
| 7/8/09 | 333 |
| 7/8/09 | 333 |
| 7/8/09 | 333 |
| 7/8/09 | 333 |
| 7/8/09 | 333 |
| 7/8/09 | 333 |
| 7/8/09 | 333 |
| 7/8/09 | 333 |
| 7/8/09 | 333 |
| 7/8/09 | 334 |
| 7/8/09 | 334 |
| 7/8/09 | 334 |
| 7/7/09 | 333 |
| 7/7/09 | 333 |
| 7/7/09 | 332 |
| 7/7/09 | 332 |
| 7/7/09 | 333 |
| 7/7/09 | 333 |
| 7/7/09 | 333 |
| 7/7/09 | 334 |
| 7/7/09 | 332 |
| 7/7/09 | 333 |
| 7/7/09 | 333 |
| 7/7/09 | 335 |
| 7/7/09 | 333 |
| 7/7/09 | 334 |
| 7/7/09 | 333 |
| 7/7/09 | 333 |
| 7/7/09 | 334 |
| 7/7/09 | 334 |
| 7/7/09 | 333 |
| 7/7/09 | 334 |
| 7/7/09 | 332 |
| 7/7/09 | 332 |
| 7/7/09 | 332 |
| 7/7/09 | 332 |
| 7/7/09 | 332 |
| 7/7/09 | 333 |
| 7/7/09 | 333 |
| 7/7/09 | 331 |
| 7/7/09 | 332 |
| 7/7/09 | 332 |
| 7/7/09 | 333 |
| 7/7/09 | 333 |
| 7/7/09 | 332 |
| 7/7/09 | 333 |
| 7/7/09 | 332 |
| 7/7/09 | 332 |
| 7/7/09 | 332 |
| 7/7/09 | 332 |
| 7/7/09 | 333 |
| 7/7/09 | 333 |
| 7/7/09 | 332 |
| 7/7/09 | 332 |
| 7/7/09 | 332 |
| 7/7/09 | 332 |
| 7/7/09 | 332 |
| 7/7/09 | 332 |
| 7/7/09 | 333 |
| 7/7/09 | 333 |
| 7/6/09 | 334 |
| 7/6/09 | 334 |
| 7/6/09 | 334 |
| 7/6/09 | 334 |
| 7/6/09 | 333 |
| 7/6/09 | 332 |
| 7/6/09 | 332 |
| 7/6/09 | 332 |
| 7/6/09 | 332 |
| 7/6/09 | 332 |
| 7/6/09 | 331 |
| 7/6/09 | 331 |
| 7/6/09 | 330 |
| 7/6/09 | 331 |
| 7/6/09 | 332 |
| 7/6/09 | 332 |
| 7/6/09 | 332 |
| 7/6/09 | 331 |
| 7/6/09 | 330 |
| 7/6/09 | 331 |
| 7/6/09 | 331 |
| 7/6/09 | 332 |
| 7/6/09 | 331 |
| 7/6/09 | 332 |
| 7/6/09 | 332 |
| 7/6/09 | 331 |
| 7/6/09 | 332 |
| 7/6/09 | 332 |
| 7/6/09 | 332 |
| 7/6/09 | 331 |
| 7/6/09 | 332 |
| 7/6/09 | 332 |
| 7/6/09 | 332 |
| 7/6/09 | 332 |
| 7/6/09 | 332 |
| 7/6/09 | 331 |
| 7/6/09 | 332 |
| 7/6/09 | 332 |
| 7/6/09 | 328 |
| 7/6/09 | 332 |
| 7/6/09 | 332 |
| 7/6/09 | 332 |
| 7/6/09 | 333 |
| 7/6/09 | 332 |
| 7/6/09 | 331 |
| 7/6/09 | 331 |
| 7/6/09 | 331 |
| 7/6/09 | 332 |
| 7/5/09 | 332 |
| 7/5/09 | 332 |
| 7/5/09 | 332 |
| 7/5/09 | 332 |
| 7/5/09 | 332 |
| 7/5/09 | 332 |
| 7/5/09 | 333 |
| 7/5/09 | 332 |
| 7/5/09 | 332 |
| 7/5/09 | 332 |
| 7/5/09 | 331 |
| 7/5/09 | 330 |
| 7/5/09 | 331 |
| 7/5/09 | 331 |
| 7/5/09 | 331 |
| 7/5/09 | 332 |
| 7/5/09 | 332 |
| 7/5/09 | 332 |
| 7/5/09 | 332 |
| 7/5/09 | 332 |
| 7/5/09 | 332 |
| 7/5/09 | 332 |
| 7/5/09 | 332 |
| 7/5/09 | 332 |
| 7/5/09 | 331 |
| 7/5/09 | 332 |
| 7/5/09 | 332 |
| 7/5/09 | 331 |
| 7/5/09 | 331 |
| 7/5/09 | 331 |
| 7/5/09 | 331 |
| 7/5/09 | 331 |
| 7/5/09 | 331 |
| 7/5/09 | 331 |
| 7/5/09 | 331 |
| 7/5/09 | 331 |
| 7/5/09 | 330 |
| 7/5/09 | 331 |
| 7/5/09 | 331 |
| 7/5/09 | 331 |
| 7/5/09 | 329 |
| 7/5/09 | 331 |
| 7/5/09 | 331 |
| 7/5/09 | 331 |
| 7/5/09 | 331 |
| 7/5/09 | 331 |
| 7/5/09 | 331 |
| 7/5/09 | 331 |
| 7/4/09 | 331 |
| 7/4/09 | 331 |
| 7/4/09 | 331 |
| 7/4/09 | 331 |
| 7/4/09 | 331 |
| 7/4/09 | 331 |
| 7/4/09 | 331 |
| 7/4/09 | 331 |
| 7/4/09 | 331 |
| 7/4/09 | 331 |
| 7/4/09 | 331 |
| 7/4/09 | 331 |
| 7/4/09 | 331 |
| 7/4/09 | 332 |
| 7/4/09 | 331 |
| 7/4/09 | 331 |
| 7/4/09 | 331 |
| 7/4/09 | 331 |
| 7/4/09 | 331 |
| 7/4/09 | 332 |
| 7/4/09 | 331 |
| 7/4/09 | 331 |
| 7/4/09 | 331 |
| 7/4/09 | 331 |
| 7/4/09 | 331 |
| 7/4/09 | 331 |
| 7/4/09 | 331 |
| 7/4/09 | 331 |
| 7/4/09 | 331 |
| 7/4/09 | 332 |
| 7/4/09 | 332 |
| 7/4/09 | 331 |
| 7/4/09 | 331 |
| 7/4/09 | 331 |
| 7/4/09 | 331 |
| 7/4/09 | 330 |
| 7/4/09 | 330 |
| 7/4/09 | 330 |
| 7/4/09 | 330 |
| 7/4/09 | 330 |
| 7/4/09 | 331 |
| 7/4/09 | 330 |
| 7/4/09 | 330 |
| 7/4/09 | 331 |
| 7/4/09 | 330 |
| 7/4/09 | 330 |
| 7/4/09 | 330 |
| 7/4/09 | 331 |
| 7/3/09 | 331 |
| 7/3/09 | 331 |
| 7/3/09 | 330 |
| 7/3/09 | 331 |
| 7/3/09 | 331 |
| 7/3/09 | 331 |
| 7/3/09 | 331 |
| 7/3/09 | 331 |
| 7/3/09 | 331 |
| 7/3/09 | 331 |
| 7/3/09 | 331 |
| 7/3/09 | 331 |
| 7/3/09 | 331 |
| 7/3/09 | 331 |
| 7/3/09 | 331 |
| 7/3/09 | 331 |
| 7/3/09 | 331 |
| 7/3/09 | 331 |
| 7/3/09 | 332 |
| 7/3/09 | 332 |
| 7/3/09 | 331 |
| 7/3/09 | 331 |
| 7/3/09 | 331 |
| 7/3/09 | 331 |
| 7/3/09 | 331 |
| 7/3/09 | 331 |
| 7/3/09 | 331 |
| 7/3/09 | 331 |
| 7/3/09 | 331 |
| 7/3/09 | 331 |
| 7/3/09 | 332 |
| 7/3/09 | 332 |
| 7/3/09 | 332 |
| 7/3/09 | 332 |
| 7/3/09 | 332 |
| 7/3/09 | 332 |
| 7/3/09 | 332 |
| 7/3/09 | 332 |
| 7/3/09 | 332 |
| 7/3/09 | 332 |
| 7/3/09 | 332 |
| 7/3/09 | 332 |
| 7/3/09 | 332 |
| 7/3/09 | 332 |
| 7/3/09 | 332 |
| 7/3/09 | 332 |
| 7/3/09 | 332 |
| 7/3/09 | 332 |
| 7/2/09 | 332 |
| 7/2/09 | 332 |
| 7/2/09 | 332 |
| 7/2/09 | 332 |
| 7/2/09 | 332 |
| 7/2/09 | 332 |
| 7/2/09 | 332 |
| 7/2/09 | 332 |
| 7/2/09 | 331 |
| 7/2/09 | 331 |
| 7/2/09 | 331 |
| 7/2/09 | 330 |
| 7/2/09 | 331 |
| 7/2/09 | 331 |
| 7/2/09 | 331 |
| 7/2/09 | 331 |
| 7/2/09 | 331 |
| 7/2/09 | 331 |
| 7/2/09 | 331 |
| 7/2/09 | 331 |
| 7/2/09 | 331 |
| 7/2/09 | 331 |
| 7/2/09 | 331 |
| 7/2/09 | 331 |
| 7/2/09 | 332 |
| 7/2/09 | 332 |
| 7/2/09 | 332 |
| 7/2/09 | 331 |
| 7/2/09 | 331 |
| 7/2/09 | 331 |
| 7/2/09 | 331 |
| 7/2/09 | 331 |
| 7/2/09 | 331 |
| 7/2/09 | 331 |
| 7/2/09 | 331 |
| 7/2/09 | 330 |
| 7/2/09 | 330 |
| 7/2/09 | 330 |
| 7/2/09 | 330 |
| 7/2/09 | 331 |
| 7/2/09 | 331 |
| 7/2/09 | 331 |
| 7/2/09 | 331 |
| 7/2/09 | 331 |
| 7/2/09 | 331 |
| 7/2/09 | 331 |
| 7/2/09 | 331 |
| 7/2/09 | 331 |
| 7/1/09 | 331 |
| 7/1/09 | 331 |
| 7/1/09 | 331 |
| 7/1/09 | 333 |
| 7/1/09 | 333 |
| 7/1/09 | 333 |
| 7/1/09 | 333 |
| 7/1/09 | 333 |
| 7/1/09 | 334 |
| 7/1/09 | 333 |
| 7/1/09 | 333 |
| 7/1/09 | 333 |
| 7/1/09 | 334 |
| 7/1/09 | 334 |
| 7/1/09 | 333 |
| 7/1/09 | 334 |
| 7/1/09 | 333 |
| 7/1/09 | 333 |
| 7/1/09 | 333 |
| 7/1/09 | 333 |
| 7/1/09 | 333 |
| 7/1/09 | 334 |
| 7/1/09 | 334 |
| 7/1/09 | 333 |
| 7/1/09 | 333 |
| 7/1/09 | 334 |
| 7/1/09 | 334 |
| 7/1/09 | 334 |
| 7/1/09 | 334 |
| 7/1/09 | 334 |
| 7/1/09 | 334 |
| 7/1/09 | 334 |
| 7/1/09 | 334 |
| 7/1/09 | 334 |
| 7/1/09 | 334 |
| 7/1/09 | 334 |
| 7/1/09 | 334 |
| 7/1/09 | 334 |
| 7/1/09 | 334 |
| 7/1/09 | 334 |
| 7/1/09 | 334 |
| 7/1/09 | 334 |
| 7/1/09 | 334 |
| 7/1/09 | 334 |
| 7/1/09 | 333 |
| 7/1/09 | 333 |
| 7/1/09 | 333 |
| 7/1/09 | 333 |
| 6/30/09 | 333 |
| 6/30/09 | 333 |
| 6/30/09 | 333 |
| 6/30/09 | 334 |
| 6/30/09 | 333 |
| 6/30/09 | 334 |
| 6/30/09 | 333 |
| 6/30/09 | 333 |
| 6/30/09 | 333 |
| 6/30/09 | 334 |
| 6/30/09 | 334 |
| 6/30/09 | 333 |
| 6/30/09 | 333 |
| 6/30/09 | 334 |
| 6/30/09 | 334 |
| 6/30/09 | 334 |
| 6/30/09 | 335 |
| 6/30/09 | 334 |
| 6/30/09 | 335 |
| 6/30/09 | 335 |
| 6/30/09 | 335 |
| 6/30/09 | 335 |
| 6/30/09 | 335 |
| 6/30/09 | 336 |
| 6/30/09 | 336 |
| 6/30/09 | 336 |
| 6/30/09 | 336 |
| 6/30/09 | 336 |
| 6/30/09 | 336 |
| 6/30/09 | 336 |
| 6/30/09 | 336 |
| 6/30/09 | 336 |
| 6/30/09 | 336 |
| 6/30/09 | 337 |
| 6/30/09 | 336 |
| 6/30/09 | 336 |
| 6/30/09 | 336 |
| 6/30/09 | 336 |
| 6/30/09 | 336 |
| 6/30/09 | 336 |
| 6/30/09 | 336 |
| 6/30/09 | 336 |
| 6/30/09 | 336 |
| 6/30/09 | 336 |
| 6/30/09 | 336 |
| 6/30/09 | 336 |
| 6/30/09 | 336 |
| 6/30/09 | 336 |
| 6/29/09 | 336 |
| 6/29/09 | 336 |
| 6/29/09 | 336 |
| 6/29/09 | 336 |
| 6/29/09 | 336 |
| 6/29/09 | 337 |
| 6/29/09 | 337 |
| 6/29/09 | 336 |
| 6/29/09 | 336 |
| 6/29/09 | 335 |
| 6/29/09 | 336 |
| 6/29/09 | 336 |
| 6/29/09 | 336 |
| 6/29/09 | 336 |
| 6/29/09 | 336 |
| 6/29/09 | 336 |
| 6/29/09 | 336 |
| 6/29/09 | 334 |
| 6/29/09 | 334 |
| 6/29/09 | 336 |
| 6/29/09 | 336 |
| 6/29/09 | 336 |
| 6/29/09 | 336 |
| 6/29/09 | 336 |
| 6/29/09 | 337 |
| 6/29/09 | 336 |
| 6/29/09 | 337 |
| 6/29/09 | 337 |
| 6/29/09 | 337 |
| 6/29/09 | 336 |
| 6/29/09 | 336 |
| 6/29/09 | 336 |
| 6/29/09 | 336 |
| 6/29/09 | 336 |
| 6/29/09 | 336 |
| 6/29/09 | 336 |
| 6/29/09 | 336 |
| 6/29/09 | 336 |
| 6/29/09 | 336 |
| 6/29/09 | 336 |
| 6/29/09 | 336 |
| 6/29/09 | 336 |
| 6/29/09 | 336 |
| 6/29/09 | 336 |
| 6/29/09 | 336 |
| 6/29/09 | 336 |
| 6/29/09 | 336 |
| 6/29/09 | 335 |
| 6/28/09 | 335 |
| 6/28/09 | 335 |
| 6/28/09 | 335 |
| 6/28/09 | 335 |
| 6/28/09 | 335 |
| 6/28/09 | 335 |
| 6/28/09 | 335 |
| 6/28/09 | 335 |
| 6/28/09 | 335 |
| 6/28/09 | 336 |
| 6/28/09 | 336 |
| 6/28/09 | 335 |
| 6/28/09 | 335 |
| 6/28/09 | 335 |
| 6/28/09 | 335 |
| 6/28/09 | 335 |
| 6/28/09 | 336 |
| 6/28/09 | 335 |
| 6/28/09 | 336 |
| 6/28/09 | 336 |
| 6/28/09 | 336 |
| 6/28/09 | 336 |
| 6/28/09 | 336 |
| 6/28/09 | 337 |
| 6/28/09 | 337 |
| 6/28/09 | 337 |
| 6/28/09 | 337 |
| 6/28/09 | 337 |
| 6/28/09 | 336 |
| 6/28/09 | 336 |
| 6/28/09 | 336 |
| 6/28/09 | 336 |
| 6/28/09 | 336 |
| 6/28/09 | 336 |
| 6/28/09 | 336 |
| 6/28/09 | 336 |
| 6/28/09 | 336 |
| 6/28/09 | 336 |
| 6/28/09 | 335 |
| 6/28/09 | 336 |
| 6/28/09 | 335 |
| 6/28/09 | 335 |
| 6/28/09 | 335 |
| 6/28/09 | 336 |
| 6/28/09 | 335 |
| 6/28/09 | 336 |
| 6/28/09 | 336 |
| 6/28/09 | 336 |
| 6/27/09 | 335 |
| 6/27/09 | 335 |
| 6/27/09 | 335 |
| 6/27/09 | 335 |
| 6/27/09 | 334 |
| 6/27/09 | 334 |
| 6/27/09 | 334 |
| 6/27/09 | 335 |
| 6/27/09 | 335 |
| 6/27/09 | 334 |
| 6/27/09 | 335 |
| 6/27/09 | 334 |
| 6/27/09 | 334 |
| 6/27/09 | 335 |
| 6/27/09 | 335 |
| 6/27/09 | 335 |
| 6/27/09 | 335 |
| 6/27/09 | 335 |
| 6/27/09 | 335 |
| 6/27/09 | 336 |
| 6/27/09 | 335 |
| 6/27/09 | 337 |
| 6/27/09 | 336 |
| 6/27/09 | 336 |
| 6/27/09 | 336 |
| 6/27/09 | 338 |
| 6/27/09 | 337 |
| 6/27/09 | 337 |
| 6/27/09 | 336 |
| 6/27/09 | 337 |
| 6/27/09 | 337 |
| 6/27/09 | 337 |
| 6/27/09 | 337 |
| 6/27/09 | 337 |
| 6/27/09 | 336 |
| 6/27/09 | 336 |
| 6/27/09 | 335 |
| 6/27/09 | 335 |
| 6/27/09 | 335 |
| 6/27/09 | 334 |
| 6/27/09 | 334 |
| 6/27/09 | 334 |
| 6/27/09 | 334 |
| 6/27/09 | 334 |
| 6/27/09 | 334 |
| 6/27/09 | 334 |
| 6/27/09 | 333 |
| 6/27/09 | 333 |
| 6/26/09 | 333 |
| 6/26/09 | 333 |
| 6/26/09 | 333 |
| 6/26/09 | 333 |
| 6/26/09 | 333 |
| 6/26/09 | 333 |
| 6/26/09 | 333 |
| 6/26/09 | 333 |
| 6/26/09 | 333 |
| 6/26/09 | 332 |
| 6/26/09 | 332 |
| 6/26/09 | 332 |
| 6/26/09 | 333 |
| 6/26/09 | 333 |
| 6/26/09 | 333 |
| 6/26/09 | 334 |
| 6/26/09 | 334 |
| 6/26/09 | 334 |
| 6/26/09 | 335 |
| 6/26/09 | 335 |
| 6/26/09 | 336 |
| 6/26/09 | 336 |
| 6/26/09 | 337 |
| 6/26/09 | 336 |
| 6/26/09 | 334 |
| 6/26/09 | 333 |
| 6/26/09 | 332 |
| 6/26/09 | 333 |
| 6/26/09 | 333 |
| 6/26/09 | 333 |
| 6/26/09 | 333 |
| 6/26/09 | 333 |
| 6/26/09 | 333 |
| 6/26/09 | 333 |
| 6/26/09 | 333 |
| 6/26/09 | 333 |
| 6/26/09 | 333 |
| 6/26/09 | 332 |
| 6/26/09 | 332 |
| 6/26/09 | 333 |
| 6/26/09 | 334 |
| 6/26/09 | 333 |
| 6/26/09 | 334 |
| 6/26/09 | 333 |
| 6/26/09 | 333 |
| 6/26/09 | 335 |
| 6/26/09 | 334 |
| 6/25/09 | 335 |
| 6/25/09 | 334 |
| 6/25/09 | 336 |
| 6/25/09 | 336 |
| 6/25/09 | 334 |
| 6/25/09 | 334 |
| 6/25/09 | 331 |
| 6/25/09 | 333 |
| 6/25/09 | 335 |
| 6/25/09 | 334 |
| 6/25/09 | 335 |
| 6/25/09 | 335 |
| 6/25/09 | 335 |
| 6/25/09 | 335 |
| 6/25/09 | 335 |
| 6/25/09 | 335 |
| 6/25/09 | 335 |
| 6/25/09 | 335 |
| 6/25/09 | 335 |
| 6/25/09 | 333 |
| 6/25/09 | 335 |
| 6/25/09 | 334 |
| 6/25/09 | 335 |
| 6/25/09 | 334 |
| 6/25/09 | 335 |
| 6/25/09 | 335 |
| 6/25/09 | 334 |
| 6/25/09 | 334 |
| 6/25/09 | 334 |
| 6/25/09 | 334 |
| 6/25/09 | 335 |
| 6/25/09 | 334 |
| 6/25/09 | 334 |
| 6/25/09 | 334 |
| 6/25/09 | 334 |
| 6/25/09 | 334 |
| 6/25/09 | 334 |
| 6/25/09 | 335 |
| 6/25/09 | 335 |
| 6/25/09 | 335 |
| 6/25/09 | 335 |
| 6/25/09 | 336 |
| 6/25/09 | 336 |
| 6/25/09 | 336 |
| 6/25/09 | 337 |
| 6/25/09 | 337 |
| 6/25/09 | 336 |
| 6/25/09 | 336 |
| 6/24/09 | 336 |
| 6/24/09 | 336 |
| 6/24/09 | 336 |
| 6/24/09 | 336 |
| 6/24/09 | 336 |
| 6/24/09 | 336 |
| 6/24/09 | 335 |
| 6/24/09 | 334 |
| 6/24/09 | 334 |
| 6/24/09 | 334 |
| 6/24/09 | 335 |
| 6/24/09 | 334 |
| 6/24/09 | 334 |
| 6/24/09 | 335 |
| 6/24/09 | 335 |
| 6/24/09 | 336 |
| 6/24/09 | 336 |
| 6/24/09 | 335 |
| 6/24/09 | 336 |
| 6/24/09 | 336 |
| 6/24/09 | 336 |
| 6/24/09 | 336 |
| 6/24/09 | 336 |
| 6/24/09 | 336 |
| 6/24/09 | 336 |
| 6/24/09 | 336 |
| 6/24/09 | 336 |
| 6/24/09 | 336 |
| 6/24/09 | 336 |
| 6/24/09 | 336 |
| 6/24/09 | 334 |
| 6/24/09 | 336 |
| 6/24/09 | 336 |
| 6/24/09 | 336 |
| 6/24/09 | 336 |
| 6/24/09 | 336 |
| 6/24/09 | 336 |
| 6/24/09 | 336 |
| 6/24/09 | 336 |
| 6/24/09 | 336 |
| 6/24/09 | 336 |
| 6/24/09 | 336 |
| 6/24/09 | 336 |
| 6/24/09 | 336 |
| 6/24/09 | 336 |
| 6/24/09 | 336 |
| 6/24/09 | 336 |
| 6/24/09 | 336 |
| 6/23/09 | 337 |
| 6/23/09 | 337 |
| 6/23/09 | 336 |
| 6/23/09 | 336 |
| 6/23/09 | 336 |
| 6/23/09 | 336 |
| 6/23/09 | 335 |
| 6/23/09 | 337 |
| 6/23/09 | 336 |
| 6/23/09 | 336 |
| 6/23/09 | 337 |
| 6/23/09 | 336 |
| 6/23/09 | 335 |
| 6/23/09 | 335 |
| 6/23/09 | 336 |
| 6/23/09 | 337 |
| 6/23/09 | 336 |
| 6/23/09 | 336 |
| 6/23/09 | 337 |
| 6/23/09 | 336 |
| 6/23/09 | 335 |
| 6/23/09 | 336 |
| 6/23/09 | 337 |
| 6/23/09 | 336 |
| 6/23/09 | 336 |
| 6/23/09 | 335 |
| 6/23/09 | 336 |
| 6/23/09 | 336 |
| 6/23/09 | 336 |
| 6/23/09 | 336 |
| 6/23/09 | 337 |
| 6/23/09 | 336 |
| 6/23/09 | 336 |
| 6/23/09 | 336 |
| 6/23/09 | 337 |
| 6/23/09 | 336 |
| 6/23/09 | 336 |
| 6/23/09 | 336 |
| 6/23/09 | 336 |
| 6/23/09 | 336 |
| 6/23/09 | 336 |
| 6/23/09 | 336 |
| 6/23/09 | 336 |
| 6/23/09 | 336 |
| 6/23/09 | 336 |
| 6/23/09 | 336 |
| 6/23/09 | 336 |
| 6/23/09 | 336 |
| 6/22/09 | 336 |
| 6/22/09 | 337 |
| 6/22/09 | 337 |
| 6/22/09 | 336 |
| 6/22/09 | 336 |
| 6/22/09 | 335 |
| 6/22/09 | 335 |
| 6/22/09 | 335 |
| 6/22/09 | 335 |
| 6/22/09 | 336 |
| 6/22/09 | 336 |
| 6/22/09 | 336 |
| 6/22/09 | 336 |
| 6/22/09 | 336 |
| 6/22/09 | 336 |
| 6/22/09 | 337 |
| 6/22/09 | 336 |
| 6/22/09 | 336 |
| 6/22/09 | 336 |
| 6/22/09 | 336 |
| 6/22/09 | 335 |
| 6/22/09 | 335 |
| 6/22/09 | 336 |
| 6/22/09 | 337 |
| 6/22/09 | 337 |
| 6/22/09 | 337 |
| 6/22/09 | 337 |
| 6/22/09 | 337 |
| 6/22/09 | 337 |
| 6/22/09 | 337 |
| 6/22/09 | 337 |
| 6/22/09 | 337 |
| 6/22/09 | 337 |
| 6/22/09 | 336 |
| 6/22/09 | 336 |
| 6/22/09 | 336 |
| 6/22/09 | 336 |
| 6/22/09 | 336 |
| 6/22/09 | 336 |
| 6/22/09 | 336 |
| 6/22/09 | 337 |
| 6/22/09 | 336 |
| 6/22/09 | 336 |
| 6/22/09 | 336 |
| 6/22/09 | 335 |
| 6/22/09 | 335 |
| 6/22/09 | 335 |
| 6/22/09 | 336 |
| 6/21/09 | 336 |
| 6/21/09 | 336 |
| 6/21/09 | 336 |
| 6/21/09 | 337 |
| 6/21/09 | 336 |
| 6/21/09 | 336 |
| 6/21/09 | 337 |
| 6/21/09 | 337 |
| 6/21/09 | 336 |
| 6/21/09 | 336 |
| 6/21/09 | 336 |
| 6/21/09 | 336 |
| 6/21/09 | 336 |
| 6/21/09 | 337 |
| 6/21/09 | 337 |
| 6/21/09 | 338 |
| 6/21/09 | 338 |
| 6/21/09 | 336 |
| 6/21/09 | 337 |
| 6/21/09 | 337 |
| 6/21/09 | 337 |
| 6/21/09 | 337 |
| 6/21/09 | 337 |
| 6/21/09 | 337 |
| 6/21/09 | 337 |
| 6/21/09 | 337 |
| 6/21/09 | 337 |
| 6/21/09 | 337 |
| 6/21/09 | 337 |
| 6/21/09 | 337 |
| 6/21/09 | 337 |
| 6/21/09 | 337 |
| 6/21/09 | 337 |
| 6/21/09 | 337 |
| 6/21/09 | 337 |
| 6/21/09 | 337 |
| 6/21/09 | 337 |
| 6/21/09 | 337 |
| 6/21/09 | 336 |
| 6/21/09 | 336 |
| 6/21/09 | 336 |
| 6/21/09 | 337 |
| 6/21/09 | 336 |
| 6/21/09 | 336 |
| 6/21/09 | 336 |
| 6/21/09 | 336 |
| 6/21/09 | 336 |
| 6/21/09 | 336 |
| 6/20/09 | 336 |
| 6/20/09 | 336 |
| 6/20/09 | 336 |
| 6/20/09 | 336 |
| 6/20/09 | 336 |
| 6/20/09 | 337 |
| 6/20/09 | 337 |
| 6/20/09 | 337 |
| 6/20/09 | 338 |
| 6/20/09 | 338 |
| 6/20/09 | 338 |
| 6/20/09 | 339 |
| 6/20/09 | 339 |
| 6/20/09 | 339 |
| 6/20/09 | 339 |
| 6/20/09 | 339 |
| 6/20/09 | 338 |
| 6/20/09 | 339 |
| 6/20/09 | 339 |
| 6/20/09 | 339 |
| 6/20/09 | 339 |
| 6/20/09 | 339 |
| 6/20/09 | 338 |
| 6/20/09 | 338 |
| 6/20/09 | 338 |
| 6/20/09 | 338 |
| 6/20/09 | 338 |
| 6/20/09 | 338 |
| 6/20/09 | 339 |
| 6/20/09 | 339 |
| 6/20/09 | 339 |
| 6/20/09 | 338 |
| 6/20/09 | 339 |
| 6/20/09 | 340 |
| 6/20/09 | 340 |
| 6/20/09 | 339 |
| 6/20/09 | 339 |
| 6/20/09 | 340 |
| 6/20/09 | 340 |
| 6/20/09 | 339 |
| 6/20/09 | 340 |
| 6/20/09 | 340 |
| 6/20/09 | 340 |
| 6/20/09 | 340 |
| 6/20/09 | 339 |
| 6/20/09 | 340 |
| 6/20/09 | 341 |
| 6/20/09 | 340 |
| 6/19/09 | 340 |
| 6/19/09 | 340 |
| 6/19/09 | 340 |
| 6/19/09 | 340 |
| 6/19/09 | 340 |
| 6/19/09 | 341 |
| 6/19/09 | 340 |
| 6/19/09 | 340 |
| 6/19/09 | 340 |
| 6/19/09 | 340 |
| 6/19/09 | 340 |
| 6/19/09 | 340 |
| 6/19/09 | 339 |
| 6/19/09 | 340 |
| 6/19/09 | 340 |
| 6/19/09 | 340 |
| 6/19/09 | 340 |
| 6/19/09 | 340 |
| 6/19/09 | 340 |
| 6/19/09 | 340 |
| 6/19/09 | 340 |
| 6/19/09 | 339 |
| 6/19/09 | 339 |
| 6/19/09 | 339 |
| 6/19/09 | 340 |
| 6/19/09 | 340 |
| 6/19/09 | 340 |
| 6/19/09 | 340 |
| 6/19/09 | 340 |
| 6/19/09 | 340 |
| 6/19/09 | 340 |
| 6/19/09 | 340 |
| 6/19/09 | 340 |
| 6/19/09 | 340 |
| 6/19/09 | 340 |
| 6/19/09 | 340 |
| 6/19/09 | 340 |
| 6/19/09 | 340 |
| 6/19/09 | 340 |
| 6/19/09 | 339 |
| 6/19/09 | 339 |
| 6/19/09 | 339 |
| 6/19/09 | 339 |
| 6/19/09 | 339 |
| 6/19/09 | 339 |
| 6/19/09 | 339 |
| 6/19/09 | 339 |
| 6/19/09 | 339 |
| 6/18/09 | 339 |
| 6/18/09 | 339 |
| 6/18/09 | 340 |
| 6/18/09 | 339 |
| 6/18/09 | 339 |
| 6/18/09 | 339 |
| 6/18/09 | 339 |
| 6/18/09 | 339 |
| 6/18/09 | 339 |
| 6/18/09 | 339 |
| 6/18/09 | 339 |
| 6/18/09 | 340 |
| 6/18/09 | 340 |
| 6/18/09 | 340 |
| 6/18/09 | 340 |
| 6/18/09 | 340 |
| 6/18/09 | 340 |
| 6/18/09 | 340 |
| 6/18/09 | 340 |
| 6/18/09 | 340 |
| 6/18/09 | 339 |
| 6/18/09 | 339 |
| 6/18/09 | 339 |
| 6/18/09 | 340 |
| 6/18/09 | 340 |
| 6/18/09 | 340 |
| 6/18/09 | 340 |
| 6/18/09 | 340 |
| 6/18/09 | 340 |
| 6/18/09 | 340 |
| 6/18/09 | 340 |
| 6/18/09 | 340 |
| 6/18/09 | 340 |
| 6/18/09 | 340 |
| 6/18/09 | 340 |
| 6/18/09 | 340 |
| 6/18/09 | 340 |
| 6/18/09 | 339 |
| 6/18/09 | 340 |
| 6/18/09 | 340 |
| 6/18/09 | 340 |
| 6/18/09 | 340 |
| 6/18/09 | 340 |
| 6/18/09 | 339 |
| 6/18/09 | 339 |
| 6/18/09 | 339 |
| 6/18/09 | 339 |
| 6/18/09 | 339 |
| 6/17/09 | 339 |
| 6/17/09 | 339 |
| 6/17/09 | 340 |
| 6/17/09 | 340 |
| 6/17/09 | 340 |
| 6/17/09 | 340 |
| 6/17/09 | 340 |
| 6/17/09 | 341 |
| 6/17/09 | 341 |
| 6/17/09 | 341 |
| 6/17/09 | 341 |
| 6/17/09 | 341 |
| 6/17/09 | 341 |
| 6/17/09 | 341 |
| 6/17/09 | 340 |
| 6/17/09 | 340 |
| 6/17/09 | 340 |
| 6/17/09 | 341 |
| 6/17/09 | 340 |
| 6/17/09 | 341 |
| 6/17/09 | 341 |
| 6/17/09 | 342 |
| 6/17/09 | 342 |
| 6/17/09 | 341 |
| 6/17/09 | 341 |
| 6/17/09 | 341 |
| 6/17/09 | 342 |
| 6/17/09 | 342 |
| 6/17/09 | 342 |
| 6/17/09 | 342 |
| 6/17/09 | 342 |
| 6/17/09 | 341 |
| 6/17/09 | 340 |
| 6/17/09 | 341 |
| 6/17/09 | 341 |
| 6/17/09 | 341 |
| 6/17/09 | 342 |
| 6/17/09 | 342 |
| 6/17/09 | 342 |
| 6/17/09 | 342 |
| 6/17/09 | 342 |
| 6/17/09 | 342 |
| 6/17/09 | 342 |
| 6/17/09 | 342 |
| 6/17/09 | 342 |
| 6/17/09 | 342 |
| 6/17/09 | 342 |
| 6/17/09 | 342 |
| 6/16/09 | 342 |
| 6/16/09 | 342 |
| 6/16/09 | 342 |
| 6/16/09 | 341 |
| 6/16/09 | 341 |
| 6/16/09 | 341 |
| 6/16/09 | 342 |
| 6/16/09 | 342 |
| 6/16/09 | 341 |
| 6/16/09 | 341 |
| 6/16/09 | 342 |
| 6/16/09 | 342 |
| 6/16/09 | 342 |
| 6/16/09 | 342 |
| 6/16/09 | 342 |
| 6/16/09 | 342 |
| 6/16/09 | 342 |
| 6/16/09 | 342 |
| 6/16/09 | 342 |
| 6/16/09 | 342 |
| 6/16/09 | 343 |
| 6/16/09 | 343 |
| 6/16/09 | 343 |
| 6/16/09 | 343 |
| 6/16/09 | 343 |
| 6/16/09 | 343 |
| 6/16/09 | 344 |
| 6/16/09 | 344 |
| 6/16/09 | 344 |
| 6/16/09 | 344 |
| 6/16/09 | 344 |
| 6/16/09 | 344 |
| 6/16/09 | 344 |
| 6/16/09 | 344 |
| 6/16/09 | 344 |
| 6/16/09 | 344 |
| 6/16/09 | 344 |
| 6/16/09 | 344 |
| 6/16/09 | 344 |
| 6/16/09 | 344 |
| 6/16/09 | 344 |
| 6/16/09 | 344 |
| 6/16/09 | 344 |
| 6/16/09 | 344 |
| 6/16/09 | 344 |
| 6/16/09 | 345 |
| 6/16/09 | 345 |
| 6/16/09 | 345 |
| 6/15/09 | 345 |
| 6/15/09 | 347 |
| 6/15/09 | 345 |
| 6/15/09 | 345 |
| 6/15/09 | 346 |
| 6/15/09 | 345 |
| 6/15/09 | 345 |
| 6/15/09 | 345 |
| 6/15/09 | 345 |
| 6/15/09 | 345 |
| 6/15/09 | 345 |
| 6/15/09 | 345 |
| 6/15/09 | 345 |
| 6/15/09 | 346 |
| 6/15/09 | 345 |
| 6/15/09 | 345 |
| 6/15/09 | 346 |
| 6/15/09 | 345 |
| 6/15/09 | 345 |
| 6/15/09 | 345 |
| 6/15/09 | 345 |
| 6/15/09 | 345 |
| 6/15/09 | 344 |
| 6/15/09 | 344 |
| 6/15/09 | 344 |
| 6/15/09 | 344 |
| 6/15/09 | 344 |
| 6/15/09 | 345 |
| 6/15/09 | 345 |
| 6/15/09 | 345 |
| 6/15/09 | 345 |
| 6/15/09 | 345 |
| 6/15/09 | 345 |
| 6/15/09 | 345 |
| 6/15/09 | 345 |
| 6/15/09 | 345 |
| 6/15/09 | 345 |
| 6/15/09 | 344 |
| 6/15/09 | 345 |
| 6/15/09 | 345 |
| 6/15/09 | 345 |
| 6/15/09 | 345 |
| 6/15/09 | 345 |
| 6/15/09 | 345 |
| 6/15/09 | 345 |
| 6/15/09 | 345 |
| 6/15/09 | 345 |
| 6/15/09 | 345 |
| 6/14/09 | 345 |
| 6/14/09 | 346 |
| 6/14/09 | 346 |
| 6/14/09 | 347 |
| 6/14/09 | 346 |
| 6/14/09 | 346 |
| 6/14/09 | 346 |
| 6/14/09 | 346 |
| 6/14/09 | 346 |
| 6/14/09 | 346 |
| 6/14/09 | 346 |
| 6/14/09 | 346 |
| 6/14/09 | 345 |
| 6/14/09 | 345 |
| 6/14/09 | 345 |
| 6/14/09 | 345 |
| 6/14/09 | 345 |
| 6/14/09 | 345 |
| 6/14/09 | 346 |
| 6/14/09 | 346 |
| 6/14/09 | 345 |
| 6/14/09 | 345 |
| 6/14/09 | 345 |
| 6/14/09 | 345 |
| 6/14/09 | 345 |
| 6/14/09 | 345 |
| 6/14/09 | 346 |
| 6/14/09 | 346 |
| 6/14/09 | 345 |
| 6/14/09 | 345 |
| 6/14/09 | 345 |
| 6/14/09 | 345 |
| 6/14/09 | 345 |
| 6/14/09 | 345 |
| 6/14/09 | 345 |
| 6/14/09 | 345 |
| 6/14/09 | 345 |
| 6/14/09 | 345 |
| 6/14/09 | 345 |
| 6/14/09 | 345 |
| 6/14/09 | 344 |
| 6/14/09 | 345 |
| 6/14/09 | 345 |
| 6/14/09 | 345 |
| 6/14/09 | 345 |
| 6/14/09 | 345 |
| 6/14/09 | 345 |
| 6/14/09 | 345 |
| 6/13/09 | 345 |
| 6/13/09 | 345 |
| 6/13/09 | 345 |
| 6/13/09 | 345 |
| 6/13/09 | 346 |
| 6/13/09 | 345 |
| 6/13/09 | 345 |
| 6/13/09 | 344 |
| 6/13/09 | 345 |
| 6/13/09 | 345 |
| 6/13/09 | 344 |
| 6/13/09 | 344 |
| 6/13/09 | 345 |
| 6/13/09 | 344 |
| 6/13/09 | 344 |
| 6/13/09 | 344 |
| 6/13/09 | 344 |
| 6/13/09 | 345 |
| 6/13/09 | 345 |
| 6/13/09 | 345 |
| 6/13/09 | 346 |
| 6/13/09 | 346 |
| 6/13/09 | 346 |
| 6/13/09 | 346 |
| 6/13/09 | 346 |
| 6/13/09 | 346 |
| 6/13/09 | 346 |
| 6/13/09 | 347 |
| 6/13/09 | 347 |
| 6/13/09 | 346 |
| 6/13/09 | 346 |
| 6/13/09 | 347 |
| 6/13/09 | 347 |
| 6/13/09 | 347 |
| 6/13/09 | 346 |
| 6/13/09 | 346 |
| 6/13/09 | 346 |
| 6/13/09 | 346 |
| 6/13/09 | 345 |
| 6/13/09 | 345 |
| 6/13/09 | 345 |
| 6/13/09 | 345 |
| 6/13/09 | 345 |
| 6/13/09 | 345 |
| 6/13/09 | 345 |
| 6/13/09 | 345 |
| 6/13/09 | 345 |
| 6/13/09 | 345 |
| 6/12/09 | 345 |
| 6/12/09 | 345 |
| 6/12/09 | 344 |
| 6/12/09 | 344 |
| 6/12/09 | 344 |
| 6/12/09 | 344 |
| 6/12/09 | 344 |
| 6/12/09 | 344 |
| 6/12/09 | 344 |
| 6/12/09 | 344 |
| 6/12/09 | 344 |
| 6/12/09 | 343 |
| 6/12/09 | 344 |
| 6/12/09 | 344 |
| 6/12/09 | 344 |
| 6/12/09 | 345 |
| 6/12/09 | 345 |
| 6/12/09 | 344 |
| 6/12/09 | 345 |
| 6/12/09 | 345 |
| 6/12/09 | 345 |
| 6/12/09 | 344 |
| 6/12/09 | 344 |
| 6/12/09 | 345 |
| 6/12/09 | 345 |
| 6/12/09 | 345 |
| 6/12/09 | 344 |
| 6/12/09 | 344 |
| 6/12/09 | 344 |
| 6/12/09 | 344 |
| 6/12/09 | 344 |
| 6/12/09 | 344 |
| 6/12/09 | 344 |
| 6/12/09 | 344 |
| 6/12/09 | 344 |
| 6/12/09 | 344 |
| 6/12/09 | 344 |
| 6/12/09 | 344 |
| 6/12/09 | 344 |
| 6/12/09 | 344 |
| 6/12/09 | 344 |
| 6/12/09 | 344 |
| 6/12/09 | 343 |
| 6/12/09 | 343 |
| 6/12/09 | 343 |
| 6/12/09 | 343 |
| 6/12/09 | 344 |
| 6/12/09 | 343 |
| 6/11/09 | 343 |
| 6/11/09 | 343 |
| 6/11/09 | 343 |
| 6/11/09 | 343 |
| 6/11/09 | 343 |
| 6/11/09 | 343 |
| 6/11/09 | 343 |
| 6/11/09 | 343 |
| 6/11/09 | 343 |
| 6/11/09 | 343 |
| 6/11/09 | 343 |
| 6/11/09 | 343 |
| 6/11/09 | 343 |
| 6/11/09 | 343 |
| 6/11/09 | 343 |
| 6/11/09 | 343 |
| 6/11/09 | 342 |
| 6/11/09 | 343 |
| 6/11/09 | 344 |
| 6/11/09 | 345 |
| 6/11/09 | 345 |
| 6/11/09 | 345 |
| 6/11/09 | 345 |
| 6/11/09 | 344 |
| 6/11/09 | 344 |
| 6/11/09 | 345 |
| 6/11/09 | 345 |
| 6/11/09 | 345 |
| 6/11/09 | 345 |
| 6/11/09 | 345 |
| 6/11/09 | 345 |
| 6/11/09 | 345 |
| 6/11/09 | 345 |
| 6/11/09 | 345 |
| 6/11/09 | 345 |
| 6/11/09 | 345 |
| 6/11/09 | 345 |
| 6/11/09 | 345 |
| 6/11/09 | 345 |
| 6/11/09 | 344 |
| 6/11/09 | 344 |
| 6/11/09 | 344 |
| 6/11/09 | 344 |
| 6/11/09 | 346 |
| 6/11/09 | 346 |
| 6/11/09 | 346 |
| 6/11/09 | 346 |
| 6/11/09 | 346 |
| 6/10/09 | 346 |
| 6/10/09 | 346 |
| 6/10/09 | 346 |
| 6/10/09 | 346 |
| 6/10/09 | 346 |
| 6/10/09 | 345 |
| 6/10/09 | 345 |
| 6/10/09 | 345 |
| 6/10/09 | 345 |
| 6/10/09 | 346 |
| 6/10/09 | 346 |
| 6/10/09 | 346 |
| 6/10/09 | 346 |
| 6/10/09 | 346 |
| 6/10/09 | 346 |
| 6/10/09 | 346 |
| 6/10/09 | 346 |
| 6/10/09 | 346 |
| 6/10/09 | 346 |
| 6/10/09 | 346 |
| 6/10/09 | 346 |
| 6/10/09 | 346 |
| 6/10/09 | 346 |
| 6/10/09 | 346 |
| 6/10/09 | 346 |
| 6/10/09 | 346 |
| 6/10/09 | 346 |
| 6/10/09 | 346 |
| 6/10/09 | 346 |
| 6/10/09 | 346 |
| 6/10/09 | 346 |
| 6/10/09 | 346 |
| 6/10/09 | 346 |
| 6/10/09 | 346 |
| 6/10/09 | 346 |
| 6/10/09 | 346 |
| 6/10/09 | 346 |
| 6/10/09 | 346 |
| 6/10/09 | 346 |
| 6/10/09 | 346 |
| 6/10/09 | 346 |
| 6/10/09 | 346 |
| 6/10/09 | 346 |
| 6/10/09 | 346 |
| 6/10/09 | 346 |
| 6/10/09 | 346 |
| 6/10/09 | 346 |
| 6/10/09 | 346 |
| 6/9/09 | 347 |
| 6/9/09 | 347 |
| 6/9/09 | 347 |
| 6/9/09 | 347 |
| 6/9/09 | 347 |
| 6/9/09 | 346 |
| 6/9/09 | 346 |
| 6/9/09 | 346 |
| 6/9/09 | 346 |
| 6/9/09 | 346 |
| 6/9/09 | 346 |
| 6/9/09 | 347 |
| 6/9/09 | 347 |
| 6/9/09 | 346 |
| 6/9/09 | 346 |
| 6/9/09 | 346 |
| 6/9/09 | 345 |
| 6/9/09 | 346 |
| 6/9/09 | 346 |
| 6/9/09 | 346 |
| 6/9/09 | 347 |
| 6/9/09 | 347 |
| 6/9/09 | 347 |
| 6/9/09 | 346 |
| 6/9/09 | 347 |
| 6/9/09 | 346 |
| 6/9/09 | 347 |
| 6/9/09 | 347 |
| 6/9/09 | 347 |
| 6/9/09 | 347 |
| 6/9/09 | 346 |
| 6/9/09 | 347 |
| 6/9/09 | 347 |
| 6/9/09 | 347 |
| 6/9/09 | 347 |
| 6/9/09 | 347 |
| 6/9/09 | 347 |
| 6/9/09 | 347 |
| 6/9/09 | 347 |
| 6/9/09 | 347 |
| 6/9/09 | 347 |
| 6/9/09 | 348 |
| 6/9/09 | 349 |
| 6/9/09 | 349 |
| 6/9/09 | 349 |
| 6/9/09 | 349 |
| 6/9/09 | 349 |
| 6/9/09 | 349 |
| 6/8/09 | 349 |
| 6/8/09 | 349 |
| 6/8/09 | 348 |
| 6/8/09 | 348 |
| 6/8/09 | 348 |
| 6/8/09 | 348 |
| 6/8/09 | 347 |
| 6/8/09 | 345 |
| 6/8/09 | 346 |
| 6/8/09 | 347 |
| 6/8/09 | 347 |
| 6/8/09 | 347 |
| 6/8/09 | 347 |
| 6/8/09 | 346 |
| 6/8/09 | 347 |
| 6/8/09 | 347 |
| 6/8/09 | 348 |
| 6/8/09 | 347 |
| 6/8/09 | 347 |
| 6/8/09 | 346 |
| 6/8/09 | 348 |
| 6/8/09 | 347 |
| 6/8/09 | 347 |
| 6/8/09 | 347 |
| 6/8/09 | 347 |
| 6/8/09 | 347 |
| 6/8/09 | 348 |
| 6/8/09 | 349 |
| 6/8/09 | 349 |
| 6/8/09 | 348 |
| 6/8/09 | 348 |
| 6/8/09 | 348 |
| 6/8/09 | 348 |
| 6/8/09 | 348 |
| 6/8/09 | 348 |
| 6/8/09 | 348 |
| 6/8/09 | 348 |
| 6/8/09 | 348 |
| 6/8/09 | 349 |
| 6/8/09 | 349 |
| 6/8/09 | 349 |
| 6/8/09 | 350 |
| 6/8/09 | 349 |
| 6/8/09 | 349 |
| 6/8/09 | 349 |
| 6/8/09 | 348 |
| 6/8/09 | 351 |
| 6/8/09 | 351 |
| 6/7/09 | 350 |
| 6/7/09 | 349 |
| 6/7/09 | 348 |
| 6/7/09 | 348 |
| 6/7/09 | 347 |
| 6/7/09 | 345 |
| 6/7/09 | 346 |
| 6/7/09 | 347 |
| 6/7/09 | 347 |
| 6/7/09 | 347 |
| 6/7/09 | 347 |
| 6/7/09 | 347 |
| 6/7/09 | 347 |
| 6/7/09 | 347 |
| 6/7/09 | 347 |
| 6/7/09 | 348 |
| 6/7/09 | 347 |
| 6/7/09 | 347 |
| 6/7/09 | 348 |
| 6/7/09 | 348 |
| 6/7/09 | 348 |
| 6/7/09 | 348 |
| 6/7/09 | 348 |
| 6/7/09 | 348 |
| 6/7/09 | 348 |
| 6/7/09 | 348 |
| 6/7/09 | 349 |
| 6/7/09 | 349 |
| 6/7/09 | 348 |
| 6/7/09 | 348 |
| 6/7/09 | 348 |
| 6/7/09 | 348 |
| 6/7/09 | 348 |
| 6/7/09 | 348 |
| 6/7/09 | 348 |
| 6/7/09 | 348 |
| 6/7/09 | 348 |
| 6/7/09 | 351 |
| 6/7/09 | 348 |
| 6/7/09 | 348 |
| 6/7/09 | 349 |
| 6/7/09 | 349 |
| 6/7/09 | 349 |
| 6/7/09 | 349 |
| 6/7/09 | 349 |
| 6/7/09 | 349 |
| 6/7/09 | 349 |
| 6/7/09 | 348 |
| 6/6/09 | 349 |
| 6/6/09 | 348 |
| 6/6/09 | 349 |
| 6/6/09 | 348 |
| 6/6/09 | 348 |
| 6/6/09 | 348 |
| 6/6/09 | 348 |
| 6/6/09 | 348 |
| 6/6/09 | 348 |
| 6/6/09 | 348 |
| 6/6/09 | 348 |
| 6/6/09 | 348 |
| 6/6/09 | 347 |
| 6/6/09 | 348 |
| 6/6/09 | 347 |
| 6/6/09 | 347 |
| 6/6/09 | 348 |
| 6/6/09 | 348 |
| 6/6/09 | 348 |
| 6/6/09 | 348 |
| 6/6/09 | 348 |
| 6/6/09 | 348 |
| 6/6/09 | 348 |
| 6/6/09 | 348 |
| 6/6/09 | 348 |
| 6/6/09 | 348 |
| 6/6/09 | 348 |
| 6/6/09 | 348 |
| 6/6/09 | 348 |
| 6/6/09 | 348 |
| 6/6/09 | 348 |
| 6/6/09 | 348 |
| 6/6/09 | 348 |
| 6/6/09 | 348 |
| 6/6/09 | 348 |
| 6/6/09 | 347 |
| 6/6/09 | 348 |
| 6/6/09 | 348 |
| 6/6/09 | 348 |
| 6/6/09 | 348 |
| 6/6/09 | 348 |
| 6/6/09 | 348 |
| 6/6/09 | 347 |
| 6/6/09 | 347 |
| 6/6/09 | 347 |
| 6/6/09 | 348 |
| 6/6/09 | 348 |
| 6/6/09 | 348 |
| 6/5/09 | 348 |
| 6/5/09 | 347 |
| 6/5/09 | 348 |
| 6/5/09 | 347 |
| 6/5/09 | 347 |
| 6/5/09 | 347 |
| 6/5/09 | 347 |
| 6/5/09 | 347 |
| 6/5/09 | 347 |
| 6/5/09 | 346 |
| 6/5/09 | 346 |
| 6/5/09 | 347 |
| 6/5/09 | 347 |
| 6/5/09 | 347 |
| 6/5/09 | 347 |
| 6/5/09 | 347 |
| 6/5/09 | 347 |
| 6/5/09 | 347 |
| 6/5/09 | 347 |
| 6/5/09 | 347 |
| 6/5/09 | 347 |
| 6/5/09 | 347 |
| 6/5/09 | 346 |
| 6/5/09 | 347 |
| 6/5/09 | 347 |
| 6/5/09 | 347 |
| 6/5/09 | 347 |
| 6/5/09 | 347 |
| 6/5/09 | 347 |
| 6/5/09 | 347 |
| 6/5/09 | 347 |
| 6/5/09 | 347 |
| 6/5/09 | 346 |
| 6/5/09 | 347 |
| 6/5/09 | 346 |
| 6/5/09 | 346 |
| 6/5/09 | 347 |
| 6/5/09 | 347 |
| 6/5/09 | 347 |
| 6/5/09 | 347 |
| 6/5/09 | 347 |
| 6/5/09 | 347 |
| 6/5/09 | 347 |
| 6/5/09 | 347 |
| 6/5/09 | 347 |
| 6/5/09 | 347 |
| 6/5/09 | 347 |
| 6/5/09 | 347 |
| 6/4/09 | 347 |
| 6/4/09 | 347 |
| 6/4/09 | 347 |
| 6/4/09 | 347 |
| 6/4/09 | 346 |
| 6/4/09 | 346 |
| 6/4/09 | 346 |
| 6/4/09 | 346 |
| 6/4/09 | 347 |
| 6/4/09 | 347 |
| 6/4/09 | 347 |
| 6/4/09 | 347 |
| 6/4/09 | 347 |
| 6/4/09 | 346 |
| 6/4/09 | 346 |
| 6/4/09 | 346 |
| 6/4/09 | 346 |
| 6/4/09 | 347 |
| 6/4/09 | 347 |
| 6/4/09 | 347 |
| 6/4/09 | 347 |
| 6/4/09 | 347 |
| 6/4/09 | 347 |
| 6/4/09 | 346 |
| 6/4/09 | 346 |
| 6/4/09 | 346 |
| 6/4/09 | 346 |
| 6/4/09 | 346 |
| 6/4/09 | 346 |
| 6/4/09 | 346 |
| 6/4/09 | 346 |
| 6/4/09 | 346 |
| 6/4/09 | 346 |
| 6/4/09 | 346 |
| 6/4/09 | 346 |
| 6/4/09 | 346 |
| 6/4/09 | 346 |
| 6/4/09 | 347 |
| 6/4/09 | 347 |
| 6/4/09 | 347 |
| 6/4/09 | 346 |
| 6/4/09 | 346 |
| 6/4/09 | 346 |
| 6/4/09 | 346 |
| 6/4/09 | 346 |
| 6/4/09 | 346 |
| 6/4/09 | 346 |
| 6/4/09 | 347 |
| 6/3/09 | 345 |
| 6/3/09 | 347 |
| 6/3/09 | 347 |
| 6/3/09 | 347 |
| 6/3/09 | 347 |
| 6/3/09 | 347 |
| 6/3/09 | 347 |
| 6/3/09 | 346 |
| 6/3/09 | 346 |
| 6/3/09 | 346 |
| 6/3/09 | 346 |
| 6/3/09 | 346 |
| 6/3/09 | 346 |
| 6/3/09 | 347 |
| 6/3/09 | 346 |
| 6/3/09 | 347 |
| 6/3/09 | 347 |
| 6/3/09 | 347 |
| 6/3/09 | 347 |
| 6/3/09 | 346 |
| 6/3/09 | 346 |
| 6/3/09 | 346 |
| 6/3/09 | 346 |
| 6/3/09 | 346 |
| 6/3/09 | 347 |
| 6/3/09 | 346 |
| 6/3/09 | 347 |
| 6/3/09 | 346 |
| 6/3/09 | 346 |
| 6/3/09 | 346 |
| 6/3/09 | 346 |
| 6/3/09 | 346 |
| 6/3/09 | 346 |
| 6/3/09 | 346 |
| 6/3/09 | 346 |
| 6/3/09 | 346 |
| 6/3/09 | 347 |
| 6/3/09 | 347 |
| 6/3/09 | 347 |
| 6/3/09 | 347 |
| 6/3/09 | 347 |
| 6/3/09 | 347 |
| 6/3/09 | 347 |
| 6/3/09 | 347 |
| 6/3/09 | 347 |
| 6/3/09 | 347 |
| 6/3/09 | 347 |
| 6/3/09 | 347 |
| 6/2/09 | 347 |
| 6/2/09 | 348 |
| 6/2/09 | 348 |
| 6/2/09 | 347 |
| 6/2/09 | 347 |
| 6/2/09 | 347 |
| 6/2/09 | 346 |
| 6/2/09 | 346 |
| 6/2/09 | 347 |
| 6/2/09 | 347 |
| 6/2/09 | 347 |
| 6/2/09 | 347 |
| 6/2/09 | 347 |
| 6/2/09 | 347 |
| 6/2/09 | 348 |
| 6/2/09 | 347 |
| 6/2/09 | 347 |
| 6/2/09 | 347 |
| 6/2/09 | 347 |
| 6/2/09 | 347 |
| 6/2/09 | 347 |
| 6/2/09 | 347 |
| 6/2/09 | 347 |
| 6/2/09 | 348 |
| 6/2/09 | 348 |
| 6/2/09 | 347 |
| 6/2/09 | 347 |
| 6/2/09 | 347 |
| 6/2/09 | 347 |
| 6/2/09 | 348 |
| 6/2/09 | 348 |
| 6/2/09 | 347 |
| 6/2/09 | 347 |
| 6/2/09 | 347 |
| 6/2/09 | 347 |
| 6/2/09 | 347 |
| 6/2/09 | 347 |
| 6/2/09 | 347 |
| 6/2/09 | 347 |
| 6/2/09 | 347 |
| 6/2/09 | 348 |
| 6/2/09 | 348 |
| 6/2/09 | 349 |
| 6/2/09 | 349 |
| 6/2/09 | 349 |
| 6/2/09 | 349 |
| 6/2/09 | 349 |
| 6/2/09 | 349 |
| 6/1/09 | 348 |
| 6/1/09 | 348 |
| 6/1/09 | 347 |
| 6/1/09 | 347 |
| 6/1/09 | 347 |
| 6/1/09 | 347 |
| 6/1/09 | 349 |
| 6/1/09 | 349 |
| 6/1/09 | 349 |
| 6/1/09 | 349 |
| 6/1/09 | 349 |
| 6/1/09 | 349 |
| 6/1/09 | 349 |
| 6/1/09 | 348 |
| 6/1/09 | 348 |
| 6/1/09 | 348 |
| 6/1/09 | 348 |
| 6/1/09 | 349 |
| 6/1/09 | 349 |
| 6/1/09 | 349 |
| 6/1/09 | 349 |
| 6/1/09 | 349 |
| 6/1/09 | 349 |
| 6/1/09 | 349 |
| 6/1/09 | 349 |
| 6/1/09 | 349 |
| 6/1/09 | 349 |
| 6/1/09 | 349 |
| 6/1/09 | 349 |
| 6/1/09 | 349 |
| 6/1/09 | 349 |
| 6/1/09 | 349 |
| 6/1/09 | 349 |
| 6/1/09 | 349 |
| 6/1/09 | 349 |
| 6/1/09 | 349 |
| 6/1/09 | 349 |
| 6/1/09 | 349 |
| 6/1/09 | 349 |
| 6/1/09 | 349 |
| 6/1/09 | 349 |
| 6/1/09 | 349 |
| 6/1/09 | 349 |
| 6/1/09 | 349 |
| 6/1/09 | 349 |
| 6/1/09 | 349 |
| 6/1/09 | 349 |
| 6/1/09 | 349 |
| 5/31/09 | 349 |
| 5/31/09 | 349 |
| 5/31/09 | 349 |
| 5/31/09 | 349 |
| 5/31/09 | 349 |
| 5/31/09 | 349 |
| 5/31/09 | 349 |
| 5/31/09 | 349 |
| 5/31/09 | 349 |
| 5/31/09 | 349 |
| 5/31/09 | 349 |
| 5/31/09 | 349 |
| 5/31/09 | 349 |
| 5/31/09 | 349 |
| 5/31/09 | 349 |
| 5/31/09 | 349 |
| 5/31/09 | 349 |
| 5/31/09 | 349 |
| 5/31/09 | 349 |
| 5/31/09 | 348 |
| 5/31/09 | 349 |
| 5/31/09 | 349 |
| 5/31/09 | 349 |
| 5/31/09 | 349 |
| 5/31/09 | 350 |
| 5/31/09 | 350 |
| 5/31/09 | 350 |
| 5/31/09 | 350 |
| 5/31/09 | 350 |
| 5/31/09 | 350 |
| 5/31/09 | 350 |
| 5/31/09 | 350 |
| 5/31/09 | 350 |
| 5/31/09 | 350 |
| 5/31/09 | 350 |
| 5/31/09 | 349 |
| 5/31/09 | 349 |
| 5/31/09 | 349 |
| 5/31/09 | 349 |
| 5/31/09 | 349 |
| 5/31/09 | 349 |
| 5/31/09 | 349 |
| 5/31/09 | 349 |
| 5/31/09 | 349 |
| 5/31/09 | 349 |
| 5/31/09 | 349 |
| 5/31/09 | 349 |
| 5/31/09 | 348 |
| 5/30/09 | 349 |
| 5/30/09 | 349 |
| 5/30/09 | 348 |
| 5/30/09 | 349 |
| 5/30/09 | 349 |
| 5/30/09 | 348 |
| 5/30/09 | 348 |
| 5/30/09 | 348 |
| 5/30/09 | 348 |
| 5/30/09 | 348 |
| 5/30/09 | 347 |
| 5/30/09 | 348 |
| 5/30/09 | 348 |
| 5/30/09 | 347 |
| 5/30/09 | 347 |
| 5/30/09 | 348 |
| 5/30/09 | 348 |
| 5/30/09 | 348 |
| 5/30/09 | 348 |
| 5/30/09 | 349 |
| 5/30/09 | 349 |
| 5/30/09 | 348 |
| 5/30/09 | 349 |
| 5/30/09 | 349 |
| 5/30/09 | 349 |
| 5/30/09 | 349 |
| 5/30/09 | 349 |
| 5/30/09 | 349 |
| 5/30/09 | 350 |
| 5/30/09 | 349 |
| 5/30/09 | 349 |
| 5/30/09 | 349 |
| 5/30/09 | 349 |
| 5/30/09 | 349 |
| 5/30/09 | 349 |
| 5/30/09 | 349 |
| 5/30/09 | 349 |
| 5/30/09 | 349 |
| 5/30/09 | 349 |
| 5/30/09 | 349 |
| 5/30/09 | 349 |
| 5/30/09 | 349 |
| 5/30/09 | 349 |
| 5/30/09 | 349 |
| 5/30/09 | 348 |
| 5/30/09 | 348 |
| 5/30/09 | 348 |
| 5/30/09 | 347 |
| 5/29/09 | 347 |
| 5/29/09 | 346 |
| 5/29/09 | 346 |
| 5/29/09 | 346 |
| 5/29/09 | 345 |
| 5/29/09 | 345 |
| 5/29/09 | 345 |
| 5/29/09 | 346 |
| 5/29/09 | 346 |
| 5/29/09 | 347 |
| 5/29/09 | 346 |
| 5/29/09 | 346 |
| 5/29/09 | 347 |
| 5/29/09 | 348 |
| 5/29/09 | 348 |
| 5/29/09 | 348 |
| 5/29/09 | 348 |
| 5/29/09 | 349 |
| 5/29/09 | 348 |
| 5/29/09 | 348 |
| 5/29/09 | 348 |
| 5/29/09 | 348 |
| 5/29/09 | 348 |
| 5/29/09 | 347 |
| 5/29/09 | 346 |
| 5/29/09 | 346 |
| 5/29/09 | 346 |
| 5/29/09 | 345 |
| 5/29/09 | 345 |
| 5/29/09 | 345 |
| 5/29/09 | 345 |
| 5/29/09 | 345 |
| 5/29/09 | 346 |
| 5/29/09 | 346 |
| 5/29/09 | 347 |
| 5/29/09 | 348 |
| 5/29/09 | 349 |
| 5/29/09 | 348 |
| 5/29/09 | 349 |
| 5/29/09 | 348 |
| 5/29/09 | 349 |
| 5/29/09 | 349 |
| 5/29/09 | 350 |
| 5/29/09 | 349 |
| 5/29/09 | 349 |
| 5/29/09 | 349 |
| 5/29/09 | 349 |
| 5/29/09 | 348 |
| 5/28/09 | 348 |
| 5/28/09 | 348 |
| 5/28/09 | 348 |
| 5/28/09 | 348 |
| 5/28/09 | 347 |
| 5/28/09 | 347 |
| 5/28/09 | 347 |
| 5/28/09 | 346 |
| 5/28/09 | 346 |
| 5/28/09 | 345 |
| 5/28/09 | 345 |
| 5/28/09 | 345 |
| 5/28/09 | 347 |
| 5/28/09 | 347 |
| 5/28/09 | 347 |
| 5/28/09 | 347 |
| 5/28/09 | 348 |
| 5/28/09 | 348 |
| 5/28/09 | 348 |
| 5/28/09 | 348 |
| 5/28/09 | 347 |
| 5/28/09 | 347 |
| 5/28/09 | 348 |
| 5/28/09 | 348 |
| 5/28/09 | 348 |
| 5/28/09 | 348 |
| 5/28/09 | 348 |
| 5/28/09 | 348 |
| 5/28/09 | 347 |
| 5/28/09 | 347 |
| 5/28/09 | 347 |
| 5/28/09 | 347 |
| 5/28/09 | 346 |
| 5/28/09 | 346 |
| 5/28/09 | 347 |
| 5/28/09 | 348 |
| 5/28/09 | 350 |
| 5/28/09 | 351 |
| 5/28/09 | 351 |
| 5/28/09 | 352 |
| 5/28/09 | 353 |
| 5/28/09 | 353 |
| 5/28/09 | 351 |
| 5/28/09 | 351 |
| 5/28/09 | 350 |
| 5/28/09 | 350 |
| 5/28/09 | 350 |
| 5/28/09 | 349 |
| 5/27/09 | 349 |
| 5/27/09 | 349 |
| 5/27/09 | 349 |
| 5/27/09 | 349 |
| 5/27/09 | 347 |
| 5/27/09 | 351 |
| 5/27/09 | 350 |
| 5/27/09 | 351 |
| 5/27/09 | 352 |
| 5/27/09 | 352 |
| 5/27/09 | 353 |
| 5/27/09 | 352 |
| 5/27/09 | 353 |
| 5/27/09 | 352 |
| 5/27/09 | 353 |
| 5/27/09 | 352 |
| 5/27/09 | 352 |
| 5/27/09 | 353 |
| 5/27/09 | 353 |
| 5/27/09 | 353 |
| 5/27/09 | 353 |
| 5/27/09 | 353 |
| 5/27/09 | 353 |
| 5/27/09 | 353 |
| 5/27/09 | 365 |
| 5/27/09 | 365 |
| 5/27/09 | 365 |
| 5/27/09 | 365 |
| 5/27/09 | 365 |
| 5/27/09 | 365 |
| 5/27/09 | 365 |
| 5/27/09 | 365 |
| 5/27/09 | 365 |
| 5/27/09 | 365 |
| 5/27/09 | 365 |
| 5/27/09 | 365 |
| 5/27/09 | 365 |
| 5/27/09 | 365 |
| 5/27/09 | 365 |
| 5/27/09 | 365 |
| 5/27/09 | 365 |
| 5/27/09 | 365 |
| 5/27/09 | 365 |
| 5/27/09 | 365 |
| 5/27/09 | 364 |
| 5/27/09 | 364 |
| 5/27/09 | 364 |
| 5/26/09 | 364 |
| 5/26/09 | 364 |
| 5/26/09 | 364 |
| 5/26/09 | 364 |
| 5/26/09 | 364 |
| 5/26/09 | 364 |
| 5/26/09 | 364 |
| 5/26/09 | 364 |
| 5/26/09 | 364 |
| 5/26/09 | 364 |
| 5/26/09 | 364 |
| 5/26/09 | 365 |
| 5/26/09 | 364 |
| 5/26/09 | 364 |
| 5/26/09 | 364 |
| 5/26/09 | 364 |
| 5/26/09 | 364 |
| 5/26/09 | 364 |
| 5/26/09 | 364 |
| 5/26/09 | 364 |
| 5/26/09 | 364 |
| 5/26/09 | 365 |
| 5/26/09 | 365 |
| 5/26/09 | 365 |
| 5/26/09 | 365 |
| 5/26/09 | 366 |
| 5/26/09 | 366 |
| 5/26/09 | 366 |
| 5/26/09 | 366 |
| 5/26/09 | 366 |
| 5/26/09 | 366 |
| 5/26/09 | 366 |
| 5/26/09 | 367 |
| 5/26/09 | 367 |
| 5/26/09 | 367 |
| 5/26/09 | 367 |
| 5/26/09 | 366 |
| 5/26/09 | 366 |
| 5/26/09 | 366 |
| 5/26/09 | 366 |
| 5/26/09 | 366 |
| 5/26/09 | 366 |
| 5/26/09 | 367 |
| 5/26/09 | 368 |
| 5/26/09 | 368 |
| 5/26/09 | 368 |
| 5/26/09 | 369 |
| 5/26/09 | 369 |
| 5/25/09 | 368 |
| 5/25/09 | 368 |
| 5/25/09 | 368 |
| 5/25/09 | 368 |
| 5/25/09 | 368 |
| 5/25/09 | 368 |
| 5/25/09 | 368 |
| 5/25/09 | 369 |
| 5/25/09 | 369 |
| 5/25/09 | 369 |
| 5/25/09 | 369 |
| 5/25/09 | 369 |
| 5/25/09 | 369 |
| 5/25/09 | 370 |
| 5/25/09 | 369 |
| 5/25/09 | 370 |
| 5/25/09 | 369 |
| 5/25/09 | 369 |
| 5/25/09 | 369 |
| 5/25/09 | 369 |
| 5/25/09 | 369 |
| 5/25/09 | 369 |
| 5/25/09 | 369 |
| 5/25/09 | 368 |
| 5/25/09 | 368 |
| 5/25/09 | 368 |
| 5/25/09 | 368 |
| 5/25/09 | 369 |
| 5/25/09 | 369 |
| 5/25/09 | 369 |
| 5/25/09 | 370 |
| 5/25/09 | 370 |
| 5/25/09 | 370 |
| 5/25/09 | 370 |
| 5/25/09 | 370 |
| 5/25/09 | 370 |
| 5/25/09 | 370 |
| 5/25/09 | 370 |
| 5/25/09 | 370 |
| 5/25/09 | 370 |
| 5/25/09 | 370 |
| 5/25/09 | 371 |
| 5/25/09 | 371 |
| 5/25/09 | 371 |
| 5/25/09 | 371 |
| 5/25/09 | 371 |
| 5/25/09 | 370 |
| 5/25/09 | 370 |
| 5/24/09 | 370 |
| 5/24/09 | 370 |
| 5/24/09 | 370 |
| 5/24/09 | 369 |
| 5/24/09 | 368 |
| 5/24/09 | 368 |
| 5/24/09 | 368 |
| 5/24/09 | 369 |
| 5/24/09 | 370 |
| 5/24/09 | 369 |
| 5/24/09 | 369 |
| 5/24/09 | 369 |
| 5/24/09 | 369 |
| 5/24/09 | 369 |
| 5/24/09 | 369 |
| 5/24/09 | 369 |
| 5/24/09 | 369 |
| 5/24/09 | 369 |
| 5/24/09 | 369 |
| 5/24/09 | 369 |
| 5/24/09 | 370 |
| 5/24/09 | 370 |
| 5/24/09 | 370 |
| 5/24/09 | 369 |
| 5/24/09 | 370 |
| 5/24/09 | 370 |
| 5/24/09 | 371 |
| 5/24/09 | 371 |
| 5/24/09 | 371 |
| 5/24/09 | 371 |
| 5/24/09 | 372 |
| 5/24/09 | 372 |
| 5/24/09 | 372 |
| 5/24/09 | 372 |
| 5/24/09 | 372 |
| 5/24/09 | 372 |
| 5/24/09 | 372 |
| 5/24/09 | 372 |
| 5/24/09 | 372 |
| 5/24/09 | 373 |
| 5/24/09 | 373 |
| 5/24/09 | 373 |
| 5/24/09 | 372 |
| 5/24/09 | 372 |
| 5/24/09 | 372 |
| 5/24/09 | 371 |
| 5/24/09 | 371 |
| 5/24/09 | 371 |
| 5/23/09 | 371 |
| 5/23/09 | 371 |
| 5/23/09 | 371 |
| 5/23/09 | 371 |
| 5/23/09 | 371 |
| 5/23/09 | 371 |
| 5/23/09 | 370 |
| 5/23/09 | 370 |
| 5/23/09 | 371 |
| 5/23/09 | 370 |
| 5/23/09 | 370 |
| 5/23/09 | 370 |
| 5/23/09 | 370 |
| 5/23/09 | 369 |
| 5/23/09 | 371 |
| 5/23/09 | 370 |
| 5/23/09 | 370 |
| 5/23/09 | 371 |
| 5/23/09 | 370 |
| 5/23/09 | 370 |
| 5/23/09 | 370 |
| 5/23/09 | 370 |
| 5/23/09 | 370 |
| 5/23/09 | 372 |
| 5/23/09 | 372 |
| 5/23/09 | 373 |
| 5/23/09 | 375 |
| 5/23/09 | 375 |
| 5/23/09 | 375 |
| 5/23/09 | 375 |
| 5/23/09 | 374 |
| 5/23/09 | 374 |
| 5/23/09 | 375 |
| 5/23/09 | 375 |
| 5/23/09 | 374 |
| 5/23/09 | 374 |
| 5/23/09 | 375 |
| 5/23/09 | 376 |
| 5/23/09 | 377 |
| 5/23/09 | 376 |
| 5/23/09 | 376 |
| 5/23/09 | 376 |
| 5/23/09 | 376 |
| 5/23/09 | 375 |
| 5/23/09 | 375 |
| 5/23/09 | 375 |
| 5/23/09 | 374 |
| 5/23/09 | 374 |
| 5/22/09 | 373 |
| 5/22/09 | 373 |
| 5/22/09 | 373 |
| 5/22/09 | 373 |
| 5/22/09 | 374 |
| 5/22/09 | 374 |
| 5/22/09 | 373 |
| 5/22/09 | 373 |
| 5/22/09 | 373 |
| 5/22/09 | 373 |
| 5/22/09 | 373 |
| 5/22/09 | 374 |
| 5/22/09 | 374 |
| 5/22/09 | 374 |
| 5/22/09 | 373 |
| 5/22/09 | 373 |
| 5/22/09 | 373 |
| 5/22/09 | 373 |
| 5/22/09 | 373 |
| 5/22/09 | 373 |
| 5/22/09 | 374 |
| 5/22/09 | 375 |
| 5/22/09 | 375 |
| 5/22/09 | 374 |
| 5/22/09 | 374 |
| 5/22/09 | 373 |
| 5/22/09 | 373 |
| 5/22/09 | 374 |
| 5/22/09 | 375 |
| 5/22/09 | 375 |
| 5/22/09 | 376 |
| 5/22/09 | 376 |
| 5/22/09 | 376 |
| 5/22/09 | 376 |
| 5/22/09 | 376 |
| 5/22/09 | 376 |
| 5/22/09 | 376 |
| 5/22/09 | 376 |
| 5/22/09 | 376 |
| 5/22/09 | 376 |
| 5/22/09 | 376 |
| 5/22/09 | 376 |
| 5/22/09 | 376 |
| 5/22/09 | 376 |
| 5/22/09 | 376 |
| 5/22/09 | 376 |
| 5/22/09 | 375 |
| 5/22/09 | 375 |
| 5/21/09 | 375 |
| 5/21/09 | 374 |
| 5/21/09 | 374 |
| 5/21/09 | 374 |
| 5/21/09 | 374 |
| 5/21/09 | 374 |
| 5/21/09 | 374 |
| 5/21/09 | 374 |
| 5/21/09 | 374 |
| 5/21/09 | 373 |
| 5/21/09 | 374 |
| 5/21/09 | 374 |
| 5/21/09 | 374 |
| 5/21/09 | 374 |
| 5/21/09 | 374 |
| 5/21/09 | 374 |
| 5/21/09 | 374 |
| 5/21/09 | 373 |
| 5/21/09 | 373 |
| 5/21/09 | 372 |
| 5/21/09 | 372 |
| 5/21/09 | 373 |
| 5/21/09 | 376 |
| 5/21/09 | 376 |
| 5/21/09 | 375 |
| 5/21/09 | 374 |
| 5/21/09 | 375 |
| 5/21/09 | 376 |
| 5/21/09 | 376 |
| 5/21/09 | 377 |
| 5/21/09 | 377 |
| 5/21/09 | 377 |
| 5/21/09 | 376 |
| 5/21/09 | 376 |
| 5/21/09 | 376 |
| 5/21/09 | 375 |
| 5/21/09 | 375 |
| 5/21/09 | 376 |
| 5/21/09 | 377 |
| 5/21/09 | 379 |
| 5/21/09 | 379 |
| 5/21/09 | 379 |
| 5/21/09 | 378 |
| 5/21/09 | 378 |
| 5/21/09 | 378 |
| 5/21/09 | 377 |
| 5/21/09 | 378 |
| 5/21/09 | 378 |
| 5/20/09 | 378 |
| 5/20/09 | 377 |
| 5/20/09 | 377 |
| 5/20/09 | 377 |
| 5/20/09 | 377 |
| 5/20/09 | 377 |
| 5/20/09 | 377 |
| 5/20/09 | 376 |
| 5/20/09 | 376 |
| 5/20/09 | 376 |
| 5/20/09 | 376 |
| 5/20/09 | 376 |
| 5/20/09 | 376 |
| 5/20/09 | 376 |
| 5/20/09 | 375 |
| 5/20/09 | 375 |
| 5/20/09 | 375 |
| 5/20/09 | 375 |
| 5/20/09 | 374 |
| 5/20/09 | 374 |
| 5/20/09 | 374 |
| 5/20/09 | 375 |
| 5/20/09 | 375 |
| 5/20/09 | 374 |
| 5/20/09 | 375 |
| 5/20/09 | 375 |
| 5/20/09 | 376 |
| 5/20/09 | 376 |
| 5/20/09 | 376 |
| 5/20/09 | 377 |
| 5/20/09 | 377 |
| 5/20/09 | 377 |
| 5/20/09 | 377 |
| 5/20/09 | 377 |
| 5/20/09 | 377 |
| 5/20/09 | 377 |
| 5/20/09 | 377 |
| 5/20/09 | 377 |
| 5/20/09 | 377 |
| 5/20/09 | 377 |
| 5/20/09 | 377 |
| 5/20/09 | 377 |
| 5/20/09 | 377 |
| 5/20/09 | 377 |
| 5/20/09 | 377 |
| 5/20/09 | 377 |
| 5/20/09 | 378 |
| 5/20/09 | 378 |
| 5/19/09 | 378 |
| 5/19/09 | 378 |
| 5/19/09 | 377 |
| 5/19/09 | 378 |
| 5/19/09 | 378 |
| 5/19/09 | 378 |
| 5/19/09 | 377 |
| 5/19/09 | 377 |
| 5/19/09 | 377 |
| 5/19/09 | 377 |
| 5/19/09 | 377 |
| 5/19/09 | 376 |
| 5/19/09 | 376 |
| 5/19/09 | 377 |
| 5/19/09 | 377 |
| 5/19/09 | 377 |
| 5/19/09 | 377 |
| 5/19/09 | 376 |
| 5/19/09 | 376 |
| 5/19/09 | 376 |
| 5/19/09 | 375 |
| 5/19/09 | 375 |
| 5/19/09 | 375 |
| 5/19/09 | 375 |
| 5/19/09 | 376 |
| 5/19/09 | 377 |
| 5/19/09 | 377 |
| 5/19/09 | 377 |
| 5/19/09 | 377 |
| 5/19/09 | 377 |
| 5/19/09 | 377 |
| 5/19/09 | 377 |
| 5/19/09 | 377 |
| 5/19/09 | 377 |
| 5/19/09 | 377 |
| 5/19/09 | 377 |
| 5/19/09 | 377 |
| 5/19/09 | 377 |
| 5/19/09 | 377 |
| 5/19/09 | 377 |
| 5/19/09 | 377 |
| 5/19/09 | 377 |
| 5/19/09 | 377 |
| 5/19/09 | 377 |
| 5/19/09 | 377 |
| 5/19/09 | 377 |
| 5/19/09 | 377 |
| 5/19/09 | 377 |
| 5/18/09 | 378 |
| 5/18/09 | 377 |
| 5/18/09 | 378 |
| 5/18/09 | 378 |
| 5/18/09 | 378 |
| 5/18/09 | 378 |
| 5/18/09 | 377 |
| 5/18/09 | 377 |
| 5/18/09 | 377 |
| 5/18/09 | 376 |
| 5/18/09 | 377 |
| 5/18/09 | 377 |
| 5/18/09 | 378 |
| 5/18/09 | 377 |
| 5/18/09 | 376 |
| 5/18/09 | 378 |
| 5/18/09 | 377 |
| 5/18/09 | 378 |
| 5/18/09 | 378 |
| 5/18/09 | 378 |
| 5/18/09 | 378 |
| 5/18/09 | 376 |
| 5/18/09 | 376 |
| 5/18/09 | 376 |
| 5/18/09 | 375 |
| 5/18/09 | 376 |
| 5/18/09 | 376 |
| 5/18/09 | 376 |
| 5/18/09 | 377 |
| 5/18/09 | 377 |
| 5/18/09 | 377 |
| 5/18/09 | 377 |
| 5/18/09 | 377 |
| 5/18/09 | 377 |
| 5/18/09 | 377 |
| 5/18/09 | 377 |
| 5/18/09 | 377 |
| 5/18/09 | 377 |
| 5/18/09 | 377 |
| 5/18/09 | 377 |
| 5/18/09 | 378 |
| 5/18/09 | 377 |
| 5/18/09 | 377 |
| 5/18/09 | 378 |
| 5/18/09 | 378 |
| 5/18/09 | 378 |
| 5/18/09 | 378 |
| 5/18/09 | 378 |
| 5/17/09 | 378 |
| 5/17/09 | 378 |
| 5/17/09 | 378 |
| 5/17/09 | 378 |
| 5/17/09 | 378 |
| 5/17/09 | 378 |
| 5/17/09 | 378 |
| 5/17/09 | 378 |
| 5/17/09 | 378 |
| 5/17/09 | 378 |
| 5/17/09 | 378 |
| 5/17/09 | 378 |
| 5/17/09 | 378 |
| 5/17/09 | 378 |
| 5/17/09 | 377 |
| 5/17/09 | 377 |
| 5/17/09 | 377 |
| 5/17/09 | 377 |
| 5/17/09 | 378 |
| 5/17/09 | 378 |
| 5/17/09 | 377 |
| 5/17/09 | 377 |
| 5/17/09 | 377 |
| 5/17/09 | 376 |
| 5/17/09 | 376 |
| 5/17/09 | 376 |
| 5/17/09 | 376 |
| 5/17/09 | 376 |
| 5/17/09 | 377 |
| 5/17/09 | 377 |
| 5/17/09 | 377 |
| 5/17/09 | 377 |
| 5/17/09 | 377 |
| 5/17/09 | 377 |
| 5/17/09 | 377 |
| 5/17/09 | 377 |
| 5/17/09 | 377 |
| 5/17/09 | 377 |
| 5/17/09 | 377 |
| 5/17/09 | 377 |
| 5/17/09 | 377 |
| 5/17/09 | 377 |
| 5/17/09 | 377 |
| 5/17/09 | 377 |
| 5/17/09 | 377 |
| 5/17/09 | 377 |
| 5/17/09 | 377 |
| 5/17/09 | 377 |
| 5/16/09 | 377 |
| 5/16/09 | 377 |
| 5/16/09 | 377 |
| 5/16/09 | 377 |
| 5/16/09 | 377 |
| 5/16/09 | 376 |
| 5/16/09 | 379 |
| 5/16/09 | 379 |
| 5/16/09 | 379 |
| 5/16/09 | 379 |
| 5/16/09 | 379 |
| 5/16/09 | 379 |
| 5/16/09 | 379 |
| 5/16/09 | 379 |
| 5/16/09 | 378 |
| 5/16/09 | 378 |
| 5/16/09 | 377 |
| 5/16/09 | 378 |
| 5/16/09 | 379 |
| 5/16/09 | 379 |
| 5/16/09 | 379 |
| 5/16/09 | 379 |
| 5/16/09 | 380 |
| 5/16/09 | 379 |
| 5/16/09 | 380 |
| 5/16/09 | 380 |
| 5/16/09 | 380 |
| 5/16/09 | 380 |
| 5/16/09 | 380 |
| 5/16/09 | 381 |
| 5/16/09 | 380 |
| 5/16/09 | 381 |
| 5/16/09 | 381 |
| 5/16/09 | 381 |
| 5/16/09 | 381 |
| 5/16/09 | 382 |
| 5/16/09 | 382 |
| 5/16/09 | 382 |
| 5/16/09 | 381 |
| 5/16/09 | 381 |
| 5/16/09 | 381 |
| 5/16/09 | 381 |
| 5/16/09 | 381 |
| 5/16/09 | 382 |
| 5/16/09 | 382 |
| 5/16/09 | 381 |
| 5/16/09 | 381 |
| 5/16/09 | 381 |
| 5/15/09 | 381 |
| 5/15/09 | 381 |
| 5/15/09 | 381 |
| 5/15/09 | 380 |
| 5/15/09 | 380 |
| 5/15/09 | 380 |
| 5/15/09 | 380 |
| 5/15/09 | 380 |
| 5/15/09 | 380 |
| 5/15/09 | 381 |
| 5/15/09 | 380 |
| 5/15/09 | 381 |
| 5/15/09 | 380 |
| 5/15/09 | 381 |
| 5/15/09 | 380 |
| 5/15/09 | 381 |
| 5/15/09 | 380 |
| 5/15/09 | 380 |
| 5/15/09 | 379 |
| 5/15/09 | 380 |
| 5/15/09 | 380 |
| 5/15/09 | 380 |
| 5/15/09 | 380 |
| 5/15/09 | 380 |
| 5/15/09 | 379 |
| 5/15/09 | 379 |
| 5/15/09 | 379 |
| 5/15/09 | 379 |
| 5/15/09 | 379 |
| 5/15/09 | 379 |
| 5/15/09 | 380 |
| 5/15/09 | 380 |
| 5/15/09 | 380 |
| 5/15/09 | 380 |
| 5/15/09 | 380 |
| 5/15/09 | 380 |
| 5/15/09 | 380 |
| 5/15/09 | 380 |
| 5/15/09 | 380 |
| 5/15/09 | 380 |
| 5/15/09 | 380 |
| 5/15/09 | 380 |
| 5/15/09 | 379 |
| 5/15/09 | 379 |
| 5/15/09 | 379 |
| 5/15/09 | 379 |
| 5/15/09 | 379 |
| 5/15/09 | 379 |
| 5/14/09 | 379 |
| 5/14/09 | 379 |
| 5/14/09 | 379 |
| 5/14/09 | 379 |
| 5/14/09 | 379 |
| 5/14/09 | 380 |
| 5/14/09 | 380 |
| 5/14/09 | 380 |
| 5/14/09 | 380 |
| 5/14/09 | 380 |
| 5/14/09 | 380 |
| 5/14/09 | 380 |
| 5/14/09 | 380 |
| 5/14/09 | 380 |
| 5/14/09 | 380 |
| 5/14/09 | 380 |
| 5/14/09 | 380 |
| 5/14/09 | 380 |
| 5/14/09 | 380 |
| 5/14/09 | 380 |
| 5/14/09 | 379 |
| 5/14/09 | 380 |
| 5/14/09 | 380 |
| 5/14/09 | 379 |
| 5/14/09 | 379 |
| 5/14/09 | 379 |
| 5/14/09 | 379 |
| 5/14/09 | 379 |
| 5/14/09 | 379 |
| 5/14/09 | 379 |
| 5/14/09 | 379 |
| 5/14/09 | 379 |
| 5/14/09 | 379 |
| 5/14/09 | 379 |
| 5/14/09 | 379 |
| 5/14/09 | 379 |
| 5/14/09 | 379 |
| 5/14/09 | 379 |
| 5/14/09 | 380 |
| 5/14/09 | 379 |
| 5/14/09 | 379 |
| 5/14/09 | 379 |
| 5/14/09 | 379 |
| 5/14/09 | 379 |
| 5/14/09 | 379 |
| 5/14/09 | 379 |
| 5/14/09 | 379 |
| 5/14/09 | 379 |
| 5/13/09 | 379 |
| 5/13/09 | 380 |
| 5/13/09 | 379 |
| 5/13/09 | 379 |
| 5/13/09 | 379 |
| 5/13/09 | 379 |
| 5/13/09 | 379 |
| 5/13/09 | 379 |
| 5/13/09 | 379 |
| 5/13/09 | 379 |
| 5/13/09 | 379 |
| 5/13/09 | 379 |
| 5/13/09 | 379 |
| 5/13/09 | 380 |
| 5/13/09 | 379 |
| 5/13/09 | 380 |
| 5/13/09 | 380 |
| 5/13/09 | 380 |
| 5/13/09 | 380 |
| 5/13/09 | 380 |
| 5/13/09 | 380 |
| 5/13/09 | 379 |
| 5/13/09 | 379 |
| 5/13/09 | 379 |
| 5/13/09 | 379 |
| 5/13/09 | 379 |
| 5/13/09 | 379 |
| 5/13/09 | 379 |
| 5/13/09 | 379 |
| 5/13/09 | 379 |
| 5/13/09 | 379 |
| 5/13/09 | 379 |
| 5/13/09 | 379 |
| 5/13/09 | 379 |
| 5/13/09 | 379 |
| 5/13/09 | 380 |
| 5/13/09 | 380 |
| 5/13/09 | 380 |
| 5/13/09 | 379 |
| 5/13/09 | 379 |
| 5/13/09 | 379 |
| 5/13/09 | 380 |
| 5/13/09 | 380 |
| 5/13/09 | 380 |
| 5/13/09 | 380 |
| 5/13/09 | 380 |
| 5/13/09 | 380 |
| 5/13/09 | 380 |
| 5/12/09 | 380 |
| 5/12/09 | 380 |
| 5/12/09 | 380 |
| 5/12/09 | 380 |
| 5/12/09 | 380 |
| 5/12/09 | 380 |
| 5/12/09 | 380 |
| 5/12/09 | 380 |
| 5/12/09 | 380 |
| 5/12/09 | 379 |
| 5/12/09 | 380 |
| 5/12/09 | 380 |
| 5/12/09 | 380 |
| 5/12/09 | 380 |
| 5/12/09 | 380 |
| 5/12/09 | 380 |
| 5/12/09 | 380 |
| 5/12/09 | 380 |
| 5/12/09 | 379 |
| 5/12/09 | 380 |
| 5/12/09 | 379 |
| 5/12/09 | 380 |
| 5/12/09 | 380 |
| 5/12/09 | 379 |
| 5/12/09 | 379 |
| 5/12/09 | 380 |
| 5/12/09 | 380 |
| 5/12/09 | 380 |
| 5/12/09 | 380 |
| 5/12/09 | 380 |
| 5/12/09 | 380 |
| 5/12/09 | 380 |
| 5/12/09 | 380 |
| 5/12/09 | 380 |
| 5/12/09 | 380 |
| 5/12/09 | 380 |
| 5/12/09 | 380 |
| 5/12/09 | 380 |
| 5/12/09 | 380 |
| 5/12/09 | 380 |
| 5/12/09 | 380 |
| 5/12/09 | 380 |
| 5/12/09 | 380 |
| 5/12/09 | 380 |
| 5/12/09 | 379 |
| 5/12/09 | 379 |
| 5/12/09 | 380 |
| 5/12/09 | 380 |
| 5/11/09 | 380 |
| 5/11/09 | 380 |
| 5/11/09 | 380 |
| 5/11/09 | 379 |
| 5/11/09 | 379 |
| 5/11/09 | 380 |
| 5/11/09 | 380 |
| 5/11/09 | 380 |
| 5/11/09 | 379 |
| 5/11/09 | 379 |
| 5/11/09 | 380 |
| 5/11/09 | 379 |
| 5/11/09 | 379 |
| 5/11/09 | 379 |
| 5/11/09 | 380 |
| 5/11/09 | 379 |
| 5/11/09 | 379 |
| 5/11/09 | 380 |
| 5/11/09 | 379 |
| 5/11/09 | 379 |
| 5/11/09 | 379 |
| 5/11/09 | 379 |
| 5/11/09 | 380 |
| 5/11/09 | 379 |
| 5/11/09 | 379 |
| 5/11/09 | 380 |
| 5/11/09 | 380 |
| 5/11/09 | 380 |
| 5/11/09 | 379 |
| 5/11/09 | 379 |
| 5/11/09 | 379 |
| 5/11/09 | 379 |
| 5/11/09 | 379 |
| 5/11/09 | 379 |
| 5/11/09 | 379 |
| 5/11/09 | 380 |
| 5/11/09 | 380 |
| 5/11/09 | 380 |
| 5/11/09 | 380 |
| 5/11/09 | 380 |
| 5/11/09 | 380 |
| 5/11/09 | 380 |
| 5/11/09 | 380 |
| 5/11/09 | 380 |
| 5/11/09 | 380 |
| 5/11/09 | 380 |
| 5/11/09 | 380 |
| 5/11/09 | 380 |
| 5/10/09 | 380 |
| 5/10/09 | 380 |
| 5/10/09 | 380 |
| 5/10/09 | 380 |
| 5/10/09 | 380 |
| 5/10/09 | 380 |
| 5/10/09 | 380 |
| 5/10/09 | 380 |
| 5/10/09 | 380 |
| 5/10/09 | 379 |
| 5/10/09 | 379 |
| 5/10/09 | 379 |
| 5/10/09 | 379 |
| 5/10/09 | 379 |
| 5/10/09 | 379 |
| 5/10/09 | 379 |
| 5/10/09 | 379 |
| 5/10/09 | 379 |
| 5/10/09 | 379 |
| 5/10/09 | 379 |
| 5/10/09 | 379 |
| 5/10/09 | 379 |
| 5/10/09 | 379 |
| 5/10/09 | 379 |
| 5/10/09 | 379 |
| 5/10/09 | 379 |
| 5/10/09 | 379 |
| 5/10/09 | 379 |
| 5/10/09 | 379 |
| 5/10/09 | 379 |
| 5/10/09 | 379 |
| 5/10/09 | 379 |
| 5/10/09 | 379 |
| 5/10/09 | 379 |
| 5/10/09 | 379 |
| 5/10/09 | 379 |
| 5/10/09 | 379 |
| 5/10/09 | 379 |
| 5/10/09 | 379 |
| 5/10/09 | 379 |
| 5/10/09 | 379 |
| 5/10/09 | 379 |
| 5/10/09 | 379 |
| 5/10/09 | 379 |
| 5/10/09 | 379 |
| 5/10/09 | 379 |
| 5/10/09 | 379 |
| 5/10/09 | 379 |
| 5/9/09 | 379 |
| 5/9/09 | 379 |
| 5/9/09 | 379 |
| 5/9/09 | 379 |
| 5/9/09 | 379 |
| 5/9/09 | 379 |
| 5/9/09 | 379 |
| 5/9/09 | 379 |
| 5/9/09 | 379 |
| 5/9/09 | 379 |
| 5/9/09 | 379 |
| 5/9/09 | 379 |
| 5/9/09 | 379 |
| 5/9/09 | 379 |
| 5/9/09 | 379 |
| 5/9/09 | 379 |
| 5/9/09 | 379 |
| 5/9/09 | 379 |
| 5/9/09 | 379 |
| 5/9/09 | 379 |
| 5/9/09 | 378 |
| 5/9/09 | 379 |
| 5/9/09 | 378 |
| 5/9/09 | 379 |
| 5/9/09 | 378 |
| 5/9/09 | 379 |
| 5/9/09 | 379 |
| 5/9/09 | 379 |
| 5/9/09 | 379 |
| 5/9/09 | 379 |
| 5/9/09 | 379 |
| 5/9/09 | 379 |
| 5/9/09 | 379 |
| 5/9/09 | 379 |
| 5/9/09 | 379 |
| 5/9/09 | 379 |
| 5/9/09 | 379 |
| 5/9/09 | 379 |
| 5/9/09 | 380 |
| 5/9/09 | 379 |
| 5/9/09 | 379 |
| 5/9/09 | 379 |
| 5/9/09 | 379 |
| 5/9/09 | 379 |
| 5/9/09 | 379 |
| 5/9/09 | 379 |
| 5/9/09 | 380 |
| 5/9/09 | 380 |
| 5/8/09 | 379 |
| 5/8/09 | 380 |
| 5/8/09 | 379 |
| 5/8/09 | 379 |
| 5/8/09 | 379 |
| 5/8/09 | 379 |
| 5/8/09 | 379 |
| 5/8/09 | 379 |
| 5/8/09 | 379 |
| 5/8/09 | 379 |
| 5/8/09 | 379 |
| 5/8/09 | 379 |
| 5/8/09 | 378 |
| 5/8/09 | 379 |
| 5/8/09 | 379 |
| 5/8/09 | 379 |
| 5/8/09 | 379 |
| 5/8/09 | 378 |
| 5/8/09 | 379 |
| 5/8/09 | 379 |
| 5/8/09 | 378 |
| 5/8/09 | 378 |
| 5/8/09 | 379 |
| 5/8/09 | 378 |
| 5/8/09 | 378 |
| 5/8/09 | 378 |
| 5/8/09 | 378 |
| 5/8/09 | 378 |
| 5/8/09 | 378 |
| 5/8/09 | 378 |
| 5/8/09 | 379 |
| 5/8/09 | 378 |
| 5/8/09 | 378 |
| 5/8/09 | 378 |
| 5/8/09 | 378 |
| 5/8/09 | 378 |
| 5/8/09 | 378 |
| 5/8/09 | 378 |
| 5/8/09 | 378 |
| 5/8/09 | 378 |
| 5/8/09 | 378 |
| 5/8/09 | 378 |
| 5/8/09 | 378 |
| 5/8/09 | 378 |
| 5/8/09 | 378 |
| 5/8/09 | 378 |
| 5/8/09 | 378 |
| 5/8/09 | 378 |
| 5/7/09 | 378 |
| 5/7/09 | 379 |
| 5/7/09 | 378 |
| 5/7/09 | 378 |
| 5/7/09 | 378 |
| 5/7/09 | 378 |
| 5/7/09 | 378 |
| 5/7/09 | 378 |
| 5/7/09 | 378 |
| 5/7/09 | 378 |
| 5/7/09 | 379 |
| 5/7/09 | 379 |
| 5/7/09 | 379 |
| 5/7/09 | 378 |
| 5/7/09 | 378 |
| 5/7/09 | 378 |
| 5/7/09 | 378 |
| 5/7/09 | 378 |
| 5/7/09 | 378 |
| 5/7/09 | 378 |
| 5/7/09 | 378 |
| 5/7/09 | 378 |
| 5/7/09 | 378 |
| 5/7/09 | 378 |
| 5/7/09 | 378 |
| 5/7/09 | 378 |
| 5/7/09 | 378 |
| 5/7/09 | 378 |
| 5/7/09 | 378 |
| 5/7/09 | 378 |
| 5/7/09 | 378 |
| 5/7/09 | 378 |
| 5/7/09 | 378 |
| 5/7/09 | 378 |
| 5/7/09 | 378 |
| 5/7/09 | 378 |
| 5/7/09 | 378 |
| 5/7/09 | 378 |
| 5/7/09 | 378 |
| 5/7/09 | 378 |
| 5/7/09 | 378 |
| 5/7/09 | 378 |
| 5/7/09 | 378 |
| 5/7/09 | 378 |
| 5/7/09 | 377 |
| 5/7/09 | 377 |
| 5/7/09 | 377 |
| 5/7/09 | 378 |
| 5/6/09 | 378 |
| 5/6/09 | 378 |
| 5/6/09 | 378 |
| 5/6/09 | 378 |
| 5/6/09 | 378 |
| 5/6/09 | 377 |
| 5/6/09 | 378 |
| 5/6/09 | 378 |
| 5/6/09 | 378 |
| 5/6/09 | 379 |
| 5/6/09 | 379 |
| 5/6/09 | 379 |
| 5/6/09 | 379 |
| 5/6/09 | 379 |
| 5/6/09 | 379 |
| 5/6/09 | 379 |
| 5/6/09 | 379 |
| 5/6/09 | 379 |
| 5/6/09 | 379 |
| 5/6/09 | 379 |
| 5/6/09 | 379 |
| 5/6/09 | 379 |
| 5/6/09 | 379 |
| 5/6/09 | 379 |
| 5/6/09 | 379 |
| 5/6/09 | 379 |
| 5/6/09 | 379 |
| 5/6/09 | 379 |
| 5/6/09 | 379 |
| 5/6/09 | 379 |
| 5/6/09 | 379 |
| 5/6/09 | 379 |
| 5/6/09 | 379 |
| 5/6/09 | 379 |
| 5/6/09 | 379 |
| 5/6/09 | 379 |
| 5/6/09 | 379 |
| 5/6/09 | 379 |
| 5/6/09 | 379 |
| 5/6/09 | 379 |
| 5/6/09 | 378 |
| 5/6/09 | 379 |
| 5/6/09 | 378 |
| 5/6/09 | 378 |
| 5/6/09 | 378 |
| 5/6/09 | 378 |
| 5/6/09 | 378 |
| 5/6/09 | 378 |
| 5/5/09 | 378 |
| 5/5/09 | 379 |
| 5/5/09 | 379 |
| 5/5/09 | 379 |
| 5/5/09 | 379 |
| 5/5/09 | 379 |
| 5/5/09 | 379 |
| 5/5/09 | 379 |
| 5/5/09 | 379 |
| 5/5/09 | 379 |
| 5/5/09 | 379 |
| 5/5/09 | 379 |
| 5/5/09 | 379 |
| 5/5/09 | 379 |
| 5/5/09 | 379 |
| 5/5/09 | 379 |
| 5/5/09 | 379 |
| 5/5/09 | 379 |
| 5/5/09 | 379 |
| 5/5/09 | 379 |
| 5/5/09 | 379 |
| 5/5/09 | 379 |
| 5/5/09 | 379 |
| 5/5/09 | 379 |
| 5/5/09 | 379 |
| 5/5/09 | 379 |
| 5/5/09 | 379 |
| 5/5/09 | 379 |
| 5/5/09 | 379 |
| 5/5/09 | 379 |
| 5/5/09 | 379 |
| 5/5/09 | 379 |
| 5/5/09 | 379 |
| 5/5/09 | 379 |
| 5/5/09 | 379 |
| 5/5/09 | 379 |
| 5/5/09 | 379 |
| 5/5/09 | 379 |
| 5/5/09 | 379 |
| 5/5/09 | 379 |
| 5/5/09 | 379 |
| 5/5/09 | 379 |
| 5/5/09 | 379 |
| 5/5/09 | 379 |
| 5/5/09 | 379 |
| 5/5/09 | 379 |
| 5/5/09 | 379 |
| 5/5/09 | 379 |
| 5/4/09 | 379 |
| 5/4/09 | 379 |
| 5/4/09 | 379 |
| 5/4/09 | 379 |
| 5/4/09 | 379 |
| 5/4/09 | 379 |
| 5/4/09 | 379 |
| 5/4/09 | 378 |
| 5/4/09 | 378 |
| 5/4/09 | 378 |
| 5/4/09 | 378 |
| 5/4/09 | 378 |
| 5/4/09 | 378 |
| 5/4/09 | 379 |
| 5/4/09 | 378 |
| 5/4/09 | 378 |
| 5/4/09 | 379 |
| 5/4/09 | 379 |
| 5/4/09 | 379 |
| 5/4/09 | 379 |
| 5/4/09 | 379 |
| 5/4/09 | 379 |
| 5/4/09 | 380 |
| 5/4/09 | 380 |
| 5/4/09 | 380 |
| 5/4/09 | 380 |
| 5/4/09 | 380 |
| 5/4/09 | 381 |
| 5/4/09 | 381 |
| 5/4/09 | 381 |
| 5/4/09 | 381 |
| 5/4/09 | 381 |
| 5/4/09 | 381 |
| 5/4/09 | 381 |
| 5/4/09 | 381 |
| 5/4/09 | 381 |
| 5/4/09 | 381 |
| 5/4/09 | 381 |
| 5/4/09 | 381 |
| 5/4/09 | 381 |
| 5/4/09 | 381 |
| 5/4/09 | 381 |
| 5/4/09 | 381 |
| 5/4/09 | 381 |
| 5/4/09 | 381 |
| 5/4/09 | 381 |
| 5/4/09 | 381 |
| 5/4/09 | 381 |
| 5/3/09 | 381 |
| 5/3/09 | 381 |
| 5/3/09 | 381 |
| 5/3/09 | 381 |
| 5/3/09 | 381 |
| 5/3/09 | 380 |
| 5/3/09 | 381 |
| 5/3/09 | 381 |
| 5/3/09 | 381 |
| 5/3/09 | 381 |
| 5/3/09 | 380 |
| 5/3/09 | 381 |
| 5/3/09 | 381 |
| 5/3/09 | 381 |
| 5/3/09 | 381 |
| 5/3/09 | 381 |
| 5/3/09 | 381 |
| 5/3/09 | 380 |
| 5/3/09 | 379 |
| 5/3/09 | 380 |
| 5/3/09 | 380 |
| 5/3/09 | 380 |
| 5/3/09 | 380 |
| 5/3/09 | 381 |
| 5/3/09 | 380 |
| 5/3/09 | 380 |
| 5/3/09 | 380 |
| 5/3/09 | 381 |
| 5/3/09 | 381 |
| 5/3/09 | 381 |
| 5/3/09 | 381 |
| 5/3/09 | 381 |
| 5/3/09 | 381 |
| 5/3/09 | 381 |
| 5/3/09 | 381 |
| 5/3/09 | 381 |
| 5/3/09 | 380 |
| 5/3/09 | 381 |
| 5/3/09 | 380 |
| 5/3/09 | 380 |
| 5/3/09 | 380 |
| 5/3/09 | 380 |
| 5/3/09 | 380 |
| 5/3/09 | 380 |
| 5/3/09 | 380 |
| 5/3/09 | 380 |
| 5/3/09 | 380 |
| 5/3/09 | 380 |
| 5/2/09 | 380 |
| 5/2/09 | 380 |
| 5/2/09 | 380 |
| 5/2/09 | 380 |
| 5/2/09 | 380 |
| 5/2/09 | 380 |
| 5/2/09 | 380 |
| 5/2/09 | 380 |
| 5/2/09 | 380 |
| 5/2/09 | 380 |
| 5/2/09 | 380 |
| 5/2/09 | 380 |
| 5/2/09 | 380 |
| 5/2/09 | 381 |
| 5/2/09 | 381 |
| 5/2/09 | 381 |
| 5/2/09 | 381 |
| 5/2/09 | 380 |
| 5/2/09 | 380 |
| 5/2/09 | 380 |
| 5/2/09 | 380 |
| 5/2/09 | 380 |
| 5/2/09 | 380 |
| 5/2/09 | 380 |
| 5/2/09 | 380 |
| 5/2/09 | 379 |
| 5/2/09 | 379 |
| 5/2/09 | 379 |
| 5/2/09 | 379 |
| 5/2/09 | 379 |
| 5/2/09 | 379 |
| 5/2/09 | 379 |
| 5/2/09 | 379 |
| 5/2/09 | 379 |
| 5/2/09 | 379 |
| 5/2/09 | 379 |
| 5/2/09 | 379 |
| 5/2/09 | 379 |
| 5/2/09 | 379 |
| 5/2/09 | 379 |
| 5/2/09 | 379 |
| 5/2/09 | 379 |
| 5/2/09 | 379 |
| 5/2/09 | 379 |
| 5/2/09 | 379 |
| 5/2/09 | 379 |
| 5/2/09 | 379 |
| 5/2/09 | 379 |
| 5/1/09 | 379 |
| 5/1/09 | 379 |
| 5/1/09 | 380 |
| 5/1/09 | 381 |
| 5/1/09 | 381 |
| 5/1/09 | 382 |
| 5/1/09 | 382 |
| 5/1/09 | 382 |
| 5/1/09 | 384 |
| 5/1/09 | 383 |
| 5/1/09 | 384 |
| 5/1/09 | 382 |
| 5/1/09 | 383 |
| 5/1/09 | 383 |
| 5/1/09 | 383 |
| 5/1/09 | 382 |
| 5/1/09 | 382 |
| 5/1/09 | 382 |
| 5/1/09 | 382 |
| 5/1/09 | 382 |
| 5/1/09 | 382 |
| 5/1/09 | 382 |
| 5/1/09 | 382 |
| 5/1/09 | 382 |
| 5/1/09 | 382 |
| 5/1/09 | 382 |
| 5/1/09 | 382 |
| 5/1/09 | 382 |
| 5/1/09 | 382 |
| 5/1/09 | 382 |
| 5/1/09 | 382 |
| 5/1/09 | 382 |
| 5/1/09 | 382 |
| 5/1/09 | 382 |
| 5/1/09 | 381 |
| 5/1/09 | 382 |
| 5/1/09 | 382 |
| 5/1/09 | 382 |
| 5/1/09 | 382 |
| 5/1/09 | 382 |
| 5/1/09 | 382 |
| 5/1/09 | 382 |
| 5/1/09 | 382 |
| 5/1/09 | 382 |
| 5/1/09 | 382 |
| 5/1/09 | 382 |
| 5/1/09 | 382 |
| 5/1/09 | 382 |
| 4/30/09 | 382 |
| 4/30/09 | 382 |
| 4/30/09 | 382 |
| 4/30/09 | 382 |
| 4/30/09 | 382 |
| 4/30/09 | 382 |
| 4/30/09 | 382 |
| 4/30/09 | 382 |
| 4/30/09 | 382 |
| 4/30/09 | 382 |
| 4/30/09 | 382 |
| 4/30/09 | 382 |
| 4/30/09 | 382 |
| 4/30/09 | 382 |
| 4/30/09 | 382 |
| 4/30/09 | 382 |
| 4/30/09 | 383 |
| 4/30/09 | 384 |
| 4/30/09 | 384 |
| 4/30/09 | 384 |
| 4/30/09 | 384 |
| 4/30/09 | 383 |
| 4/30/09 | 384 |
| 4/30/09 | 384 |
| 4/30/09 | 384 |
| 4/30/09 | 384 |
| 4/30/09 | 384 |
| 4/30/09 | 384 |
| 4/30/09 | 384 |
| 4/30/09 | 384 |
| 4/30/09 | 384 |
| 4/30/09 | 384 |
| 4/30/09 | 384 |
| 4/30/09 | 384 |
| 4/30/09 | 384 |
| 4/30/09 | 383 |
| 4/30/09 | 384 |
| 4/30/09 | 384 |
| 4/30/09 | 384 |
| 4/30/09 | 384 |
| 4/30/09 | 384 |
| 4/30/09 | 384 |
| 4/30/09 | 384 |
| 4/30/09 | 384 |
| 4/30/09 | 384 |
| 4/30/09 | 384 |
| 4/30/09 | 384 |
| 4/30/09 | 384 |
| 4/29/09 | 384 |
| 4/29/09 | 384 |
| 4/29/09 | 384 |
| 4/29/09 | 384 |
| 4/29/09 | 384 |
| 4/29/09 | 384 |
| 4/29/09 | 384 |
| 4/29/09 | 384 |
| 4/29/09 | 384 |
| 4/29/09 | 384 |
| 4/29/09 | 384 |
| 4/29/09 | 384 |
| 4/29/09 | 384 |
| 4/29/09 | 384 |
| 4/29/09 | 384 |
| 4/29/09 | 384 |
| 4/29/09 | 384 |
| 4/29/09 | 384 |
| 4/29/09 | 384 |
| 4/29/09 | 384 |
| 4/29/09 | 384 |
| 4/29/09 | 384 |
| 4/29/09 | 384 |
| 4/29/09 | 384 |
| 4/29/09 | 384 |
| 4/29/09 | 384 |
| 4/29/09 | 384 |
| 4/29/09 | 384 |
| 4/29/09 | 384 |
| 4/29/09 | 384 |
| 4/29/09 | 385 |
| 4/29/09 | 385 |
| 4/29/09 | 384 |
| 4/29/09 | 384 |
| 4/29/09 | 384 |
| 4/29/09 | 384 |
| 4/29/09 | 384 |
| 4/29/09 | 384 |
| 4/29/09 | 384 |
| 4/29/09 | 384 |
| 4/29/09 | 384 |
| 4/29/09 | 384 |
| 4/29/09 | 384 |
| 4/29/09 | 384 |
| 4/29/09 | 384 |
| 4/29/09 | 384 |
| 4/29/09 | 384 |
| 4/29/09 | 384 |
| 4/28/09 | 384 |
| 4/28/09 | 384 |
| 4/28/09 | 384 |
| 4/28/09 | 384 |
| 4/28/09 | 384 |
| 4/28/09 | 384 |
| 4/28/09 | 385 |
| 4/28/09 | 385 |
| 4/28/09 | 385 |
| 4/28/09 | 385 |
| 4/28/09 | 385 |
| 4/28/09 | 384 |
| 4/28/09 | 385 |
| 4/28/09 | 385 |
| 4/28/09 | 383 |
| 4/28/09 | 385 |
| 4/28/09 | 386 |
| 4/28/09 | 386 |
| 4/28/09 | 387 |
| 4/28/09 | 387 |
| 4/28/09 | 388 |
| 4/28/09 | 387 |
| 4/28/09 | 386 |
| 4/28/09 | 385 |
| 4/28/09 | 385 |
| 4/28/09 | 384 |
| 4/28/09 | 385 |
| 4/28/09 | 385 |
| 4/28/09 | 385 |
| 4/28/09 | 385 |
| 4/28/09 | 385 |
| 4/28/09 | 386 |
| 4/28/09 | 385 |
| 4/28/09 | 385 |
| 4/28/09 | 385 |
| 4/28/09 | 385 |
| 4/28/09 | 385 |
| 4/28/09 | 385 |
| 4/28/09 | 385 |
| 4/28/09 | 385 |
| 4/28/09 | 385 |
| 4/28/09 | 386 |
| 4/28/09 | 385 |
| 4/28/09 | 385 |
| 4/28/09 | 386 |
| 4/28/09 | 386 |
| 4/28/09 | 386 |
| 4/28/09 | 386 |
| 4/27/09 | 386 |
| 4/27/09 | 387 |
| 4/27/09 | 387 |
| 4/27/09 | 386 |
| 4/27/09 | 386 |
| 4/27/09 | 385 |
| 4/27/09 | 385 |
| 4/27/09 | 385 |
| 4/27/09 | 385 |
| 4/27/09 | 386 |
| 4/27/09 | 386 |
| 4/27/09 | 385 |
| 4/27/09 | 385 |
| 4/27/09 | 386 |
| 4/27/09 | 387 |
| 4/27/09 | 386 |
| 4/27/09 | 385 |
| 4/27/09 | 385 |